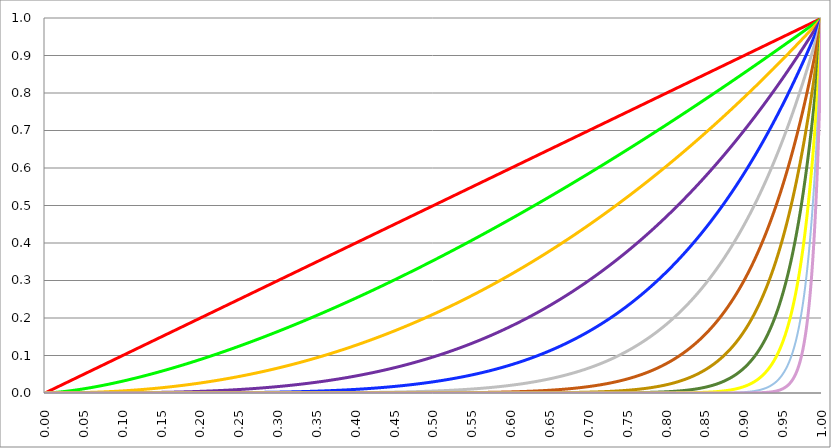
| Category | Series 0 | Series 3 | Series 4 | Series 5 | Series 2 | Series 6 | Series 7 | Series 8 | Series 9 | Series 10 | Series 11 | Series 12 |
|---|---|---|---|---|---|---|---|---|---|---|---|---|
| 0.0 | 0 | 0 | 0 | 0 | 0 | 0 | 0 | 0 | 0 | 0 | 0 | 0 |
| 0.0005 | 0 | 0 | 0 | 0 | 0 | 0 | 0 | 0 | 0 | 0 | 0 | 0 |
| 0.001 | 0.001 | 0 | 0 | 0 | 0 | 0 | 0 | 0 | 0 | 0 | 0 | 0 |
| 0.0015 | 0.002 | 0 | 0 | 0 | 0 | 0 | 0 | 0 | 0 | 0 | 0 | 0 |
| 0.002 | 0.002 | 0 | 0 | 0 | 0 | 0 | 0 | 0 | 0 | 0 | 0 | 0 |
| 0.0025 | 0.002 | 0 | 0 | 0 | 0 | 0 | 0 | 0 | 0 | 0 | 0 | 0 |
| 0.003 | 0.003 | 0 | 0 | 0 | 0 | 0 | 0 | 0 | 0 | 0 | 0 | 0 |
| 0.0035 | 0.004 | 0 | 0 | 0 | 0 | 0 | 0 | 0 | 0 | 0 | 0 | 0 |
| 0.004 | 0.004 | 0 | 0 | 0 | 0 | 0 | 0 | 0 | 0 | 0 | 0 | 0 |
| 0.0045 | 0.004 | 0 | 0 | 0 | 0 | 0 | 0 | 0 | 0 | 0 | 0 | 0 |
| 0.005 | 0.005 | 0 | 0 | 0 | 0 | 0 | 0 | 0 | 0 | 0 | 0 | 0 |
| 0.0055 | 0.006 | 0 | 0 | 0 | 0 | 0 | 0 | 0 | 0 | 0 | 0 | 0 |
| 0.006 | 0.006 | 0 | 0 | 0 | 0 | 0 | 0 | 0 | 0 | 0 | 0 | 0 |
| 0.0065 | 0.006 | 0.001 | 0 | 0 | 0 | 0 | 0 | 0 | 0 | 0 | 0 | 0 |
| 0.007 | 0.007 | 0.001 | 0 | 0 | 0 | 0 | 0 | 0 | 0 | 0 | 0 | 0 |
| 0.0075 | 0.008 | 0.001 | 0 | 0 | 0 | 0 | 0 | 0 | 0 | 0 | 0 | 0 |
| 0.008 | 0.008 | 0.001 | 0 | 0 | 0 | 0 | 0 | 0 | 0 | 0 | 0 | 0 |
| 0.0085 | 0.008 | 0.001 | 0 | 0 | 0 | 0 | 0 | 0 | 0 | 0 | 0 | 0 |
| 0.009 | 0.009 | 0.001 | 0 | 0 | 0 | 0 | 0 | 0 | 0 | 0 | 0 | 0 |
| 0.0095 | 0.01 | 0.001 | 0 | 0 | 0 | 0 | 0 | 0 | 0 | 0 | 0 | 0 |
| 0.01 | 0.01 | 0.001 | 0 | 0 | 0 | 0 | 0 | 0 | 0 | 0 | 0 | 0 |
| 0.0105 | 0.01 | 0.001 | 0 | 0 | 0 | 0 | 0 | 0 | 0 | 0 | 0 | 0 |
| 0.011 | 0.011 | 0.001 | 0 | 0 | 0 | 0 | 0 | 0 | 0 | 0 | 0 | 0 |
| 0.0115 | 0.012 | 0.001 | 0 | 0 | 0 | 0 | 0 | 0 | 0 | 0 | 0 | 0 |
| 0.012 | 0.012 | 0.001 | 0 | 0 | 0 | 0 | 0 | 0 | 0 | 0 | 0 | 0 |
| 0.0125 | 0.012 | 0.001 | 0 | 0 | 0 | 0 | 0 | 0 | 0 | 0 | 0 | 0 |
| 0.013 | 0.013 | 0.001 | 0 | 0 | 0 | 0 | 0 | 0 | 0 | 0 | 0 | 0 |
| 0.0135 | 0.014 | 0.002 | 0 | 0 | 0 | 0 | 0 | 0 | 0 | 0 | 0 | 0 |
| 0.014 | 0.014 | 0.002 | 0 | 0 | 0 | 0 | 0 | 0 | 0 | 0 | 0 | 0 |
| 0.0145 | 0.014 | 0.002 | 0 | 0 | 0 | 0 | 0 | 0 | 0 | 0 | 0 | 0 |
| 0.015 | 0.015 | 0.002 | 0 | 0 | 0 | 0 | 0 | 0 | 0 | 0 | 0 | 0 |
| 0.0155 | 0.016 | 0.002 | 0 | 0 | 0 | 0 | 0 | 0 | 0 | 0 | 0 | 0 |
| 0.016 | 0.016 | 0.002 | 0 | 0 | 0 | 0 | 0 | 0 | 0 | 0 | 0 | 0 |
| 0.0165 | 0.016 | 0.002 | 0 | 0 | 0 | 0 | 0 | 0 | 0 | 0 | 0 | 0 |
| 0.017 | 0.017 | 0.002 | 0 | 0 | 0 | 0 | 0 | 0 | 0 | 0 | 0 | 0 |
| 0.0175 | 0.018 | 0.002 | 0 | 0 | 0 | 0 | 0 | 0 | 0 | 0 | 0 | 0 |
| 0.018 | 0.018 | 0.002 | 0 | 0 | 0 | 0 | 0 | 0 | 0 | 0 | 0 | 0 |
| 0.0185 | 0.018 | 0.003 | 0 | 0 | 0 | 0 | 0 | 0 | 0 | 0 | 0 | 0 |
| 0.019 | 0.019 | 0.003 | 0 | 0 | 0 | 0 | 0 | 0 | 0 | 0 | 0 | 0 |
| 0.0195 | 0.02 | 0.003 | 0 | 0 | 0 | 0 | 0 | 0 | 0 | 0 | 0 | 0 |
| 0.02 | 0.02 | 0.003 | 0 | 0 | 0 | 0 | 0 | 0 | 0 | 0 | 0 | 0 |
| 0.0205 | 0.02 | 0.003 | 0 | 0 | 0 | 0 | 0 | 0 | 0 | 0 | 0 | 0 |
| 0.021 | 0.021 | 0.003 | 0 | 0 | 0 | 0 | 0 | 0 | 0 | 0 | 0 | 0 |
| 0.0215 | 0.022 | 0.003 | 0 | 0 | 0 | 0 | 0 | 0 | 0 | 0 | 0 | 0 |
| 0.022 | 0.022 | 0.003 | 0 | 0 | 0 | 0 | 0 | 0 | 0 | 0 | 0 | 0 |
| 0.0225 | 0.022 | 0.003 | 0 | 0 | 0 | 0 | 0 | 0 | 0 | 0 | 0 | 0 |
| 0.023 | 0.023 | 0.003 | 0 | 0 | 0 | 0 | 0 | 0 | 0 | 0 | 0 | 0 |
| 0.0235 | 0.024 | 0.004 | 0 | 0 | 0 | 0 | 0 | 0 | 0 | 0 | 0 | 0 |
| 0.024 | 0.024 | 0.004 | 0 | 0 | 0 | 0 | 0 | 0 | 0 | 0 | 0 | 0 |
| 0.0245 | 0.024 | 0.004 | 0 | 0 | 0 | 0 | 0 | 0 | 0 | 0 | 0 | 0 |
| 0.025 | 0.025 | 0.004 | 0 | 0 | 0 | 0 | 0 | 0 | 0 | 0 | 0 | 0 |
| 0.0255 | 0.026 | 0.004 | 0 | 0 | 0 | 0 | 0 | 0 | 0 | 0 | 0 | 0 |
| 0.026 | 0.026 | 0.004 | 0 | 0 | 0 | 0 | 0 | 0 | 0 | 0 | 0 | 0 |
| 0.0265 | 0.026 | 0.004 | 0 | 0 | 0 | 0 | 0 | 0 | 0 | 0 | 0 | 0 |
| 0.027 | 0.027 | 0.004 | 0 | 0 | 0 | 0 | 0 | 0 | 0 | 0 | 0 | 0 |
| 0.0275 | 0.028 | 0.005 | 0 | 0 | 0 | 0 | 0 | 0 | 0 | 0 | 0 | 0 |
| 0.028 | 0.028 | 0.005 | 0 | 0 | 0 | 0 | 0 | 0 | 0 | 0 | 0 | 0 |
| 0.0285 | 0.028 | 0.005 | 0 | 0 | 0 | 0 | 0 | 0 | 0 | 0 | 0 | 0 |
| 0.029 | 0.029 | 0.005 | 0 | 0 | 0 | 0 | 0 | 0 | 0 | 0 | 0 | 0 |
| 0.0295 | 0.03 | 0.005 | 0 | 0 | 0 | 0 | 0 | 0 | 0 | 0 | 0 | 0 |
| 0.03 | 0.03 | 0.005 | 0 | 0 | 0 | 0 | 0 | 0 | 0 | 0 | 0 | 0 |
| 0.0305 | 0.03 | 0.005 | 0 | 0 | 0 | 0 | 0 | 0 | 0 | 0 | 0 | 0 |
| 0.031 | 0.031 | 0.005 | 0 | 0 | 0 | 0 | 0 | 0 | 0 | 0 | 0 | 0 |
| 0.0315 | 0.032 | 0.006 | 0 | 0 | 0 | 0 | 0 | 0 | 0 | 0 | 0 | 0 |
| 0.032 | 0.032 | 0.006 | 0 | 0 | 0 | 0 | 0 | 0 | 0 | 0 | 0 | 0 |
| 0.0325 | 0.032 | 0.006 | 0 | 0 | 0 | 0 | 0 | 0 | 0 | 0 | 0 | 0 |
| 0.033 | 0.033 | 0.006 | 0 | 0 | 0 | 0 | 0 | 0 | 0 | 0 | 0 | 0 |
| 0.0335 | 0.034 | 0.006 | 0 | 0 | 0 | 0 | 0 | 0 | 0 | 0 | 0 | 0 |
| 0.034 | 0.034 | 0.006 | 0 | 0 | 0 | 0 | 0 | 0 | 0 | 0 | 0 | 0 |
| 0.0345 | 0.034 | 0.006 | 0.001 | 0 | 0 | 0 | 0 | 0 | 0 | 0 | 0 | 0 |
| 0.035 | 0.035 | 0.007 | 0.001 | 0 | 0 | 0 | 0 | 0 | 0 | 0 | 0 | 0 |
| 0.0355 | 0.036 | 0.007 | 0.001 | 0 | 0 | 0 | 0 | 0 | 0 | 0 | 0 | 0 |
| 0.036 | 0.036 | 0.007 | 0.001 | 0 | 0 | 0 | 0 | 0 | 0 | 0 | 0 | 0 |
| 0.0365 | 0.036 | 0.007 | 0.001 | 0 | 0 | 0 | 0 | 0 | 0 | 0 | 0 | 0 |
| 0.037 | 0.037 | 0.007 | 0.001 | 0 | 0 | 0 | 0 | 0 | 0 | 0 | 0 | 0 |
| 0.0375 | 0.038 | 0.007 | 0.001 | 0 | 0 | 0 | 0 | 0 | 0 | 0 | 0 | 0 |
| 0.038 | 0.038 | 0.007 | 0.001 | 0 | 0 | 0 | 0 | 0 | 0 | 0 | 0 | 0 |
| 0.0385 | 0.038 | 0.008 | 0.001 | 0 | 0 | 0 | 0 | 0 | 0 | 0 | 0 | 0 |
| 0.039 | 0.039 | 0.008 | 0.001 | 0 | 0 | 0 | 0 | 0 | 0 | 0 | 0 | 0 |
| 0.0395 | 0.04 | 0.008 | 0.001 | 0 | 0 | 0 | 0 | 0 | 0 | 0 | 0 | 0 |
| 0.04 | 0.04 | 0.008 | 0.001 | 0 | 0 | 0 | 0 | 0 | 0 | 0 | 0 | 0 |
| 0.0405 | 0.04 | 0.008 | 0.001 | 0 | 0 | 0 | 0 | 0 | 0 | 0 | 0 | 0 |
| 0.041 | 0.041 | 0.008 | 0.001 | 0 | 0 | 0 | 0 | 0 | 0 | 0 | 0 | 0 |
| 0.0415 | 0.042 | 0.008 | 0.001 | 0 | 0 | 0 | 0 | 0 | 0 | 0 | 0 | 0 |
| 0.042 | 0.042 | 0.009 | 0.001 | 0 | 0 | 0 | 0 | 0 | 0 | 0 | 0 | 0 |
| 0.0425 | 0.042 | 0.009 | 0.001 | 0 | 0 | 0 | 0 | 0 | 0 | 0 | 0 | 0 |
| 0.043 | 0.043 | 0.009 | 0.001 | 0 | 0 | 0 | 0 | 0 | 0 | 0 | 0 | 0 |
| 0.0435 | 0.044 | 0.009 | 0.001 | 0 | 0 | 0 | 0 | 0 | 0 | 0 | 0 | 0 |
| 0.044 | 0.044 | 0.009 | 0.001 | 0 | 0 | 0 | 0 | 0 | 0 | 0 | 0 | 0 |
| 0.0445 | 0.044 | 0.009 | 0.001 | 0 | 0 | 0 | 0 | 0 | 0 | 0 | 0 | 0 |
| 0.045 | 0.045 | 0.01 | 0.001 | 0 | 0 | 0 | 0 | 0 | 0 | 0 | 0 | 0 |
| 0.0455 | 0.046 | 0.01 | 0.001 | 0 | 0 | 0 | 0 | 0 | 0 | 0 | 0 | 0 |
| 0.046 | 0.046 | 0.01 | 0.001 | 0 | 0 | 0 | 0 | 0 | 0 | 0 | 0 | 0 |
| 0.0465 | 0.046 | 0.01 | 0.001 | 0 | 0 | 0 | 0 | 0 | 0 | 0 | 0 | 0 |
| 0.047 | 0.047 | 0.01 | 0.001 | 0 | 0 | 0 | 0 | 0 | 0 | 0 | 0 | 0 |
| 0.0475 | 0.048 | 0.01 | 0.001 | 0 | 0 | 0 | 0 | 0 | 0 | 0 | 0 | 0 |
| 0.048 | 0.048 | 0.011 | 0.001 | 0 | 0 | 0 | 0 | 0 | 0 | 0 | 0 | 0 |
| 0.0485 | 0.048 | 0.011 | 0.001 | 0 | 0 | 0 | 0 | 0 | 0 | 0 | 0 | 0 |
| 0.049 | 0.049 | 0.011 | 0.001 | 0 | 0 | 0 | 0 | 0 | 0 | 0 | 0 | 0 |
| 0.0495 | 0.05 | 0.011 | 0.001 | 0 | 0 | 0 | 0 | 0 | 0 | 0 | 0 | 0 |
| 0.05 | 0.05 | 0.011 | 0.001 | 0 | 0 | 0 | 0 | 0 | 0 | 0 | 0 | 0 |
| 0.0505 | 0.05 | 0.011 | 0.001 | 0 | 0 | 0 | 0 | 0 | 0 | 0 | 0 | 0 |
| 0.051 | 0.051 | 0.012 | 0.001 | 0 | 0 | 0 | 0 | 0 | 0 | 0 | 0 | 0 |
| 0.0515 | 0.052 | 0.012 | 0.001 | 0 | 0 | 0 | 0 | 0 | 0 | 0 | 0 | 0 |
| 0.052 | 0.052 | 0.012 | 0.001 | 0 | 0 | 0 | 0 | 0 | 0 | 0 | 0 | 0 |
| 0.0525 | 0.052 | 0.012 | 0.001 | 0 | 0 | 0 | 0 | 0 | 0 | 0 | 0 | 0 |
| 0.053 | 0.053 | 0.012 | 0.001 | 0 | 0 | 0 | 0 | 0 | 0 | 0 | 0 | 0 |
| 0.0535 | 0.054 | 0.012 | 0.001 | 0 | 0 | 0 | 0 | 0 | 0 | 0 | 0 | 0 |
| 0.054 | 0.054 | 0.013 | 0.001 | 0 | 0 | 0 | 0 | 0 | 0 | 0 | 0 | 0 |
| 0.0545 | 0.054 | 0.013 | 0.001 | 0 | 0 | 0 | 0 | 0 | 0 | 0 | 0 | 0 |
| 0.055 | 0.055 | 0.013 | 0.001 | 0 | 0 | 0 | 0 | 0 | 0 | 0 | 0 | 0 |
| 0.0555 | 0.056 | 0.013 | 0.001 | 0 | 0 | 0 | 0 | 0 | 0 | 0 | 0 | 0 |
| 0.056 | 0.056 | 0.013 | 0.002 | 0 | 0 | 0 | 0 | 0 | 0 | 0 | 0 | 0 |
| 0.0565 | 0.056 | 0.013 | 0.002 | 0 | 0 | 0 | 0 | 0 | 0 | 0 | 0 | 0 |
| 0.057 | 0.057 | 0.014 | 0.002 | 0 | 0 | 0 | 0 | 0 | 0 | 0 | 0 | 0 |
| 0.0575 | 0.058 | 0.014 | 0.002 | 0 | 0 | 0 | 0 | 0 | 0 | 0 | 0 | 0 |
| 0.058 | 0.058 | 0.014 | 0.002 | 0 | 0 | 0 | 0 | 0 | 0 | 0 | 0 | 0 |
| 0.0585 | 0.058 | 0.014 | 0.002 | 0 | 0 | 0 | 0 | 0 | 0 | 0 | 0 | 0 |
| 0.059 | 0.059 | 0.014 | 0.002 | 0 | 0 | 0 | 0 | 0 | 0 | 0 | 0 | 0 |
| 0.0595 | 0.06 | 0.015 | 0.002 | 0 | 0 | 0 | 0 | 0 | 0 | 0 | 0 | 0 |
| 0.06 | 0.06 | 0.015 | 0.002 | 0 | 0 | 0 | 0 | 0 | 0 | 0 | 0 | 0 |
| 0.0605 | 0.06 | 0.015 | 0.002 | 0 | 0 | 0 | 0 | 0 | 0 | 0 | 0 | 0 |
| 0.061 | 0.061 | 0.015 | 0.002 | 0 | 0 | 0 | 0 | 0 | 0 | 0 | 0 | 0 |
| 0.0615 | 0.062 | 0.015 | 0.002 | 0 | 0 | 0 | 0 | 0 | 0 | 0 | 0 | 0 |
| 0.062 | 0.062 | 0.015 | 0.002 | 0 | 0 | 0 | 0 | 0 | 0 | 0 | 0 | 0 |
| 0.0625 | 0.062 | 0.016 | 0.002 | 0 | 0 | 0 | 0 | 0 | 0 | 0 | 0 | 0 |
| 0.063 | 0.063 | 0.016 | 0.002 | 0 | 0 | 0 | 0 | 0 | 0 | 0 | 0 | 0 |
| 0.0635 | 0.064 | 0.016 | 0.002 | 0 | 0 | 0 | 0 | 0 | 0 | 0 | 0 | 0 |
| 0.064 | 0.064 | 0.016 | 0.002 | 0 | 0 | 0 | 0 | 0 | 0 | 0 | 0 | 0 |
| 0.0645 | 0.064 | 0.016 | 0.002 | 0 | 0 | 0 | 0 | 0 | 0 | 0 | 0 | 0 |
| 0.065 | 0.065 | 0.017 | 0.002 | 0 | 0 | 0 | 0 | 0 | 0 | 0 | 0 | 0 |
| 0.0655 | 0.066 | 0.017 | 0.002 | 0 | 0 | 0 | 0 | 0 | 0 | 0 | 0 | 0 |
| 0.066 | 0.066 | 0.017 | 0.002 | 0 | 0 | 0 | 0 | 0 | 0 | 0 | 0 | 0 |
| 0.0665 | 0.066 | 0.017 | 0.002 | 0 | 0 | 0 | 0 | 0 | 0 | 0 | 0 | 0 |
| 0.067 | 0.067 | 0.017 | 0.002 | 0 | 0 | 0 | 0 | 0 | 0 | 0 | 0 | 0 |
| 0.0675 | 0.068 | 0.018 | 0.002 | 0 | 0 | 0 | 0 | 0 | 0 | 0 | 0 | 0 |
| 0.068 | 0.068 | 0.018 | 0.002 | 0 | 0 | 0 | 0 | 0 | 0 | 0 | 0 | 0 |
| 0.0685 | 0.068 | 0.018 | 0.002 | 0 | 0 | 0 | 0 | 0 | 0 | 0 | 0 | 0 |
| 0.069 | 0.069 | 0.018 | 0.002 | 0 | 0 | 0 | 0 | 0 | 0 | 0 | 0 | 0 |
| 0.0695 | 0.07 | 0.018 | 0.002 | 0 | 0 | 0 | 0 | 0 | 0 | 0 | 0 | 0 |
| 0.07 | 0.07 | 0.019 | 0.003 | 0 | 0 | 0 | 0 | 0 | 0 | 0 | 0 | 0 |
| 0.0705 | 0.07 | 0.019 | 0.003 | 0 | 0 | 0 | 0 | 0 | 0 | 0 | 0 | 0 |
| 0.071 | 0.071 | 0.019 | 0.003 | 0 | 0 | 0 | 0 | 0 | 0 | 0 | 0 | 0 |
| 0.0715 | 0.072 | 0.019 | 0.003 | 0 | 0 | 0 | 0 | 0 | 0 | 0 | 0 | 0 |
| 0.072 | 0.072 | 0.019 | 0.003 | 0 | 0 | 0 | 0 | 0 | 0 | 0 | 0 | 0 |
| 0.0725 | 0.072 | 0.02 | 0.003 | 0 | 0 | 0 | 0 | 0 | 0 | 0 | 0 | 0 |
| 0.073 | 0.073 | 0.02 | 0.003 | 0 | 0 | 0 | 0 | 0 | 0 | 0 | 0 | 0 |
| 0.0735 | 0.074 | 0.02 | 0.003 | 0 | 0 | 0 | 0 | 0 | 0 | 0 | 0 | 0 |
| 0.074 | 0.074 | 0.02 | 0.003 | 0 | 0 | 0 | 0 | 0 | 0 | 0 | 0 | 0 |
| 0.0745 | 0.074 | 0.02 | 0.003 | 0 | 0 | 0 | 0 | 0 | 0 | 0 | 0 | 0 |
| 0.075 | 0.075 | 0.021 | 0.003 | 0 | 0 | 0 | 0 | 0 | 0 | 0 | 0 | 0 |
| 0.0755 | 0.076 | 0.021 | 0.003 | 0 | 0 | 0 | 0 | 0 | 0 | 0 | 0 | 0 |
| 0.076 | 0.076 | 0.021 | 0.003 | 0 | 0 | 0 | 0 | 0 | 0 | 0 | 0 | 0 |
| 0.0765 | 0.076 | 0.021 | 0.003 | 0 | 0 | 0 | 0 | 0 | 0 | 0 | 0 | 0 |
| 0.077 | 0.077 | 0.021 | 0.003 | 0 | 0 | 0 | 0 | 0 | 0 | 0 | 0 | 0 |
| 0.0775 | 0.078 | 0.022 | 0.003 | 0 | 0 | 0 | 0 | 0 | 0 | 0 | 0 | 0 |
| 0.078 | 0.078 | 0.022 | 0.003 | 0 | 0 | 0 | 0 | 0 | 0 | 0 | 0 | 0 |
| 0.0785 | 0.078 | 0.022 | 0.003 | 0 | 0 | 0 | 0 | 0 | 0 | 0 | 0 | 0 |
| 0.079 | 0.079 | 0.022 | 0.003 | 0 | 0 | 0 | 0 | 0 | 0 | 0 | 0 | 0 |
| 0.0795 | 0.08 | 0.022 | 0.003 | 0 | 0 | 0 | 0 | 0 | 0 | 0 | 0 | 0 |
| 0.08 | 0.08 | 0.023 | 0.003 | 0 | 0 | 0 | 0 | 0 | 0 | 0 | 0 | 0 |
| 0.0805 | 0.08 | 0.023 | 0.003 | 0 | 0 | 0 | 0 | 0 | 0 | 0 | 0 | 0 |
| 0.081 | 0.081 | 0.023 | 0.004 | 0 | 0 | 0 | 0 | 0 | 0 | 0 | 0 | 0 |
| 0.0815 | 0.082 | 0.023 | 0.004 | 0 | 0 | 0 | 0 | 0 | 0 | 0 | 0 | 0 |
| 0.082 | 0.082 | 0.023 | 0.004 | 0 | 0 | 0 | 0 | 0 | 0 | 0 | 0 | 0 |
| 0.0825 | 0.082 | 0.024 | 0.004 | 0 | 0 | 0 | 0 | 0 | 0 | 0 | 0 | 0 |
| 0.083 | 0.083 | 0.024 | 0.004 | 0 | 0 | 0 | 0 | 0 | 0 | 0 | 0 | 0 |
| 0.0835 | 0.084 | 0.024 | 0.004 | 0 | 0 | 0 | 0 | 0 | 0 | 0 | 0 | 0 |
| 0.084 | 0.084 | 0.024 | 0.004 | 0 | 0 | 0 | 0 | 0 | 0 | 0 | 0 | 0 |
| 0.0845 | 0.084 | 0.025 | 0.004 | 0 | 0 | 0 | 0 | 0 | 0 | 0 | 0 | 0 |
| 0.085 | 0.085 | 0.025 | 0.004 | 0 | 0 | 0 | 0 | 0 | 0 | 0 | 0 | 0 |
| 0.0855 | 0.086 | 0.025 | 0.004 | 0 | 0 | 0 | 0 | 0 | 0 | 0 | 0 | 0 |
| 0.086 | 0.086 | 0.025 | 0.004 | 0 | 0 | 0 | 0 | 0 | 0 | 0 | 0 | 0 |
| 0.0865 | 0.086 | 0.025 | 0.004 | 0 | 0 | 0 | 0 | 0 | 0 | 0 | 0 | 0 |
| 0.087 | 0.087 | 0.026 | 0.004 | 0 | 0 | 0 | 0 | 0 | 0 | 0 | 0 | 0 |
| 0.0875 | 0.088 | 0.026 | 0.004 | 0 | 0 | 0 | 0 | 0 | 0 | 0 | 0 | 0 |
| 0.088 | 0.088 | 0.026 | 0.004 | 0 | 0 | 0 | 0 | 0 | 0 | 0 | 0 | 0 |
| 0.0885 | 0.088 | 0.026 | 0.004 | 0 | 0 | 0 | 0 | 0 | 0 | 0 | 0 | 0 |
| 0.089 | 0.089 | 0.027 | 0.004 | 0 | 0 | 0 | 0 | 0 | 0 | 0 | 0 | 0 |
| 0.0895 | 0.09 | 0.027 | 0.004 | 0 | 0 | 0 | 0 | 0 | 0 | 0 | 0 | 0 |
| 0.09 | 0.09 | 0.027 | 0.004 | 0 | 0 | 0 | 0 | 0 | 0 | 0 | 0 | 0 |
| 0.0905 | 0.09 | 0.027 | 0.004 | 0 | 0 | 0 | 0 | 0 | 0 | 0 | 0 | 0 |
| 0.091 | 0.091 | 0.027 | 0.005 | 0 | 0 | 0 | 0 | 0 | 0 | 0 | 0 | 0 |
| 0.0915 | 0.092 | 0.028 | 0.005 | 0 | 0 | 0 | 0 | 0 | 0 | 0 | 0 | 0 |
| 0.092 | 0.092 | 0.028 | 0.005 | 0 | 0 | 0 | 0 | 0 | 0 | 0 | 0 | 0 |
| 0.0925 | 0.092 | 0.028 | 0.005 | 0 | 0 | 0 | 0 | 0 | 0 | 0 | 0 | 0 |
| 0.093 | 0.093 | 0.028 | 0.005 | 0 | 0 | 0 | 0 | 0 | 0 | 0 | 0 | 0 |
| 0.0935 | 0.094 | 0.029 | 0.005 | 0 | 0 | 0 | 0 | 0 | 0 | 0 | 0 | 0 |
| 0.094 | 0.094 | 0.029 | 0.005 | 0 | 0 | 0 | 0 | 0 | 0 | 0 | 0 | 0 |
| 0.0945 | 0.094 | 0.029 | 0.005 | 0 | 0 | 0 | 0 | 0 | 0 | 0 | 0 | 0 |
| 0.095 | 0.095 | 0.029 | 0.005 | 0 | 0 | 0 | 0 | 0 | 0 | 0 | 0 | 0 |
| 0.0955 | 0.096 | 0.03 | 0.005 | 0 | 0 | 0 | 0 | 0 | 0 | 0 | 0 | 0 |
| 0.096 | 0.096 | 0.03 | 0.005 | 0 | 0 | 0 | 0 | 0 | 0 | 0 | 0 | 0 |
| 0.0965 | 0.096 | 0.03 | 0.005 | 0 | 0 | 0 | 0 | 0 | 0 | 0 | 0 | 0 |
| 0.097 | 0.097 | 0.03 | 0.005 | 0 | 0 | 0 | 0 | 0 | 0 | 0 | 0 | 0 |
| 0.0975 | 0.098 | 0.03 | 0.005 | 0 | 0 | 0 | 0 | 0 | 0 | 0 | 0 | 0 |
| 0.098 | 0.098 | 0.031 | 0.005 | 0 | 0 | 0 | 0 | 0 | 0 | 0 | 0 | 0 |
| 0.0985 | 0.098 | 0.031 | 0.005 | 0 | 0 | 0 | 0 | 0 | 0 | 0 | 0 | 0 |
| 0.099 | 0.099 | 0.031 | 0.005 | 0 | 0 | 0 | 0 | 0 | 0 | 0 | 0 | 0 |
| 0.0995 | 0.1 | 0.031 | 0.006 | 0 | 0 | 0 | 0 | 0 | 0 | 0 | 0 | 0 |
| 0.1 | 0.1 | 0.032 | 0.006 | 0 | 0 | 0 | 0 | 0 | 0 | 0 | 0 | 0 |
| 0.1005 | 0.1 | 0.032 | 0.006 | 0 | 0 | 0 | 0 | 0 | 0 | 0 | 0 | 0 |
| 0.101 | 0.101 | 0.032 | 0.006 | 0 | 0 | 0 | 0 | 0 | 0 | 0 | 0 | 0 |
| 0.1015 | 0.102 | 0.032 | 0.006 | 0 | 0 | 0 | 0 | 0 | 0 | 0 | 0 | 0 |
| 0.102 | 0.102 | 0.033 | 0.006 | 0 | 0 | 0 | 0 | 0 | 0 | 0 | 0 | 0 |
| 0.1025 | 0.102 | 0.033 | 0.006 | 0 | 0 | 0 | 0 | 0 | 0 | 0 | 0 | 0 |
| 0.103 | 0.103 | 0.033 | 0.006 | 0 | 0 | 0 | 0 | 0 | 0 | 0 | 0 | 0 |
| 0.1035 | 0.104 | 0.033 | 0.006 | 0 | 0 | 0 | 0 | 0 | 0 | 0 | 0 | 0 |
| 0.104 | 0.104 | 0.034 | 0.006 | 0 | 0 | 0 | 0 | 0 | 0 | 0 | 0 | 0 |
| 0.1045 | 0.104 | 0.034 | 0.006 | 0 | 0 | 0 | 0 | 0 | 0 | 0 | 0 | 0 |
| 0.105 | 0.105 | 0.034 | 0.006 | 0 | 0 | 0 | 0 | 0 | 0 | 0 | 0 | 0 |
| 0.1055 | 0.106 | 0.034 | 0.006 | 0.001 | 0 | 0 | 0 | 0 | 0 | 0 | 0 | 0 |
| 0.106 | 0.106 | 0.035 | 0.006 | 0.001 | 0 | 0 | 0 | 0 | 0 | 0 | 0 | 0 |
| 0.1065 | 0.106 | 0.035 | 0.006 | 0.001 | 0 | 0 | 0 | 0 | 0 | 0 | 0 | 0 |
| 0.107 | 0.107 | 0.035 | 0.007 | 0.001 | 0 | 0 | 0 | 0 | 0 | 0 | 0 | 0 |
| 0.1075 | 0.108 | 0.035 | 0.007 | 0.001 | 0 | 0 | 0 | 0 | 0 | 0 | 0 | 0 |
| 0.108 | 0.108 | 0.035 | 0.007 | 0.001 | 0 | 0 | 0 | 0 | 0 | 0 | 0 | 0 |
| 0.1085 | 0.108 | 0.036 | 0.007 | 0.001 | 0 | 0 | 0 | 0 | 0 | 0 | 0 | 0 |
| 0.109 | 0.109 | 0.036 | 0.007 | 0.001 | 0 | 0 | 0 | 0 | 0 | 0 | 0 | 0 |
| 0.1095 | 0.11 | 0.036 | 0.007 | 0.001 | 0 | 0 | 0 | 0 | 0 | 0 | 0 | 0 |
| 0.11 | 0.11 | 0.036 | 0.007 | 0.001 | 0 | 0 | 0 | 0 | 0 | 0 | 0 | 0 |
| 0.1105 | 0.11 | 0.037 | 0.007 | 0.001 | 0 | 0 | 0 | 0 | 0 | 0 | 0 | 0 |
| 0.111 | 0.111 | 0.037 | 0.007 | 0.001 | 0 | 0 | 0 | 0 | 0 | 0 | 0 | 0 |
| 0.1115 | 0.112 | 0.037 | 0.007 | 0.001 | 0 | 0 | 0 | 0 | 0 | 0 | 0 | 0 |
| 0.112 | 0.112 | 0.037 | 0.007 | 0.001 | 0 | 0 | 0 | 0 | 0 | 0 | 0 | 0 |
| 0.1125 | 0.112 | 0.038 | 0.007 | 0.001 | 0 | 0 | 0 | 0 | 0 | 0 | 0 | 0 |
| 0.113 | 0.113 | 0.038 | 0.007 | 0.001 | 0 | 0 | 0 | 0 | 0 | 0 | 0 | 0 |
| 0.1135 | 0.114 | 0.038 | 0.007 | 0.001 | 0 | 0 | 0 | 0 | 0 | 0 | 0 | 0 |
| 0.114 | 0.114 | 0.038 | 0.008 | 0.001 | 0 | 0 | 0 | 0 | 0 | 0 | 0 | 0 |
| 0.1145 | 0.114 | 0.039 | 0.008 | 0.001 | 0 | 0 | 0 | 0 | 0 | 0 | 0 | 0 |
| 0.115 | 0.115 | 0.039 | 0.008 | 0.001 | 0 | 0 | 0 | 0 | 0 | 0 | 0 | 0 |
| 0.1155 | 0.116 | 0.039 | 0.008 | 0.001 | 0 | 0 | 0 | 0 | 0 | 0 | 0 | 0 |
| 0.116 | 0.116 | 0.04 | 0.008 | 0.001 | 0 | 0 | 0 | 0 | 0 | 0 | 0 | 0 |
| 0.1165 | 0.116 | 0.04 | 0.008 | 0.001 | 0 | 0 | 0 | 0 | 0 | 0 | 0 | 0 |
| 0.117 | 0.117 | 0.04 | 0.008 | 0.001 | 0 | 0 | 0 | 0 | 0 | 0 | 0 | 0 |
| 0.1175 | 0.118 | 0.04 | 0.008 | 0.001 | 0 | 0 | 0 | 0 | 0 | 0 | 0 | 0 |
| 0.118 | 0.118 | 0.041 | 0.008 | 0.001 | 0 | 0 | 0 | 0 | 0 | 0 | 0 | 0 |
| 0.1185 | 0.118 | 0.041 | 0.008 | 0.001 | 0 | 0 | 0 | 0 | 0 | 0 | 0 | 0 |
| 0.119 | 0.119 | 0.041 | 0.008 | 0.001 | 0 | 0 | 0 | 0 | 0 | 0 | 0 | 0 |
| 0.1195 | 0.12 | 0.041 | 0.008 | 0.001 | 0 | 0 | 0 | 0 | 0 | 0 | 0 | 0 |
| 0.12 | 0.12 | 0.042 | 0.008 | 0.001 | 0 | 0 | 0 | 0 | 0 | 0 | 0 | 0 |
| 0.1205 | 0.12 | 0.042 | 0.009 | 0.001 | 0 | 0 | 0 | 0 | 0 | 0 | 0 | 0 |
| 0.121 | 0.121 | 0.042 | 0.009 | 0.001 | 0 | 0 | 0 | 0 | 0 | 0 | 0 | 0 |
| 0.1215 | 0.122 | 0.042 | 0.009 | 0.001 | 0 | 0 | 0 | 0 | 0 | 0 | 0 | 0 |
| 0.122 | 0.122 | 0.043 | 0.009 | 0.001 | 0 | 0 | 0 | 0 | 0 | 0 | 0 | 0 |
| 0.1225 | 0.122 | 0.043 | 0.009 | 0.001 | 0 | 0 | 0 | 0 | 0 | 0 | 0 | 0 |
| 0.123 | 0.123 | 0.043 | 0.009 | 0.001 | 0 | 0 | 0 | 0 | 0 | 0 | 0 | 0 |
| 0.1235 | 0.124 | 0.043 | 0.009 | 0.001 | 0 | 0 | 0 | 0 | 0 | 0 | 0 | 0 |
| 0.124 | 0.124 | 0.044 | 0.009 | 0.001 | 0 | 0 | 0 | 0 | 0 | 0 | 0 | 0 |
| 0.1245 | 0.124 | 0.044 | 0.009 | 0.001 | 0 | 0 | 0 | 0 | 0 | 0 | 0 | 0 |
| 0.125 | 0.125 | 0.044 | 0.009 | 0.001 | 0 | 0 | 0 | 0 | 0 | 0 | 0 | 0 |
| 0.1255 | 0.126 | 0.044 | 0.009 | 0.001 | 0 | 0 | 0 | 0 | 0 | 0 | 0 | 0 |
| 0.126 | 0.126 | 0.045 | 0.009 | 0.001 | 0 | 0 | 0 | 0 | 0 | 0 | 0 | 0 |
| 0.1265 | 0.126 | 0.045 | 0.01 | 0.001 | 0 | 0 | 0 | 0 | 0 | 0 | 0 | 0 |
| 0.127 | 0.127 | 0.045 | 0.01 | 0.001 | 0 | 0 | 0 | 0 | 0 | 0 | 0 | 0 |
| 0.1275 | 0.128 | 0.046 | 0.01 | 0.001 | 0 | 0 | 0 | 0 | 0 | 0 | 0 | 0 |
| 0.128 | 0.128 | 0.046 | 0.01 | 0.001 | 0 | 0 | 0 | 0 | 0 | 0 | 0 | 0 |
| 0.1285 | 0.128 | 0.046 | 0.01 | 0.001 | 0 | 0 | 0 | 0 | 0 | 0 | 0 | 0 |
| 0.129 | 0.129 | 0.046 | 0.01 | 0.001 | 0 | 0 | 0 | 0 | 0 | 0 | 0 | 0 |
| 0.1295 | 0.13 | 0.047 | 0.01 | 0.001 | 0 | 0 | 0 | 0 | 0 | 0 | 0 | 0 |
| 0.13 | 0.13 | 0.047 | 0.01 | 0.001 | 0 | 0 | 0 | 0 | 0 | 0 | 0 | 0 |
| 0.1305 | 0.13 | 0.047 | 0.01 | 0.001 | 0 | 0 | 0 | 0 | 0 | 0 | 0 | 0 |
| 0.131 | 0.131 | 0.047 | 0.01 | 0.001 | 0 | 0 | 0 | 0 | 0 | 0 | 0 | 0 |
| 0.1315 | 0.132 | 0.048 | 0.01 | 0.001 | 0 | 0 | 0 | 0 | 0 | 0 | 0 | 0 |
| 0.132 | 0.132 | 0.048 | 0.011 | 0.001 | 0 | 0 | 0 | 0 | 0 | 0 | 0 | 0 |
| 0.1325 | 0.132 | 0.048 | 0.011 | 0.001 | 0 | 0 | 0 | 0 | 0 | 0 | 0 | 0 |
| 0.133 | 0.133 | 0.049 | 0.011 | 0.001 | 0 | 0 | 0 | 0 | 0 | 0 | 0 | 0 |
| 0.1335 | 0.134 | 0.049 | 0.011 | 0.001 | 0 | 0 | 0 | 0 | 0 | 0 | 0 | 0 |
| 0.134 | 0.134 | 0.049 | 0.011 | 0.001 | 0 | 0 | 0 | 0 | 0 | 0 | 0 | 0 |
| 0.1345 | 0.134 | 0.049 | 0.011 | 0.001 | 0 | 0 | 0 | 0 | 0 | 0 | 0 | 0 |
| 0.135 | 0.135 | 0.05 | 0.011 | 0.001 | 0 | 0 | 0 | 0 | 0 | 0 | 0 | 0 |
| 0.1355 | 0.136 | 0.05 | 0.011 | 0.001 | 0 | 0 | 0 | 0 | 0 | 0 | 0 | 0 |
| 0.136 | 0.136 | 0.05 | 0.011 | 0.001 | 0 | 0 | 0 | 0 | 0 | 0 | 0 | 0 |
| 0.1365 | 0.136 | 0.05 | 0.011 | 0.001 | 0 | 0 | 0 | 0 | 0 | 0 | 0 | 0 |
| 0.137 | 0.137 | 0.051 | 0.011 | 0.001 | 0 | 0 | 0 | 0 | 0 | 0 | 0 | 0 |
| 0.1375 | 0.138 | 0.051 | 0.012 | 0.001 | 0 | 0 | 0 | 0 | 0 | 0 | 0 | 0 |
| 0.138 | 0.138 | 0.051 | 0.012 | 0.001 | 0 | 0 | 0 | 0 | 0 | 0 | 0 | 0 |
| 0.1385 | 0.138 | 0.052 | 0.012 | 0.001 | 0 | 0 | 0 | 0 | 0 | 0 | 0 | 0 |
| 0.139 | 0.139 | 0.052 | 0.012 | 0.001 | 0 | 0 | 0 | 0 | 0 | 0 | 0 | 0 |
| 0.1395 | 0.14 | 0.052 | 0.012 | 0.001 | 0 | 0 | 0 | 0 | 0 | 0 | 0 | 0 |
| 0.14 | 0.14 | 0.052 | 0.012 | 0.001 | 0 | 0 | 0 | 0 | 0 | 0 | 0 | 0 |
| 0.1405 | 0.14 | 0.053 | 0.012 | 0.001 | 0 | 0 | 0 | 0 | 0 | 0 | 0 | 0 |
| 0.141 | 0.141 | 0.053 | 0.012 | 0.001 | 0 | 0 | 0 | 0 | 0 | 0 | 0 | 0 |
| 0.1415 | 0.142 | 0.053 | 0.012 | 0.001 | 0 | 0 | 0 | 0 | 0 | 0 | 0 | 0 |
| 0.142 | 0.142 | 0.054 | 0.012 | 0.001 | 0 | 0 | 0 | 0 | 0 | 0 | 0 | 0 |
| 0.1425 | 0.142 | 0.054 | 0.012 | 0.001 | 0 | 0 | 0 | 0 | 0 | 0 | 0 | 0 |
| 0.143 | 0.143 | 0.054 | 0.013 | 0.001 | 0 | 0 | 0 | 0 | 0 | 0 | 0 | 0 |
| 0.1435 | 0.144 | 0.054 | 0.013 | 0.001 | 0 | 0 | 0 | 0 | 0 | 0 | 0 | 0 |
| 0.144 | 0.144 | 0.055 | 0.013 | 0.001 | 0 | 0 | 0 | 0 | 0 | 0 | 0 | 0 |
| 0.1445 | 0.144 | 0.055 | 0.013 | 0.001 | 0 | 0 | 0 | 0 | 0 | 0 | 0 | 0 |
| 0.145 | 0.145 | 0.055 | 0.013 | 0.001 | 0 | 0 | 0 | 0 | 0 | 0 | 0 | 0 |
| 0.1455 | 0.146 | 0.056 | 0.013 | 0.001 | 0 | 0 | 0 | 0 | 0 | 0 | 0 | 0 |
| 0.146 | 0.146 | 0.056 | 0.013 | 0.002 | 0 | 0 | 0 | 0 | 0 | 0 | 0 | 0 |
| 0.1465 | 0.146 | 0.056 | 0.013 | 0.002 | 0 | 0 | 0 | 0 | 0 | 0 | 0 | 0 |
| 0.147 | 0.147 | 0.056 | 0.013 | 0.002 | 0 | 0 | 0 | 0 | 0 | 0 | 0 | 0 |
| 0.1475 | 0.148 | 0.057 | 0.013 | 0.002 | 0 | 0 | 0 | 0 | 0 | 0 | 0 | 0 |
| 0.148 | 0.148 | 0.057 | 0.014 | 0.002 | 0 | 0 | 0 | 0 | 0 | 0 | 0 | 0 |
| 0.1485 | 0.148 | 0.057 | 0.014 | 0.002 | 0 | 0 | 0 | 0 | 0 | 0 | 0 | 0 |
| 0.149 | 0.149 | 0.058 | 0.014 | 0.002 | 0 | 0 | 0 | 0 | 0 | 0 | 0 | 0 |
| 0.1495 | 0.15 | 0.058 | 0.014 | 0.002 | 0 | 0 | 0 | 0 | 0 | 0 | 0 | 0 |
| 0.15 | 0.15 | 0.058 | 0.014 | 0.002 | 0 | 0 | 0 | 0 | 0 | 0 | 0 | 0 |
| 0.1505 | 0.15 | 0.058 | 0.014 | 0.002 | 0 | 0 | 0 | 0 | 0 | 0 | 0 | 0 |
| 0.151 | 0.151 | 0.059 | 0.014 | 0.002 | 0 | 0 | 0 | 0 | 0 | 0 | 0 | 0 |
| 0.1515 | 0.152 | 0.059 | 0.014 | 0.002 | 0 | 0 | 0 | 0 | 0 | 0 | 0 | 0 |
| 0.152 | 0.152 | 0.059 | 0.014 | 0.002 | 0 | 0 | 0 | 0 | 0 | 0 | 0 | 0 |
| 0.1525 | 0.152 | 0.06 | 0.015 | 0.002 | 0 | 0 | 0 | 0 | 0 | 0 | 0 | 0 |
| 0.153 | 0.153 | 0.06 | 0.015 | 0.002 | 0 | 0 | 0 | 0 | 0 | 0 | 0 | 0 |
| 0.1535 | 0.154 | 0.06 | 0.015 | 0.002 | 0 | 0 | 0 | 0 | 0 | 0 | 0 | 0 |
| 0.154 | 0.154 | 0.06 | 0.015 | 0.002 | 0 | 0 | 0 | 0 | 0 | 0 | 0 | 0 |
| 0.1545 | 0.154 | 0.061 | 0.015 | 0.002 | 0 | 0 | 0 | 0 | 0 | 0 | 0 | 0 |
| 0.155 | 0.155 | 0.061 | 0.015 | 0.002 | 0 | 0 | 0 | 0 | 0 | 0 | 0 | 0 |
| 0.1555 | 0.156 | 0.061 | 0.015 | 0.002 | 0 | 0 | 0 | 0 | 0 | 0 | 0 | 0 |
| 0.156 | 0.156 | 0.062 | 0.015 | 0.002 | 0 | 0 | 0 | 0 | 0 | 0 | 0 | 0 |
| 0.1565 | 0.156 | 0.062 | 0.015 | 0.002 | 0 | 0 | 0 | 0 | 0 | 0 | 0 | 0 |
| 0.157 | 0.157 | 0.062 | 0.016 | 0.002 | 0 | 0 | 0 | 0 | 0 | 0 | 0 | 0 |
| 0.1575 | 0.158 | 0.063 | 0.016 | 0.002 | 0 | 0 | 0 | 0 | 0 | 0 | 0 | 0 |
| 0.158 | 0.158 | 0.063 | 0.016 | 0.002 | 0 | 0 | 0 | 0 | 0 | 0 | 0 | 0 |
| 0.1585 | 0.158 | 0.063 | 0.016 | 0.002 | 0 | 0 | 0 | 0 | 0 | 0 | 0 | 0 |
| 0.159 | 0.159 | 0.063 | 0.016 | 0.002 | 0 | 0 | 0 | 0 | 0 | 0 | 0 | 0 |
| 0.1595 | 0.16 | 0.064 | 0.016 | 0.002 | 0 | 0 | 0 | 0 | 0 | 0 | 0 | 0 |
| 0.16 | 0.16 | 0.064 | 0.016 | 0.002 | 0 | 0 | 0 | 0 | 0 | 0 | 0 | 0 |
| 0.1605 | 0.16 | 0.064 | 0.016 | 0.002 | 0 | 0 | 0 | 0 | 0 | 0 | 0 | 0 |
| 0.161 | 0.161 | 0.065 | 0.016 | 0.002 | 0 | 0 | 0 | 0 | 0 | 0 | 0 | 0 |
| 0.1615 | 0.162 | 0.065 | 0.017 | 0.002 | 0 | 0 | 0 | 0 | 0 | 0 | 0 | 0 |
| 0.162 | 0.162 | 0.065 | 0.017 | 0.002 | 0 | 0 | 0 | 0 | 0 | 0 | 0 | 0 |
| 0.1625 | 0.162 | 0.066 | 0.017 | 0.002 | 0 | 0 | 0 | 0 | 0 | 0 | 0 | 0 |
| 0.163 | 0.163 | 0.066 | 0.017 | 0.002 | 0 | 0 | 0 | 0 | 0 | 0 | 0 | 0 |
| 0.1635 | 0.164 | 0.066 | 0.017 | 0.002 | 0 | 0 | 0 | 0 | 0 | 0 | 0 | 0 |
| 0.164 | 0.164 | 0.066 | 0.017 | 0.002 | 0 | 0 | 0 | 0 | 0 | 0 | 0 | 0 |
| 0.1645 | 0.164 | 0.067 | 0.017 | 0.002 | 0 | 0 | 0 | 0 | 0 | 0 | 0 | 0 |
| 0.165 | 0.165 | 0.067 | 0.017 | 0.002 | 0 | 0 | 0 | 0 | 0 | 0 | 0 | 0 |
| 0.1655 | 0.166 | 0.067 | 0.017 | 0.002 | 0 | 0 | 0 | 0 | 0 | 0 | 0 | 0 |
| 0.166 | 0.166 | 0.068 | 0.018 | 0.002 | 0 | 0 | 0 | 0 | 0 | 0 | 0 | 0 |
| 0.1665 | 0.166 | 0.068 | 0.018 | 0.002 | 0 | 0 | 0 | 0 | 0 | 0 | 0 | 0 |
| 0.167 | 0.167 | 0.068 | 0.018 | 0.002 | 0 | 0 | 0 | 0 | 0 | 0 | 0 | 0 |
| 0.1675 | 0.168 | 0.069 | 0.018 | 0.002 | 0 | 0 | 0 | 0 | 0 | 0 | 0 | 0 |
| 0.168 | 0.168 | 0.069 | 0.018 | 0.002 | 0 | 0 | 0 | 0 | 0 | 0 | 0 | 0 |
| 0.1685 | 0.168 | 0.069 | 0.018 | 0.002 | 0 | 0 | 0 | 0 | 0 | 0 | 0 | 0 |
| 0.169 | 0.169 | 0.069 | 0.018 | 0.002 | 0 | 0 | 0 | 0 | 0 | 0 | 0 | 0 |
| 0.1695 | 0.17 | 0.07 | 0.018 | 0.003 | 0 | 0 | 0 | 0 | 0 | 0 | 0 | 0 |
| 0.17 | 0.17 | 0.07 | 0.019 | 0.003 | 0 | 0 | 0 | 0 | 0 | 0 | 0 | 0 |
| 0.1705 | 0.17 | 0.07 | 0.019 | 0.003 | 0 | 0 | 0 | 0 | 0 | 0 | 0 | 0 |
| 0.171 | 0.171 | 0.071 | 0.019 | 0.003 | 0 | 0 | 0 | 0 | 0 | 0 | 0 | 0 |
| 0.1715 | 0.172 | 0.071 | 0.019 | 0.003 | 0 | 0 | 0 | 0 | 0 | 0 | 0 | 0 |
| 0.172 | 0.172 | 0.071 | 0.019 | 0.003 | 0 | 0 | 0 | 0 | 0 | 0 | 0 | 0 |
| 0.1725 | 0.172 | 0.072 | 0.019 | 0.003 | 0 | 0 | 0 | 0 | 0 | 0 | 0 | 0 |
| 0.173 | 0.173 | 0.072 | 0.019 | 0.003 | 0 | 0 | 0 | 0 | 0 | 0 | 0 | 0 |
| 0.1735 | 0.174 | 0.072 | 0.019 | 0.003 | 0 | 0 | 0 | 0 | 0 | 0 | 0 | 0 |
| 0.174 | 0.174 | 0.073 | 0.02 | 0.003 | 0 | 0 | 0 | 0 | 0 | 0 | 0 | 0 |
| 0.1745 | 0.174 | 0.073 | 0.02 | 0.003 | 0 | 0 | 0 | 0 | 0 | 0 | 0 | 0 |
| 0.175 | 0.175 | 0.073 | 0.02 | 0.003 | 0 | 0 | 0 | 0 | 0 | 0 | 0 | 0 |
| 0.1755 | 0.176 | 0.074 | 0.02 | 0.003 | 0 | 0 | 0 | 0 | 0 | 0 | 0 | 0 |
| 0.176 | 0.176 | 0.074 | 0.02 | 0.003 | 0 | 0 | 0 | 0 | 0 | 0 | 0 | 0 |
| 0.1765 | 0.176 | 0.074 | 0.02 | 0.003 | 0 | 0 | 0 | 0 | 0 | 0 | 0 | 0 |
| 0.177 | 0.177 | 0.074 | 0.02 | 0.003 | 0 | 0 | 0 | 0 | 0 | 0 | 0 | 0 |
| 0.1775 | 0.178 | 0.075 | 0.02 | 0.003 | 0 | 0 | 0 | 0 | 0 | 0 | 0 | 0 |
| 0.178 | 0.178 | 0.075 | 0.021 | 0.003 | 0 | 0 | 0 | 0 | 0 | 0 | 0 | 0 |
| 0.1785 | 0.178 | 0.075 | 0.021 | 0.003 | 0 | 0 | 0 | 0 | 0 | 0 | 0 | 0 |
| 0.179 | 0.179 | 0.076 | 0.021 | 0.003 | 0 | 0 | 0 | 0 | 0 | 0 | 0 | 0 |
| 0.1795 | 0.18 | 0.076 | 0.021 | 0.003 | 0 | 0 | 0 | 0 | 0 | 0 | 0 | 0 |
| 0.18 | 0.18 | 0.076 | 0.021 | 0.003 | 0 | 0 | 0 | 0 | 0 | 0 | 0 | 0 |
| 0.1805 | 0.18 | 0.077 | 0.021 | 0.003 | 0 | 0 | 0 | 0 | 0 | 0 | 0 | 0 |
| 0.181 | 0.181 | 0.077 | 0.021 | 0.003 | 0 | 0 | 0 | 0 | 0 | 0 | 0 | 0 |
| 0.1815 | 0.182 | 0.077 | 0.022 | 0.003 | 0 | 0 | 0 | 0 | 0 | 0 | 0 | 0 |
| 0.182 | 0.182 | 0.078 | 0.022 | 0.003 | 0 | 0 | 0 | 0 | 0 | 0 | 0 | 0 |
| 0.1825 | 0.182 | 0.078 | 0.022 | 0.003 | 0 | 0 | 0 | 0 | 0 | 0 | 0 | 0 |
| 0.183 | 0.183 | 0.078 | 0.022 | 0.003 | 0 | 0 | 0 | 0 | 0 | 0 | 0 | 0 |
| 0.1835 | 0.184 | 0.079 | 0.022 | 0.003 | 0 | 0 | 0 | 0 | 0 | 0 | 0 | 0 |
| 0.184 | 0.184 | 0.079 | 0.022 | 0.003 | 0 | 0 | 0 | 0 | 0 | 0 | 0 | 0 |
| 0.1845 | 0.184 | 0.079 | 0.022 | 0.003 | 0 | 0 | 0 | 0 | 0 | 0 | 0 | 0 |
| 0.185 | 0.185 | 0.08 | 0.022 | 0.003 | 0 | 0 | 0 | 0 | 0 | 0 | 0 | 0 |
| 0.1855 | 0.186 | 0.08 | 0.023 | 0.003 | 0 | 0 | 0 | 0 | 0 | 0 | 0 | 0 |
| 0.186 | 0.186 | 0.08 | 0.023 | 0.003 | 0 | 0 | 0 | 0 | 0 | 0 | 0 | 0 |
| 0.1865 | 0.186 | 0.081 | 0.023 | 0.003 | 0 | 0 | 0 | 0 | 0 | 0 | 0 | 0 |
| 0.187 | 0.187 | 0.081 | 0.023 | 0.003 | 0 | 0 | 0 | 0 | 0 | 0 | 0 | 0 |
| 0.1875 | 0.188 | 0.081 | 0.023 | 0.004 | 0 | 0 | 0 | 0 | 0 | 0 | 0 | 0 |
| 0.188 | 0.188 | 0.082 | 0.023 | 0.004 | 0 | 0 | 0 | 0 | 0 | 0 | 0 | 0 |
| 0.1885 | 0.188 | 0.082 | 0.023 | 0.004 | 0 | 0 | 0 | 0 | 0 | 0 | 0 | 0 |
| 0.189 | 0.189 | 0.082 | 0.024 | 0.004 | 0 | 0 | 0 | 0 | 0 | 0 | 0 | 0 |
| 0.1895 | 0.19 | 0.082 | 0.024 | 0.004 | 0 | 0 | 0 | 0 | 0 | 0 | 0 | 0 |
| 0.19 | 0.19 | 0.083 | 0.024 | 0.004 | 0 | 0 | 0 | 0 | 0 | 0 | 0 | 0 |
| 0.1905 | 0.19 | 0.083 | 0.024 | 0.004 | 0 | 0 | 0 | 0 | 0 | 0 | 0 | 0 |
| 0.191 | 0.191 | 0.083 | 0.024 | 0.004 | 0 | 0 | 0 | 0 | 0 | 0 | 0 | 0 |
| 0.1915 | 0.192 | 0.084 | 0.024 | 0.004 | 0 | 0 | 0 | 0 | 0 | 0 | 0 | 0 |
| 0.192 | 0.192 | 0.084 | 0.024 | 0.004 | 0 | 0 | 0 | 0 | 0 | 0 | 0 | 0 |
| 0.1925 | 0.192 | 0.084 | 0.025 | 0.004 | 0 | 0 | 0 | 0 | 0 | 0 | 0 | 0 |
| 0.193 | 0.193 | 0.085 | 0.025 | 0.004 | 0 | 0 | 0 | 0 | 0 | 0 | 0 | 0 |
| 0.1935 | 0.194 | 0.085 | 0.025 | 0.004 | 0 | 0 | 0 | 0 | 0 | 0 | 0 | 0 |
| 0.194 | 0.194 | 0.085 | 0.025 | 0.004 | 0 | 0 | 0 | 0 | 0 | 0 | 0 | 0 |
| 0.1945 | 0.194 | 0.086 | 0.025 | 0.004 | 0 | 0 | 0 | 0 | 0 | 0 | 0 | 0 |
| 0.195 | 0.195 | 0.086 | 0.025 | 0.004 | 0 | 0 | 0 | 0 | 0 | 0 | 0 | 0 |
| 0.1955 | 0.196 | 0.086 | 0.025 | 0.004 | 0 | 0 | 0 | 0 | 0 | 0 | 0 | 0 |
| 0.196 | 0.196 | 0.087 | 0.026 | 0.004 | 0 | 0 | 0 | 0 | 0 | 0 | 0 | 0 |
| 0.1965 | 0.196 | 0.087 | 0.026 | 0.004 | 0 | 0 | 0 | 0 | 0 | 0 | 0 | 0 |
| 0.197 | 0.197 | 0.087 | 0.026 | 0.004 | 0 | 0 | 0 | 0 | 0 | 0 | 0 | 0 |
| 0.1975 | 0.198 | 0.088 | 0.026 | 0.004 | 0 | 0 | 0 | 0 | 0 | 0 | 0 | 0 |
| 0.198 | 0.198 | 0.088 | 0.026 | 0.004 | 0 | 0 | 0 | 0 | 0 | 0 | 0 | 0 |
| 0.1985 | 0.198 | 0.088 | 0.026 | 0.004 | 0 | 0 | 0 | 0 | 0 | 0 | 0 | 0 |
| 0.199 | 0.199 | 0.089 | 0.026 | 0.004 | 0 | 0 | 0 | 0 | 0 | 0 | 0 | 0 |
| 0.1995 | 0.2 | 0.089 | 0.027 | 0.004 | 0 | 0 | 0 | 0 | 0 | 0 | 0 | 0 |
| 0.2 | 0.2 | 0.089 | 0.027 | 0.004 | 0 | 0 | 0 | 0 | 0 | 0 | 0 | 0 |
| 0.2005 | 0.2 | 0.09 | 0.027 | 0.004 | 0 | 0 | 0 | 0 | 0 | 0 | 0 | 0 |
| 0.201 | 0.201 | 0.09 | 0.027 | 0.004 | 0 | 0 | 0 | 0 | 0 | 0 | 0 | 0 |
| 0.2015 | 0.202 | 0.09 | 0.027 | 0.004 | 0 | 0 | 0 | 0 | 0 | 0 | 0 | 0 |
| 0.202 | 0.202 | 0.091 | 0.027 | 0.005 | 0 | 0 | 0 | 0 | 0 | 0 | 0 | 0 |
| 0.2025 | 0.202 | 0.091 | 0.028 | 0.005 | 0 | 0 | 0 | 0 | 0 | 0 | 0 | 0 |
| 0.203 | 0.203 | 0.091 | 0.028 | 0.005 | 0 | 0 | 0 | 0 | 0 | 0 | 0 | 0 |
| 0.2035 | 0.204 | 0.092 | 0.028 | 0.005 | 0 | 0 | 0 | 0 | 0 | 0 | 0 | 0 |
| 0.204 | 0.204 | 0.092 | 0.028 | 0.005 | 0 | 0 | 0 | 0 | 0 | 0 | 0 | 0 |
| 0.2045 | 0.204 | 0.092 | 0.028 | 0.005 | 0 | 0 | 0 | 0 | 0 | 0 | 0 | 0 |
| 0.205 | 0.205 | 0.093 | 0.028 | 0.005 | 0 | 0 | 0 | 0 | 0 | 0 | 0 | 0 |
| 0.2055 | 0.206 | 0.093 | 0.028 | 0.005 | 0 | 0 | 0 | 0 | 0 | 0 | 0 | 0 |
| 0.206 | 0.206 | 0.093 | 0.029 | 0.005 | 0 | 0 | 0 | 0 | 0 | 0 | 0 | 0 |
| 0.2065 | 0.206 | 0.094 | 0.029 | 0.005 | 0 | 0 | 0 | 0 | 0 | 0 | 0 | 0 |
| 0.207 | 0.207 | 0.094 | 0.029 | 0.005 | 0 | 0 | 0 | 0 | 0 | 0 | 0 | 0 |
| 0.2075 | 0.208 | 0.095 | 0.029 | 0.005 | 0 | 0 | 0 | 0 | 0 | 0 | 0 | 0 |
| 0.208 | 0.208 | 0.095 | 0.029 | 0.005 | 0 | 0 | 0 | 0 | 0 | 0 | 0 | 0 |
| 0.2085 | 0.208 | 0.095 | 0.029 | 0.005 | 0 | 0 | 0 | 0 | 0 | 0 | 0 | 0 |
| 0.209 | 0.209 | 0.096 | 0.03 | 0.005 | 0 | 0 | 0 | 0 | 0 | 0 | 0 | 0 |
| 0.2095 | 0.21 | 0.096 | 0.03 | 0.005 | 0 | 0 | 0 | 0 | 0 | 0 | 0 | 0 |
| 0.21 | 0.21 | 0.096 | 0.03 | 0.005 | 0 | 0 | 0 | 0 | 0 | 0 | 0 | 0 |
| 0.2105 | 0.21 | 0.097 | 0.03 | 0.005 | 0 | 0 | 0 | 0 | 0 | 0 | 0 | 0 |
| 0.211 | 0.211 | 0.097 | 0.03 | 0.005 | 0 | 0 | 0 | 0 | 0 | 0 | 0 | 0 |
| 0.2115 | 0.212 | 0.097 | 0.03 | 0.005 | 0 | 0 | 0 | 0 | 0 | 0 | 0 | 0 |
| 0.212 | 0.212 | 0.098 | 0.03 | 0.005 | 0 | 0 | 0 | 0 | 0 | 0 | 0 | 0 |
| 0.2125 | 0.212 | 0.098 | 0.031 | 0.005 | 0 | 0 | 0 | 0 | 0 | 0 | 0 | 0 |
| 0.213 | 0.213 | 0.098 | 0.031 | 0.005 | 0 | 0 | 0 | 0 | 0 | 0 | 0 | 0 |
| 0.2135 | 0.214 | 0.099 | 0.031 | 0.005 | 0 | 0 | 0 | 0 | 0 | 0 | 0 | 0 |
| 0.214 | 0.214 | 0.099 | 0.031 | 0.005 | 0 | 0 | 0 | 0 | 0 | 0 | 0 | 0 |
| 0.2145 | 0.214 | 0.099 | 0.031 | 0.006 | 0 | 0 | 0 | 0 | 0 | 0 | 0 | 0 |
| 0.215 | 0.215 | 0.1 | 0.031 | 0.006 | 0 | 0 | 0 | 0 | 0 | 0 | 0 | 0 |
| 0.2155 | 0.216 | 0.1 | 0.032 | 0.006 | 0 | 0 | 0 | 0 | 0 | 0 | 0 | 0 |
| 0.216 | 0.216 | 0.1 | 0.032 | 0.006 | 0 | 0 | 0 | 0 | 0 | 0 | 0 | 0 |
| 0.2165 | 0.216 | 0.101 | 0.032 | 0.006 | 0 | 0 | 0 | 0 | 0 | 0 | 0 | 0 |
| 0.217 | 0.217 | 0.101 | 0.032 | 0.006 | 0 | 0 | 0 | 0 | 0 | 0 | 0 | 0 |
| 0.2175 | 0.218 | 0.101 | 0.032 | 0.006 | 0 | 0 | 0 | 0 | 0 | 0 | 0 | 0 |
| 0.218 | 0.218 | 0.102 | 0.032 | 0.006 | 0 | 0 | 0 | 0 | 0 | 0 | 0 | 0 |
| 0.2185 | 0.218 | 0.102 | 0.033 | 0.006 | 0 | 0 | 0 | 0 | 0 | 0 | 0 | 0 |
| 0.219 | 0.219 | 0.102 | 0.033 | 0.006 | 0 | 0 | 0 | 0 | 0 | 0 | 0 | 0 |
| 0.2195 | 0.22 | 0.103 | 0.033 | 0.006 | 0 | 0 | 0 | 0 | 0 | 0 | 0 | 0 |
| 0.22 | 0.22 | 0.103 | 0.033 | 0.006 | 0 | 0 | 0 | 0 | 0 | 0 | 0 | 0 |
| 0.2205 | 0.22 | 0.104 | 0.033 | 0.006 | 0 | 0 | 0 | 0 | 0 | 0 | 0 | 0 |
| 0.221 | 0.221 | 0.104 | 0.033 | 0.006 | 0 | 0 | 0 | 0 | 0 | 0 | 0 | 0 |
| 0.2215 | 0.222 | 0.104 | 0.034 | 0.006 | 0 | 0 | 0 | 0 | 0 | 0 | 0 | 0 |
| 0.222 | 0.222 | 0.105 | 0.034 | 0.006 | 0 | 0 | 0 | 0 | 0 | 0 | 0 | 0 |
| 0.2225 | 0.222 | 0.105 | 0.034 | 0.006 | 0 | 0 | 0 | 0 | 0 | 0 | 0 | 0 |
| 0.223 | 0.223 | 0.105 | 0.034 | 0.006 | 0.001 | 0 | 0 | 0 | 0 | 0 | 0 | 0 |
| 0.2235 | 0.224 | 0.106 | 0.034 | 0.006 | 0.001 | 0 | 0 | 0 | 0 | 0 | 0 | 0 |
| 0.224 | 0.224 | 0.106 | 0.035 | 0.006 | 0.001 | 0 | 0 | 0 | 0 | 0 | 0 | 0 |
| 0.2245 | 0.224 | 0.106 | 0.035 | 0.006 | 0.001 | 0 | 0 | 0 | 0 | 0 | 0 | 0 |
| 0.225 | 0.225 | 0.107 | 0.035 | 0.007 | 0.001 | 0 | 0 | 0 | 0 | 0 | 0 | 0 |
| 0.2255 | 0.226 | 0.107 | 0.035 | 0.007 | 0.001 | 0 | 0 | 0 | 0 | 0 | 0 | 0 |
| 0.226 | 0.226 | 0.107 | 0.035 | 0.007 | 0.001 | 0 | 0 | 0 | 0 | 0 | 0 | 0 |
| 0.2265 | 0.226 | 0.108 | 0.035 | 0.007 | 0.001 | 0 | 0 | 0 | 0 | 0 | 0 | 0 |
| 0.227 | 0.227 | 0.108 | 0.036 | 0.007 | 0.001 | 0 | 0 | 0 | 0 | 0 | 0 | 0 |
| 0.2275 | 0.228 | 0.109 | 0.036 | 0.007 | 0.001 | 0 | 0 | 0 | 0 | 0 | 0 | 0 |
| 0.228 | 0.228 | 0.109 | 0.036 | 0.007 | 0.001 | 0 | 0 | 0 | 0 | 0 | 0 | 0 |
| 0.2285 | 0.228 | 0.109 | 0.036 | 0.007 | 0.001 | 0 | 0 | 0 | 0 | 0 | 0 | 0 |
| 0.229 | 0.229 | 0.11 | 0.036 | 0.007 | 0.001 | 0 | 0 | 0 | 0 | 0 | 0 | 0 |
| 0.2295 | 0.23 | 0.11 | 0.036 | 0.007 | 0.001 | 0 | 0 | 0 | 0 | 0 | 0 | 0 |
| 0.23 | 0.23 | 0.11 | 0.037 | 0.007 | 0.001 | 0 | 0 | 0 | 0 | 0 | 0 | 0 |
| 0.2305 | 0.23 | 0.111 | 0.037 | 0.007 | 0.001 | 0 | 0 | 0 | 0 | 0 | 0 | 0 |
| 0.231 | 0.231 | 0.111 | 0.037 | 0.007 | 0.001 | 0 | 0 | 0 | 0 | 0 | 0 | 0 |
| 0.2315 | 0.232 | 0.111 | 0.037 | 0.007 | 0.001 | 0 | 0 | 0 | 0 | 0 | 0 | 0 |
| 0.232 | 0.232 | 0.112 | 0.037 | 0.007 | 0.001 | 0 | 0 | 0 | 0 | 0 | 0 | 0 |
| 0.2325 | 0.232 | 0.112 | 0.038 | 0.007 | 0.001 | 0 | 0 | 0 | 0 | 0 | 0 | 0 |
| 0.233 | 0.233 | 0.112 | 0.038 | 0.007 | 0.001 | 0 | 0 | 0 | 0 | 0 | 0 | 0 |
| 0.2335 | 0.234 | 0.113 | 0.038 | 0.007 | 0.001 | 0 | 0 | 0 | 0 | 0 | 0 | 0 |
| 0.234 | 0.234 | 0.113 | 0.038 | 0.007 | 0.001 | 0 | 0 | 0 | 0 | 0 | 0 | 0 |
| 0.2345 | 0.234 | 0.114 | 0.038 | 0.007 | 0.001 | 0 | 0 | 0 | 0 | 0 | 0 | 0 |
| 0.235 | 0.235 | 0.114 | 0.038 | 0.008 | 0.001 | 0 | 0 | 0 | 0 | 0 | 0 | 0 |
| 0.2355 | 0.236 | 0.114 | 0.039 | 0.008 | 0.001 | 0 | 0 | 0 | 0 | 0 | 0 | 0 |
| 0.236 | 0.236 | 0.115 | 0.039 | 0.008 | 0.001 | 0 | 0 | 0 | 0 | 0 | 0 | 0 |
| 0.2365 | 0.236 | 0.115 | 0.039 | 0.008 | 0.001 | 0 | 0 | 0 | 0 | 0 | 0 | 0 |
| 0.237 | 0.237 | 0.115 | 0.039 | 0.008 | 0.001 | 0 | 0 | 0 | 0 | 0 | 0 | 0 |
| 0.2375 | 0.238 | 0.116 | 0.039 | 0.008 | 0.001 | 0 | 0 | 0 | 0 | 0 | 0 | 0 |
| 0.238 | 0.238 | 0.116 | 0.04 | 0.008 | 0.001 | 0 | 0 | 0 | 0 | 0 | 0 | 0 |
| 0.2385 | 0.238 | 0.116 | 0.04 | 0.008 | 0.001 | 0 | 0 | 0 | 0 | 0 | 0 | 0 |
| 0.239 | 0.239 | 0.117 | 0.04 | 0.008 | 0.001 | 0 | 0 | 0 | 0 | 0 | 0 | 0 |
| 0.2395 | 0.24 | 0.117 | 0.04 | 0.008 | 0.001 | 0 | 0 | 0 | 0 | 0 | 0 | 0 |
| 0.24 | 0.24 | 0.118 | 0.04 | 0.008 | 0.001 | 0 | 0 | 0 | 0 | 0 | 0 | 0 |
| 0.2405 | 0.24 | 0.118 | 0.041 | 0.008 | 0.001 | 0 | 0 | 0 | 0 | 0 | 0 | 0 |
| 0.241 | 0.241 | 0.118 | 0.041 | 0.008 | 0.001 | 0 | 0 | 0 | 0 | 0 | 0 | 0 |
| 0.2415 | 0.242 | 0.119 | 0.041 | 0.008 | 0.001 | 0 | 0 | 0 | 0 | 0 | 0 | 0 |
| 0.242 | 0.242 | 0.119 | 0.041 | 0.008 | 0.001 | 0 | 0 | 0 | 0 | 0 | 0 | 0 |
| 0.2425 | 0.242 | 0.119 | 0.041 | 0.008 | 0.001 | 0 | 0 | 0 | 0 | 0 | 0 | 0 |
| 0.243 | 0.243 | 0.12 | 0.041 | 0.008 | 0.001 | 0 | 0 | 0 | 0 | 0 | 0 | 0 |
| 0.2435 | 0.244 | 0.12 | 0.042 | 0.009 | 0.001 | 0 | 0 | 0 | 0 | 0 | 0 | 0 |
| 0.244 | 0.244 | 0.121 | 0.042 | 0.009 | 0.001 | 0 | 0 | 0 | 0 | 0 | 0 | 0 |
| 0.2445 | 0.244 | 0.121 | 0.042 | 0.009 | 0.001 | 0 | 0 | 0 | 0 | 0 | 0 | 0 |
| 0.245 | 0.245 | 0.121 | 0.042 | 0.009 | 0.001 | 0 | 0 | 0 | 0 | 0 | 0 | 0 |
| 0.2455 | 0.246 | 0.122 | 0.042 | 0.009 | 0.001 | 0 | 0 | 0 | 0 | 0 | 0 | 0 |
| 0.246 | 0.246 | 0.122 | 0.043 | 0.009 | 0.001 | 0 | 0 | 0 | 0 | 0 | 0 | 0 |
| 0.2465 | 0.246 | 0.122 | 0.043 | 0.009 | 0.001 | 0 | 0 | 0 | 0 | 0 | 0 | 0 |
| 0.247 | 0.247 | 0.123 | 0.043 | 0.009 | 0.001 | 0 | 0 | 0 | 0 | 0 | 0 | 0 |
| 0.2475 | 0.248 | 0.123 | 0.043 | 0.009 | 0.001 | 0 | 0 | 0 | 0 | 0 | 0 | 0 |
| 0.248 | 0.248 | 0.124 | 0.043 | 0.009 | 0.001 | 0 | 0 | 0 | 0 | 0 | 0 | 0 |
| 0.2485 | 0.248 | 0.124 | 0.044 | 0.009 | 0.001 | 0 | 0 | 0 | 0 | 0 | 0 | 0 |
| 0.249 | 0.249 | 0.124 | 0.044 | 0.009 | 0.001 | 0 | 0 | 0 | 0 | 0 | 0 | 0 |
| 0.2495 | 0.25 | 0.125 | 0.044 | 0.009 | 0.001 | 0 | 0 | 0 | 0 | 0 | 0 | 0 |
| 0.25 | 0.25 | 0.125 | 0.044 | 0.009 | 0.001 | 0 | 0 | 0 | 0 | 0 | 0 | 0 |
| 0.2505 | 0.25 | 0.125 | 0.044 | 0.009 | 0.001 | 0 | 0 | 0 | 0 | 0 | 0 | 0 |
| 0.251 | 0.251 | 0.126 | 0.045 | 0.009 | 0.001 | 0 | 0 | 0 | 0 | 0 | 0 | 0 |
| 0.2515 | 0.252 | 0.126 | 0.045 | 0.009 | 0.001 | 0 | 0 | 0 | 0 | 0 | 0 | 0 |
| 0.252 | 0.252 | 0.127 | 0.045 | 0.01 | 0.001 | 0 | 0 | 0 | 0 | 0 | 0 | 0 |
| 0.2525 | 0.252 | 0.127 | 0.045 | 0.01 | 0.001 | 0 | 0 | 0 | 0 | 0 | 0 | 0 |
| 0.253 | 0.253 | 0.127 | 0.045 | 0.01 | 0.001 | 0 | 0 | 0 | 0 | 0 | 0 | 0 |
| 0.2535 | 0.254 | 0.128 | 0.046 | 0.01 | 0.001 | 0 | 0 | 0 | 0 | 0 | 0 | 0 |
| 0.254 | 0.254 | 0.128 | 0.046 | 0.01 | 0.001 | 0 | 0 | 0 | 0 | 0 | 0 | 0 |
| 0.2545 | 0.254 | 0.128 | 0.046 | 0.01 | 0.001 | 0 | 0 | 0 | 0 | 0 | 0 | 0 |
| 0.255 | 0.255 | 0.129 | 0.046 | 0.01 | 0.001 | 0 | 0 | 0 | 0 | 0 | 0 | 0 |
| 0.2555 | 0.256 | 0.129 | 0.046 | 0.01 | 0.001 | 0 | 0 | 0 | 0 | 0 | 0 | 0 |
| 0.256 | 0.256 | 0.13 | 0.047 | 0.01 | 0.001 | 0 | 0 | 0 | 0 | 0 | 0 | 0 |
| 0.2565 | 0.256 | 0.13 | 0.047 | 0.01 | 0.001 | 0 | 0 | 0 | 0 | 0 | 0 | 0 |
| 0.257 | 0.257 | 0.13 | 0.047 | 0.01 | 0.001 | 0 | 0 | 0 | 0 | 0 | 0 | 0 |
| 0.2575 | 0.258 | 0.131 | 0.047 | 0.01 | 0.001 | 0 | 0 | 0 | 0 | 0 | 0 | 0 |
| 0.258 | 0.258 | 0.131 | 0.047 | 0.01 | 0.001 | 0 | 0 | 0 | 0 | 0 | 0 | 0 |
| 0.2585 | 0.258 | 0.131 | 0.048 | 0.01 | 0.001 | 0 | 0 | 0 | 0 | 0 | 0 | 0 |
| 0.259 | 0.259 | 0.132 | 0.048 | 0.01 | 0.001 | 0 | 0 | 0 | 0 | 0 | 0 | 0 |
| 0.2595 | 0.26 | 0.132 | 0.048 | 0.011 | 0.001 | 0 | 0 | 0 | 0 | 0 | 0 | 0 |
| 0.26 | 0.26 | 0.133 | 0.048 | 0.011 | 0.001 | 0 | 0 | 0 | 0 | 0 | 0 | 0 |
| 0.2605 | 0.26 | 0.133 | 0.048 | 0.011 | 0.001 | 0 | 0 | 0 | 0 | 0 | 0 | 0 |
| 0.261 | 0.261 | 0.133 | 0.049 | 0.011 | 0.001 | 0 | 0 | 0 | 0 | 0 | 0 | 0 |
| 0.2615 | 0.262 | 0.134 | 0.049 | 0.011 | 0.001 | 0 | 0 | 0 | 0 | 0 | 0 | 0 |
| 0.262 | 0.262 | 0.134 | 0.049 | 0.011 | 0.001 | 0 | 0 | 0 | 0 | 0 | 0 | 0 |
| 0.2625 | 0.262 | 0.134 | 0.049 | 0.011 | 0.001 | 0 | 0 | 0 | 0 | 0 | 0 | 0 |
| 0.263 | 0.263 | 0.135 | 0.05 | 0.011 | 0.001 | 0 | 0 | 0 | 0 | 0 | 0 | 0 |
| 0.2635 | 0.264 | 0.135 | 0.05 | 0.011 | 0.001 | 0 | 0 | 0 | 0 | 0 | 0 | 0 |
| 0.264 | 0.264 | 0.136 | 0.05 | 0.011 | 0.001 | 0 | 0 | 0 | 0 | 0 | 0 | 0 |
| 0.2645 | 0.264 | 0.136 | 0.05 | 0.011 | 0.001 | 0 | 0 | 0 | 0 | 0 | 0 | 0 |
| 0.265 | 0.265 | 0.136 | 0.05 | 0.011 | 0.001 | 0 | 0 | 0 | 0 | 0 | 0 | 0 |
| 0.2655 | 0.266 | 0.137 | 0.051 | 0.011 | 0.001 | 0 | 0 | 0 | 0 | 0 | 0 | 0 |
| 0.266 | 0.266 | 0.137 | 0.051 | 0.011 | 0.001 | 0 | 0 | 0 | 0 | 0 | 0 | 0 |
| 0.2665 | 0.266 | 0.138 | 0.051 | 0.012 | 0.001 | 0 | 0 | 0 | 0 | 0 | 0 | 0 |
| 0.267 | 0.267 | 0.138 | 0.051 | 0.012 | 0.001 | 0 | 0 | 0 | 0 | 0 | 0 | 0 |
| 0.2675 | 0.268 | 0.138 | 0.051 | 0.012 | 0.001 | 0 | 0 | 0 | 0 | 0 | 0 | 0 |
| 0.268 | 0.268 | 0.139 | 0.052 | 0.012 | 0.001 | 0 | 0 | 0 | 0 | 0 | 0 | 0 |
| 0.2685 | 0.268 | 0.139 | 0.052 | 0.012 | 0.001 | 0 | 0 | 0 | 0 | 0 | 0 | 0 |
| 0.269 | 0.269 | 0.14 | 0.052 | 0.012 | 0.001 | 0 | 0 | 0 | 0 | 0 | 0 | 0 |
| 0.2695 | 0.27 | 0.14 | 0.052 | 0.012 | 0.001 | 0 | 0 | 0 | 0 | 0 | 0 | 0 |
| 0.27 | 0.27 | 0.14 | 0.053 | 0.012 | 0.001 | 0 | 0 | 0 | 0 | 0 | 0 | 0 |
| 0.2705 | 0.27 | 0.141 | 0.053 | 0.012 | 0.001 | 0 | 0 | 0 | 0 | 0 | 0 | 0 |
| 0.271 | 0.271 | 0.141 | 0.053 | 0.012 | 0.001 | 0 | 0 | 0 | 0 | 0 | 0 | 0 |
| 0.2715 | 0.272 | 0.141 | 0.053 | 0.012 | 0.001 | 0 | 0 | 0 | 0 | 0 | 0 | 0 |
| 0.272 | 0.272 | 0.142 | 0.053 | 0.012 | 0.001 | 0 | 0 | 0 | 0 | 0 | 0 | 0 |
| 0.2725 | 0.272 | 0.142 | 0.054 | 0.012 | 0.001 | 0 | 0 | 0 | 0 | 0 | 0 | 0 |
| 0.273 | 0.273 | 0.143 | 0.054 | 0.013 | 0.001 | 0 | 0 | 0 | 0 | 0 | 0 | 0 |
| 0.2735 | 0.274 | 0.143 | 0.054 | 0.013 | 0.001 | 0 | 0 | 0 | 0 | 0 | 0 | 0 |
| 0.274 | 0.274 | 0.143 | 0.054 | 0.013 | 0.001 | 0 | 0 | 0 | 0 | 0 | 0 | 0 |
| 0.2745 | 0.274 | 0.144 | 0.055 | 0.013 | 0.001 | 0 | 0 | 0 | 0 | 0 | 0 | 0 |
| 0.275 | 0.275 | 0.144 | 0.055 | 0.013 | 0.001 | 0 | 0 | 0 | 0 | 0 | 0 | 0 |
| 0.2755 | 0.276 | 0.145 | 0.055 | 0.013 | 0.001 | 0 | 0 | 0 | 0 | 0 | 0 | 0 |
| 0.276 | 0.276 | 0.145 | 0.055 | 0.013 | 0.001 | 0 | 0 | 0 | 0 | 0 | 0 | 0 |
| 0.2765 | 0.276 | 0.145 | 0.055 | 0.013 | 0.001 | 0 | 0 | 0 | 0 | 0 | 0 | 0 |
| 0.277 | 0.277 | 0.146 | 0.056 | 0.013 | 0.002 | 0 | 0 | 0 | 0 | 0 | 0 | 0 |
| 0.2775 | 0.278 | 0.146 | 0.056 | 0.013 | 0.002 | 0 | 0 | 0 | 0 | 0 | 0 | 0 |
| 0.278 | 0.278 | 0.147 | 0.056 | 0.013 | 0.002 | 0 | 0 | 0 | 0 | 0 | 0 | 0 |
| 0.2785 | 0.278 | 0.147 | 0.056 | 0.013 | 0.002 | 0 | 0 | 0 | 0 | 0 | 0 | 0 |
| 0.279 | 0.279 | 0.147 | 0.057 | 0.013 | 0.002 | 0 | 0 | 0 | 0 | 0 | 0 | 0 |
| 0.2795 | 0.28 | 0.148 | 0.057 | 0.014 | 0.002 | 0 | 0 | 0 | 0 | 0 | 0 | 0 |
| 0.28 | 0.28 | 0.148 | 0.057 | 0.014 | 0.002 | 0 | 0 | 0 | 0 | 0 | 0 | 0 |
| 0.2805 | 0.28 | 0.149 | 0.057 | 0.014 | 0.002 | 0 | 0 | 0 | 0 | 0 | 0 | 0 |
| 0.281 | 0.281 | 0.149 | 0.057 | 0.014 | 0.002 | 0 | 0 | 0 | 0 | 0 | 0 | 0 |
| 0.2815 | 0.282 | 0.149 | 0.058 | 0.014 | 0.002 | 0 | 0 | 0 | 0 | 0 | 0 | 0 |
| 0.282 | 0.282 | 0.15 | 0.058 | 0.014 | 0.002 | 0 | 0 | 0 | 0 | 0 | 0 | 0 |
| 0.2825 | 0.282 | 0.15 | 0.058 | 0.014 | 0.002 | 0 | 0 | 0 | 0 | 0 | 0 | 0 |
| 0.283 | 0.283 | 0.151 | 0.058 | 0.014 | 0.002 | 0 | 0 | 0 | 0 | 0 | 0 | 0 |
| 0.2835 | 0.284 | 0.151 | 0.059 | 0.014 | 0.002 | 0 | 0 | 0 | 0 | 0 | 0 | 0 |
| 0.284 | 0.284 | 0.151 | 0.059 | 0.014 | 0.002 | 0 | 0 | 0 | 0 | 0 | 0 | 0 |
| 0.2845 | 0.284 | 0.152 | 0.059 | 0.014 | 0.002 | 0 | 0 | 0 | 0 | 0 | 0 | 0 |
| 0.285 | 0.285 | 0.152 | 0.059 | 0.014 | 0.002 | 0 | 0 | 0 | 0 | 0 | 0 | 0 |
| 0.2855 | 0.286 | 0.153 | 0.06 | 0.015 | 0.002 | 0 | 0 | 0 | 0 | 0 | 0 | 0 |
| 0.286 | 0.286 | 0.153 | 0.06 | 0.015 | 0.002 | 0 | 0 | 0 | 0 | 0 | 0 | 0 |
| 0.2865 | 0.286 | 0.153 | 0.06 | 0.015 | 0.002 | 0 | 0 | 0 | 0 | 0 | 0 | 0 |
| 0.287 | 0.287 | 0.154 | 0.06 | 0.015 | 0.002 | 0 | 0 | 0 | 0 | 0 | 0 | 0 |
| 0.2875 | 0.288 | 0.154 | 0.061 | 0.015 | 0.002 | 0 | 0 | 0 | 0 | 0 | 0 | 0 |
| 0.288 | 0.288 | 0.155 | 0.061 | 0.015 | 0.002 | 0 | 0 | 0 | 0 | 0 | 0 | 0 |
| 0.2885 | 0.288 | 0.155 | 0.061 | 0.015 | 0.002 | 0 | 0 | 0 | 0 | 0 | 0 | 0 |
| 0.289 | 0.289 | 0.155 | 0.061 | 0.015 | 0.002 | 0 | 0 | 0 | 0 | 0 | 0 | 0 |
| 0.2895 | 0.29 | 0.156 | 0.061 | 0.015 | 0.002 | 0 | 0 | 0 | 0 | 0 | 0 | 0 |
| 0.29 | 0.29 | 0.156 | 0.062 | 0.015 | 0.002 | 0 | 0 | 0 | 0 | 0 | 0 | 0 |
| 0.2905 | 0.29 | 0.157 | 0.062 | 0.015 | 0.002 | 0 | 0 | 0 | 0 | 0 | 0 | 0 |
| 0.291 | 0.291 | 0.157 | 0.062 | 0.016 | 0.002 | 0 | 0 | 0 | 0 | 0 | 0 | 0 |
| 0.2915 | 0.292 | 0.157 | 0.062 | 0.016 | 0.002 | 0 | 0 | 0 | 0 | 0 | 0 | 0 |
| 0.292 | 0.292 | 0.158 | 0.063 | 0.016 | 0.002 | 0 | 0 | 0 | 0 | 0 | 0 | 0 |
| 0.2925 | 0.292 | 0.158 | 0.063 | 0.016 | 0.002 | 0 | 0 | 0 | 0 | 0 | 0 | 0 |
| 0.293 | 0.293 | 0.159 | 0.063 | 0.016 | 0.002 | 0 | 0 | 0 | 0 | 0 | 0 | 0 |
| 0.2935 | 0.294 | 0.159 | 0.063 | 0.016 | 0.002 | 0 | 0 | 0 | 0 | 0 | 0 | 0 |
| 0.294 | 0.294 | 0.159 | 0.064 | 0.016 | 0.002 | 0 | 0 | 0 | 0 | 0 | 0 | 0 |
| 0.2945 | 0.294 | 0.16 | 0.064 | 0.016 | 0.002 | 0 | 0 | 0 | 0 | 0 | 0 | 0 |
| 0.295 | 0.295 | 0.16 | 0.064 | 0.016 | 0.002 | 0 | 0 | 0 | 0 | 0 | 0 | 0 |
| 0.2955 | 0.296 | 0.161 | 0.064 | 0.016 | 0.002 | 0 | 0 | 0 | 0 | 0 | 0 | 0 |
| 0.296 | 0.296 | 0.161 | 0.065 | 0.016 | 0.002 | 0 | 0 | 0 | 0 | 0 | 0 | 0 |
| 0.2965 | 0.296 | 0.161 | 0.065 | 0.017 | 0.002 | 0 | 0 | 0 | 0 | 0 | 0 | 0 |
| 0.297 | 0.297 | 0.162 | 0.065 | 0.017 | 0.002 | 0 | 0 | 0 | 0 | 0 | 0 | 0 |
| 0.2975 | 0.298 | 0.162 | 0.065 | 0.017 | 0.002 | 0 | 0 | 0 | 0 | 0 | 0 | 0 |
| 0.298 | 0.298 | 0.163 | 0.066 | 0.017 | 0.002 | 0 | 0 | 0 | 0 | 0 | 0 | 0 |
| 0.2985 | 0.298 | 0.163 | 0.066 | 0.017 | 0.002 | 0 | 0 | 0 | 0 | 0 | 0 | 0 |
| 0.299 | 0.299 | 0.163 | 0.066 | 0.017 | 0.002 | 0 | 0 | 0 | 0 | 0 | 0 | 0 |
| 0.2995 | 0.3 | 0.164 | 0.066 | 0.017 | 0.002 | 0 | 0 | 0 | 0 | 0 | 0 | 0 |
| 0.3 | 0.3 | 0.164 | 0.067 | 0.017 | 0.002 | 0 | 0 | 0 | 0 | 0 | 0 | 0 |
| 0.3005 | 0.3 | 0.165 | 0.067 | 0.017 | 0.002 | 0 | 0 | 0 | 0 | 0 | 0 | 0 |
| 0.301 | 0.301 | 0.165 | 0.067 | 0.017 | 0.002 | 0 | 0 | 0 | 0 | 0 | 0 | 0 |
| 0.3015 | 0.302 | 0.166 | 0.067 | 0.017 | 0.002 | 0 | 0 | 0 | 0 | 0 | 0 | 0 |
| 0.302 | 0.302 | 0.166 | 0.068 | 0.018 | 0.002 | 0 | 0 | 0 | 0 | 0 | 0 | 0 |
| 0.3025 | 0.302 | 0.166 | 0.068 | 0.018 | 0.002 | 0 | 0 | 0 | 0 | 0 | 0 | 0 |
| 0.303 | 0.303 | 0.167 | 0.068 | 0.018 | 0.002 | 0 | 0 | 0 | 0 | 0 | 0 | 0 |
| 0.3035 | 0.304 | 0.167 | 0.068 | 0.018 | 0.002 | 0 | 0 | 0 | 0 | 0 | 0 | 0 |
| 0.304 | 0.304 | 0.168 | 0.069 | 0.018 | 0.002 | 0 | 0 | 0 | 0 | 0 | 0 | 0 |
| 0.3045 | 0.304 | 0.168 | 0.069 | 0.018 | 0.002 | 0 | 0 | 0 | 0 | 0 | 0 | 0 |
| 0.305 | 0.305 | 0.168 | 0.069 | 0.018 | 0.002 | 0 | 0 | 0 | 0 | 0 | 0 | 0 |
| 0.3055 | 0.306 | 0.169 | 0.069 | 0.018 | 0.002 | 0 | 0 | 0 | 0 | 0 | 0 | 0 |
| 0.306 | 0.306 | 0.169 | 0.07 | 0.018 | 0.002 | 0 | 0 | 0 | 0 | 0 | 0 | 0 |
| 0.3065 | 0.306 | 0.17 | 0.07 | 0.018 | 0.003 | 0 | 0 | 0 | 0 | 0 | 0 | 0 |
| 0.307 | 0.307 | 0.17 | 0.07 | 0.019 | 0.003 | 0 | 0 | 0 | 0 | 0 | 0 | 0 |
| 0.3075 | 0.308 | 0.171 | 0.07 | 0.019 | 0.003 | 0 | 0 | 0 | 0 | 0 | 0 | 0 |
| 0.308 | 0.308 | 0.171 | 0.071 | 0.019 | 0.003 | 0 | 0 | 0 | 0 | 0 | 0 | 0 |
| 0.3085 | 0.308 | 0.171 | 0.071 | 0.019 | 0.003 | 0 | 0 | 0 | 0 | 0 | 0 | 0 |
| 0.309 | 0.309 | 0.172 | 0.071 | 0.019 | 0.003 | 0 | 0 | 0 | 0 | 0 | 0 | 0 |
| 0.3095 | 0.31 | 0.172 | 0.071 | 0.019 | 0.003 | 0 | 0 | 0 | 0 | 0 | 0 | 0 |
| 0.31 | 0.31 | 0.173 | 0.072 | 0.019 | 0.003 | 0 | 0 | 0 | 0 | 0 | 0 | 0 |
| 0.3105 | 0.31 | 0.173 | 0.072 | 0.019 | 0.003 | 0 | 0 | 0 | 0 | 0 | 0 | 0 |
| 0.311 | 0.311 | 0.173 | 0.072 | 0.019 | 0.003 | 0 | 0 | 0 | 0 | 0 | 0 | 0 |
| 0.3115 | 0.312 | 0.174 | 0.072 | 0.02 | 0.003 | 0 | 0 | 0 | 0 | 0 | 0 | 0 |
| 0.312 | 0.312 | 0.174 | 0.073 | 0.02 | 0.003 | 0 | 0 | 0 | 0 | 0 | 0 | 0 |
| 0.3125 | 0.312 | 0.175 | 0.073 | 0.02 | 0.003 | 0 | 0 | 0 | 0 | 0 | 0 | 0 |
| 0.313 | 0.313 | 0.175 | 0.073 | 0.02 | 0.003 | 0 | 0 | 0 | 0 | 0 | 0 | 0 |
| 0.3135 | 0.314 | 0.176 | 0.074 | 0.02 | 0.003 | 0 | 0 | 0 | 0 | 0 | 0 | 0 |
| 0.314 | 0.314 | 0.176 | 0.074 | 0.02 | 0.003 | 0 | 0 | 0 | 0 | 0 | 0 | 0 |
| 0.3145 | 0.314 | 0.176 | 0.074 | 0.02 | 0.003 | 0 | 0 | 0 | 0 | 0 | 0 | 0 |
| 0.315 | 0.315 | 0.177 | 0.074 | 0.02 | 0.003 | 0 | 0 | 0 | 0 | 0 | 0 | 0 |
| 0.3155 | 0.316 | 0.177 | 0.075 | 0.02 | 0.003 | 0 | 0 | 0 | 0 | 0 | 0 | 0 |
| 0.316 | 0.316 | 0.178 | 0.075 | 0.02 | 0.003 | 0 | 0 | 0 | 0 | 0 | 0 | 0 |
| 0.3165 | 0.316 | 0.178 | 0.075 | 0.021 | 0.003 | 0 | 0 | 0 | 0 | 0 | 0 | 0 |
| 0.317 | 0.317 | 0.178 | 0.075 | 0.021 | 0.003 | 0 | 0 | 0 | 0 | 0 | 0 | 0 |
| 0.3175 | 0.318 | 0.179 | 0.076 | 0.021 | 0.003 | 0 | 0 | 0 | 0 | 0 | 0 | 0 |
| 0.318 | 0.318 | 0.179 | 0.076 | 0.021 | 0.003 | 0 | 0 | 0 | 0 | 0 | 0 | 0 |
| 0.3185 | 0.318 | 0.18 | 0.076 | 0.021 | 0.003 | 0 | 0 | 0 | 0 | 0 | 0 | 0 |
| 0.319 | 0.319 | 0.18 | 0.076 | 0.021 | 0.003 | 0 | 0 | 0 | 0 | 0 | 0 | 0 |
| 0.3195 | 0.32 | 0.181 | 0.077 | 0.021 | 0.003 | 0 | 0 | 0 | 0 | 0 | 0 | 0 |
| 0.32 | 0.32 | 0.181 | 0.077 | 0.021 | 0.003 | 0 | 0 | 0 | 0 | 0 | 0 | 0 |
| 0.3205 | 0.32 | 0.181 | 0.077 | 0.021 | 0.003 | 0 | 0 | 0 | 0 | 0 | 0 | 0 |
| 0.321 | 0.321 | 0.182 | 0.078 | 0.022 | 0.003 | 0 | 0 | 0 | 0 | 0 | 0 | 0 |
| 0.3215 | 0.322 | 0.182 | 0.078 | 0.022 | 0.003 | 0 | 0 | 0 | 0 | 0 | 0 | 0 |
| 0.322 | 0.322 | 0.183 | 0.078 | 0.022 | 0.003 | 0 | 0 | 0 | 0 | 0 | 0 | 0 |
| 0.3225 | 0.322 | 0.183 | 0.078 | 0.022 | 0.003 | 0 | 0 | 0 | 0 | 0 | 0 | 0 |
| 0.323 | 0.323 | 0.184 | 0.079 | 0.022 | 0.003 | 0 | 0 | 0 | 0 | 0 | 0 | 0 |
| 0.3235 | 0.324 | 0.184 | 0.079 | 0.022 | 0.003 | 0 | 0 | 0 | 0 | 0 | 0 | 0 |
| 0.324 | 0.324 | 0.184 | 0.079 | 0.022 | 0.003 | 0 | 0 | 0 | 0 | 0 | 0 | 0 |
| 0.3245 | 0.324 | 0.185 | 0.079 | 0.022 | 0.003 | 0 | 0 | 0 | 0 | 0 | 0 | 0 |
| 0.325 | 0.325 | 0.185 | 0.08 | 0.023 | 0.003 | 0 | 0 | 0 | 0 | 0 | 0 | 0 |
| 0.3255 | 0.326 | 0.186 | 0.08 | 0.023 | 0.003 | 0 | 0 | 0 | 0 | 0 | 0 | 0 |
| 0.326 | 0.326 | 0.186 | 0.08 | 0.023 | 0.003 | 0 | 0 | 0 | 0 | 0 | 0 | 0 |
| 0.3265 | 0.326 | 0.187 | 0.081 | 0.023 | 0.003 | 0 | 0 | 0 | 0 | 0 | 0 | 0 |
| 0.327 | 0.327 | 0.187 | 0.081 | 0.023 | 0.003 | 0 | 0 | 0 | 0 | 0 | 0 | 0 |
| 0.3275 | 0.328 | 0.187 | 0.081 | 0.023 | 0.004 | 0 | 0 | 0 | 0 | 0 | 0 | 0 |
| 0.328 | 0.328 | 0.188 | 0.081 | 0.023 | 0.004 | 0 | 0 | 0 | 0 | 0 | 0 | 0 |
| 0.3285 | 0.328 | 0.188 | 0.082 | 0.023 | 0.004 | 0 | 0 | 0 | 0 | 0 | 0 | 0 |
| 0.329 | 0.329 | 0.189 | 0.082 | 0.023 | 0.004 | 0 | 0 | 0 | 0 | 0 | 0 | 0 |
| 0.3295 | 0.33 | 0.189 | 0.082 | 0.024 | 0.004 | 0 | 0 | 0 | 0 | 0 | 0 | 0 |
| 0.33 | 0.33 | 0.19 | 0.083 | 0.024 | 0.004 | 0 | 0 | 0 | 0 | 0 | 0 | 0 |
| 0.3305 | 0.33 | 0.19 | 0.083 | 0.024 | 0.004 | 0 | 0 | 0 | 0 | 0 | 0 | 0 |
| 0.331 | 0.331 | 0.19 | 0.083 | 0.024 | 0.004 | 0 | 0 | 0 | 0 | 0 | 0 | 0 |
| 0.3315 | 0.332 | 0.191 | 0.083 | 0.024 | 0.004 | 0 | 0 | 0 | 0 | 0 | 0 | 0 |
| 0.332 | 0.332 | 0.191 | 0.084 | 0.024 | 0.004 | 0 | 0 | 0 | 0 | 0 | 0 | 0 |
| 0.3325 | 0.332 | 0.192 | 0.084 | 0.024 | 0.004 | 0 | 0 | 0 | 0 | 0 | 0 | 0 |
| 0.333 | 0.333 | 0.192 | 0.084 | 0.024 | 0.004 | 0 | 0 | 0 | 0 | 0 | 0 | 0 |
| 0.3335 | 0.334 | 0.193 | 0.085 | 0.025 | 0.004 | 0 | 0 | 0 | 0 | 0 | 0 | 0 |
| 0.334 | 0.334 | 0.193 | 0.085 | 0.025 | 0.004 | 0 | 0 | 0 | 0 | 0 | 0 | 0 |
| 0.3345 | 0.334 | 0.193 | 0.085 | 0.025 | 0.004 | 0 | 0 | 0 | 0 | 0 | 0 | 0 |
| 0.335 | 0.335 | 0.194 | 0.085 | 0.025 | 0.004 | 0 | 0 | 0 | 0 | 0 | 0 | 0 |
| 0.3355 | 0.336 | 0.194 | 0.086 | 0.025 | 0.004 | 0 | 0 | 0 | 0 | 0 | 0 | 0 |
| 0.336 | 0.336 | 0.195 | 0.086 | 0.025 | 0.004 | 0 | 0 | 0 | 0 | 0 | 0 | 0 |
| 0.3365 | 0.336 | 0.195 | 0.086 | 0.025 | 0.004 | 0 | 0 | 0 | 0 | 0 | 0 | 0 |
| 0.337 | 0.337 | 0.196 | 0.087 | 0.025 | 0.004 | 0 | 0 | 0 | 0 | 0 | 0 | 0 |
| 0.3375 | 0.338 | 0.196 | 0.087 | 0.026 | 0.004 | 0 | 0 | 0 | 0 | 0 | 0 | 0 |
| 0.338 | 0.338 | 0.197 | 0.087 | 0.026 | 0.004 | 0 | 0 | 0 | 0 | 0 | 0 | 0 |
| 0.3385 | 0.338 | 0.197 | 0.087 | 0.026 | 0.004 | 0 | 0 | 0 | 0 | 0 | 0 | 0 |
| 0.339 | 0.339 | 0.197 | 0.088 | 0.026 | 0.004 | 0 | 0 | 0 | 0 | 0 | 0 | 0 |
| 0.3395 | 0.34 | 0.198 | 0.088 | 0.026 | 0.004 | 0 | 0 | 0 | 0 | 0 | 0 | 0 |
| 0.34 | 0.34 | 0.198 | 0.088 | 0.026 | 0.004 | 0 | 0 | 0 | 0 | 0 | 0 | 0 |
| 0.3405 | 0.34 | 0.199 | 0.089 | 0.026 | 0.004 | 0 | 0 | 0 | 0 | 0 | 0 | 0 |
| 0.341 | 0.341 | 0.199 | 0.089 | 0.026 | 0.004 | 0 | 0 | 0 | 0 | 0 | 0 | 0 |
| 0.3415 | 0.342 | 0.2 | 0.089 | 0.027 | 0.004 | 0 | 0 | 0 | 0 | 0 | 0 | 0 |
| 0.342 | 0.342 | 0.2 | 0.089 | 0.027 | 0.004 | 0 | 0 | 0 | 0 | 0 | 0 | 0 |
| 0.3425 | 0.342 | 0.2 | 0.09 | 0.027 | 0.004 | 0 | 0 | 0 | 0 | 0 | 0 | 0 |
| 0.343 | 0.343 | 0.201 | 0.09 | 0.027 | 0.004 | 0 | 0 | 0 | 0 | 0 | 0 | 0 |
| 0.3435 | 0.344 | 0.201 | 0.09 | 0.027 | 0.004 | 0 | 0 | 0 | 0 | 0 | 0 | 0 |
| 0.344 | 0.344 | 0.202 | 0.091 | 0.027 | 0.005 | 0 | 0 | 0 | 0 | 0 | 0 | 0 |
| 0.3445 | 0.344 | 0.202 | 0.091 | 0.027 | 0.005 | 0 | 0 | 0 | 0 | 0 | 0 | 0 |
| 0.345 | 0.345 | 0.203 | 0.091 | 0.028 | 0.005 | 0 | 0 | 0 | 0 | 0 | 0 | 0 |
| 0.3455 | 0.346 | 0.203 | 0.092 | 0.028 | 0.005 | 0 | 0 | 0 | 0 | 0 | 0 | 0 |
| 0.346 | 0.346 | 0.204 | 0.092 | 0.028 | 0.005 | 0 | 0 | 0 | 0 | 0 | 0 | 0 |
| 0.3465 | 0.346 | 0.204 | 0.092 | 0.028 | 0.005 | 0 | 0 | 0 | 0 | 0 | 0 | 0 |
| 0.347 | 0.347 | 0.204 | 0.092 | 0.028 | 0.005 | 0 | 0 | 0 | 0 | 0 | 0 | 0 |
| 0.3475 | 0.348 | 0.205 | 0.093 | 0.028 | 0.005 | 0 | 0 | 0 | 0 | 0 | 0 | 0 |
| 0.348 | 0.348 | 0.205 | 0.093 | 0.028 | 0.005 | 0 | 0 | 0 | 0 | 0 | 0 | 0 |
| 0.3485 | 0.348 | 0.206 | 0.093 | 0.029 | 0.005 | 0 | 0 | 0 | 0 | 0 | 0 | 0 |
| 0.349 | 0.349 | 0.206 | 0.094 | 0.029 | 0.005 | 0 | 0 | 0 | 0 | 0 | 0 | 0 |
| 0.3495 | 0.35 | 0.207 | 0.094 | 0.029 | 0.005 | 0 | 0 | 0 | 0 | 0 | 0 | 0 |
| 0.35 | 0.35 | 0.207 | 0.094 | 0.029 | 0.005 | 0 | 0 | 0 | 0 | 0 | 0 | 0 |
| 0.3505 | 0.35 | 0.208 | 0.095 | 0.029 | 0.005 | 0 | 0 | 0 | 0 | 0 | 0 | 0 |
| 0.351 | 0.351 | 0.208 | 0.095 | 0.029 | 0.005 | 0 | 0 | 0 | 0 | 0 | 0 | 0 |
| 0.3515 | 0.352 | 0.208 | 0.095 | 0.029 | 0.005 | 0 | 0 | 0 | 0 | 0 | 0 | 0 |
| 0.352 | 0.352 | 0.209 | 0.095 | 0.029 | 0.005 | 0 | 0 | 0 | 0 | 0 | 0 | 0 |
| 0.3525 | 0.352 | 0.209 | 0.096 | 0.03 | 0.005 | 0 | 0 | 0 | 0 | 0 | 0 | 0 |
| 0.353 | 0.353 | 0.21 | 0.096 | 0.03 | 0.005 | 0 | 0 | 0 | 0 | 0 | 0 | 0 |
| 0.3535 | 0.354 | 0.21 | 0.096 | 0.03 | 0.005 | 0 | 0 | 0 | 0 | 0 | 0 | 0 |
| 0.354 | 0.354 | 0.211 | 0.097 | 0.03 | 0.005 | 0 | 0 | 0 | 0 | 0 | 0 | 0 |
| 0.3545 | 0.354 | 0.211 | 0.097 | 0.03 | 0.005 | 0 | 0 | 0 | 0 | 0 | 0 | 0 |
| 0.355 | 0.355 | 0.212 | 0.097 | 0.03 | 0.005 | 0 | 0 | 0 | 0 | 0 | 0 | 0 |
| 0.3555 | 0.356 | 0.212 | 0.098 | 0.03 | 0.005 | 0 | 0 | 0 | 0 | 0 | 0 | 0 |
| 0.356 | 0.356 | 0.212 | 0.098 | 0.031 | 0.005 | 0 | 0 | 0 | 0 | 0 | 0 | 0 |
| 0.3565 | 0.356 | 0.213 | 0.098 | 0.031 | 0.005 | 0 | 0 | 0 | 0 | 0 | 0 | 0 |
| 0.357 | 0.357 | 0.213 | 0.099 | 0.031 | 0.005 | 0 | 0 | 0 | 0 | 0 | 0 | 0 |
| 0.3575 | 0.358 | 0.214 | 0.099 | 0.031 | 0.005 | 0 | 0 | 0 | 0 | 0 | 0 | 0 |
| 0.358 | 0.358 | 0.214 | 0.099 | 0.031 | 0.006 | 0 | 0 | 0 | 0 | 0 | 0 | 0 |
| 0.3585 | 0.358 | 0.215 | 0.099 | 0.031 | 0.006 | 0 | 0 | 0 | 0 | 0 | 0 | 0 |
| 0.359 | 0.359 | 0.215 | 0.1 | 0.032 | 0.006 | 0 | 0 | 0 | 0 | 0 | 0 | 0 |
| 0.3595 | 0.36 | 0.216 | 0.1 | 0.032 | 0.006 | 0 | 0 | 0 | 0 | 0 | 0 | 0 |
| 0.36 | 0.36 | 0.216 | 0.1 | 0.032 | 0.006 | 0 | 0 | 0 | 0 | 0 | 0 | 0 |
| 0.3605 | 0.36 | 0.216 | 0.101 | 0.032 | 0.006 | 0 | 0 | 0 | 0 | 0 | 0 | 0 |
| 0.361 | 0.361 | 0.217 | 0.101 | 0.032 | 0.006 | 0 | 0 | 0 | 0 | 0 | 0 | 0 |
| 0.3615 | 0.362 | 0.217 | 0.101 | 0.032 | 0.006 | 0 | 0 | 0 | 0 | 0 | 0 | 0 |
| 0.362 | 0.362 | 0.218 | 0.102 | 0.032 | 0.006 | 0 | 0 | 0 | 0 | 0 | 0 | 0 |
| 0.3625 | 0.362 | 0.218 | 0.102 | 0.033 | 0.006 | 0 | 0 | 0 | 0 | 0 | 0 | 0 |
| 0.363 | 0.363 | 0.219 | 0.102 | 0.033 | 0.006 | 0 | 0 | 0 | 0 | 0 | 0 | 0 |
| 0.3635 | 0.364 | 0.219 | 0.103 | 0.033 | 0.006 | 0 | 0 | 0 | 0 | 0 | 0 | 0 |
| 0.364 | 0.364 | 0.22 | 0.103 | 0.033 | 0.006 | 0 | 0 | 0 | 0 | 0 | 0 | 0 |
| 0.3645 | 0.364 | 0.22 | 0.103 | 0.033 | 0.006 | 0 | 0 | 0 | 0 | 0 | 0 | 0 |
| 0.365 | 0.365 | 0.221 | 0.104 | 0.033 | 0.006 | 0 | 0 | 0 | 0 | 0 | 0 | 0 |
| 0.3655 | 0.366 | 0.221 | 0.104 | 0.033 | 0.006 | 0 | 0 | 0 | 0 | 0 | 0 | 0 |
| 0.366 | 0.366 | 0.221 | 0.104 | 0.034 | 0.006 | 0 | 0 | 0 | 0 | 0 | 0 | 0 |
| 0.3665 | 0.366 | 0.222 | 0.105 | 0.034 | 0.006 | 0 | 0 | 0 | 0 | 0 | 0 | 0 |
| 0.367 | 0.367 | 0.222 | 0.105 | 0.034 | 0.006 | 0 | 0 | 0 | 0 | 0 | 0 | 0 |
| 0.3675 | 0.368 | 0.223 | 0.105 | 0.034 | 0.006 | 0 | 0 | 0 | 0 | 0 | 0 | 0 |
| 0.368 | 0.368 | 0.223 | 0.105 | 0.034 | 0.006 | 0.001 | 0 | 0 | 0 | 0 | 0 | 0 |
| 0.3685 | 0.368 | 0.224 | 0.106 | 0.034 | 0.006 | 0.001 | 0 | 0 | 0 | 0 | 0 | 0 |
| 0.369 | 0.369 | 0.224 | 0.106 | 0.035 | 0.006 | 0.001 | 0 | 0 | 0 | 0 | 0 | 0 |
| 0.3695 | 0.37 | 0.225 | 0.106 | 0.035 | 0.006 | 0.001 | 0 | 0 | 0 | 0 | 0 | 0 |
| 0.37 | 0.37 | 0.225 | 0.107 | 0.035 | 0.007 | 0.001 | 0 | 0 | 0 | 0 | 0 | 0 |
| 0.3705 | 0.37 | 0.226 | 0.107 | 0.035 | 0.007 | 0.001 | 0 | 0 | 0 | 0 | 0 | 0 |
| 0.371 | 0.371 | 0.226 | 0.107 | 0.035 | 0.007 | 0.001 | 0 | 0 | 0 | 0 | 0 | 0 |
| 0.3715 | 0.372 | 0.226 | 0.108 | 0.035 | 0.007 | 0.001 | 0 | 0 | 0 | 0 | 0 | 0 |
| 0.372 | 0.372 | 0.227 | 0.108 | 0.036 | 0.007 | 0.001 | 0 | 0 | 0 | 0 | 0 | 0 |
| 0.3725 | 0.372 | 0.227 | 0.108 | 0.036 | 0.007 | 0.001 | 0 | 0 | 0 | 0 | 0 | 0 |
| 0.373 | 0.373 | 0.228 | 0.109 | 0.036 | 0.007 | 0.001 | 0 | 0 | 0 | 0 | 0 | 0 |
| 0.3735 | 0.374 | 0.228 | 0.109 | 0.036 | 0.007 | 0.001 | 0 | 0 | 0 | 0 | 0 | 0 |
| 0.374 | 0.374 | 0.229 | 0.109 | 0.036 | 0.007 | 0.001 | 0 | 0 | 0 | 0 | 0 | 0 |
| 0.3745 | 0.374 | 0.229 | 0.11 | 0.036 | 0.007 | 0.001 | 0 | 0 | 0 | 0 | 0 | 0 |
| 0.375 | 0.375 | 0.23 | 0.11 | 0.037 | 0.007 | 0.001 | 0 | 0 | 0 | 0 | 0 | 0 |
| 0.3755 | 0.376 | 0.23 | 0.11 | 0.037 | 0.007 | 0.001 | 0 | 0 | 0 | 0 | 0 | 0 |
| 0.376 | 0.376 | 0.231 | 0.111 | 0.037 | 0.007 | 0.001 | 0 | 0 | 0 | 0 | 0 | 0 |
| 0.3765 | 0.376 | 0.231 | 0.111 | 0.037 | 0.007 | 0.001 | 0 | 0 | 0 | 0 | 0 | 0 |
| 0.377 | 0.377 | 0.231 | 0.111 | 0.037 | 0.007 | 0.001 | 0 | 0 | 0 | 0 | 0 | 0 |
| 0.3775 | 0.378 | 0.232 | 0.112 | 0.037 | 0.007 | 0.001 | 0 | 0 | 0 | 0 | 0 | 0 |
| 0.378 | 0.378 | 0.232 | 0.112 | 0.038 | 0.007 | 0.001 | 0 | 0 | 0 | 0 | 0 | 0 |
| 0.3785 | 0.378 | 0.233 | 0.112 | 0.038 | 0.007 | 0.001 | 0 | 0 | 0 | 0 | 0 | 0 |
| 0.379 | 0.379 | 0.233 | 0.113 | 0.038 | 0.007 | 0.001 | 0 | 0 | 0 | 0 | 0 | 0 |
| 0.3795 | 0.38 | 0.234 | 0.113 | 0.038 | 0.007 | 0.001 | 0 | 0 | 0 | 0 | 0 | 0 |
| 0.38 | 0.38 | 0.234 | 0.113 | 0.038 | 0.007 | 0.001 | 0 | 0 | 0 | 0 | 0 | 0 |
| 0.3805 | 0.38 | 0.235 | 0.114 | 0.038 | 0.008 | 0.001 | 0 | 0 | 0 | 0 | 0 | 0 |
| 0.381 | 0.381 | 0.235 | 0.114 | 0.039 | 0.008 | 0.001 | 0 | 0 | 0 | 0 | 0 | 0 |
| 0.3815 | 0.382 | 0.236 | 0.114 | 0.039 | 0.008 | 0.001 | 0 | 0 | 0 | 0 | 0 | 0 |
| 0.382 | 0.382 | 0.236 | 0.115 | 0.039 | 0.008 | 0.001 | 0 | 0 | 0 | 0 | 0 | 0 |
| 0.3825 | 0.382 | 0.237 | 0.115 | 0.039 | 0.008 | 0.001 | 0 | 0 | 0 | 0 | 0 | 0 |
| 0.383 | 0.383 | 0.237 | 0.115 | 0.039 | 0.008 | 0.001 | 0 | 0 | 0 | 0 | 0 | 0 |
| 0.3835 | 0.384 | 0.237 | 0.116 | 0.039 | 0.008 | 0.001 | 0 | 0 | 0 | 0 | 0 | 0 |
| 0.384 | 0.384 | 0.238 | 0.116 | 0.04 | 0.008 | 0.001 | 0 | 0 | 0 | 0 | 0 | 0 |
| 0.3845 | 0.384 | 0.238 | 0.116 | 0.04 | 0.008 | 0.001 | 0 | 0 | 0 | 0 | 0 | 0 |
| 0.385 | 0.385 | 0.239 | 0.117 | 0.04 | 0.008 | 0.001 | 0 | 0 | 0 | 0 | 0 | 0 |
| 0.3855 | 0.386 | 0.239 | 0.117 | 0.04 | 0.008 | 0.001 | 0 | 0 | 0 | 0 | 0 | 0 |
| 0.386 | 0.386 | 0.24 | 0.117 | 0.04 | 0.008 | 0.001 | 0 | 0 | 0 | 0 | 0 | 0 |
| 0.3865 | 0.386 | 0.24 | 0.118 | 0.04 | 0.008 | 0.001 | 0 | 0 | 0 | 0 | 0 | 0 |
| 0.387 | 0.387 | 0.241 | 0.118 | 0.041 | 0.008 | 0.001 | 0 | 0 | 0 | 0 | 0 | 0 |
| 0.3875 | 0.388 | 0.241 | 0.118 | 0.041 | 0.008 | 0.001 | 0 | 0 | 0 | 0 | 0 | 0 |
| 0.388 | 0.388 | 0.242 | 0.119 | 0.041 | 0.008 | 0.001 | 0 | 0 | 0 | 0 | 0 | 0 |
| 0.3885 | 0.388 | 0.242 | 0.119 | 0.041 | 0.008 | 0.001 | 0 | 0 | 0 | 0 | 0 | 0 |
| 0.389 | 0.389 | 0.243 | 0.12 | 0.041 | 0.008 | 0.001 | 0 | 0 | 0 | 0 | 0 | 0 |
| 0.3895 | 0.39 | 0.243 | 0.12 | 0.041 | 0.008 | 0.001 | 0 | 0 | 0 | 0 | 0 | 0 |
| 0.39 | 0.39 | 0.244 | 0.12 | 0.042 | 0.009 | 0.001 | 0 | 0 | 0 | 0 | 0 | 0 |
| 0.3905 | 0.39 | 0.244 | 0.121 | 0.042 | 0.009 | 0.001 | 0 | 0 | 0 | 0 | 0 | 0 |
| 0.391 | 0.391 | 0.244 | 0.121 | 0.042 | 0.009 | 0.001 | 0 | 0 | 0 | 0 | 0 | 0 |
| 0.3915 | 0.392 | 0.245 | 0.121 | 0.042 | 0.009 | 0.001 | 0 | 0 | 0 | 0 | 0 | 0 |
| 0.392 | 0.392 | 0.245 | 0.122 | 0.042 | 0.009 | 0.001 | 0 | 0 | 0 | 0 | 0 | 0 |
| 0.3925 | 0.392 | 0.246 | 0.122 | 0.043 | 0.009 | 0.001 | 0 | 0 | 0 | 0 | 0 | 0 |
| 0.393 | 0.393 | 0.246 | 0.122 | 0.043 | 0.009 | 0.001 | 0 | 0 | 0 | 0 | 0 | 0 |
| 0.3935 | 0.394 | 0.247 | 0.123 | 0.043 | 0.009 | 0.001 | 0 | 0 | 0 | 0 | 0 | 0 |
| 0.394 | 0.394 | 0.247 | 0.123 | 0.043 | 0.009 | 0.001 | 0 | 0 | 0 | 0 | 0 | 0 |
| 0.3945 | 0.394 | 0.248 | 0.123 | 0.043 | 0.009 | 0.001 | 0 | 0 | 0 | 0 | 0 | 0 |
| 0.395 | 0.395 | 0.248 | 0.124 | 0.044 | 0.009 | 0.001 | 0 | 0 | 0 | 0 | 0 | 0 |
| 0.3955 | 0.396 | 0.249 | 0.124 | 0.044 | 0.009 | 0.001 | 0 | 0 | 0 | 0 | 0 | 0 |
| 0.396 | 0.396 | 0.249 | 0.124 | 0.044 | 0.009 | 0.001 | 0 | 0 | 0 | 0 | 0 | 0 |
| 0.3965 | 0.396 | 0.25 | 0.125 | 0.044 | 0.009 | 0.001 | 0 | 0 | 0 | 0 | 0 | 0 |
| 0.397 | 0.397 | 0.25 | 0.125 | 0.044 | 0.009 | 0.001 | 0 | 0 | 0 | 0 | 0 | 0 |
| 0.3975 | 0.398 | 0.251 | 0.125 | 0.044 | 0.009 | 0.001 | 0 | 0 | 0 | 0 | 0 | 0 |
| 0.398 | 0.398 | 0.251 | 0.126 | 0.045 | 0.009 | 0.001 | 0 | 0 | 0 | 0 | 0 | 0 |
| 0.3985 | 0.398 | 0.252 | 0.126 | 0.045 | 0.009 | 0.001 | 0 | 0 | 0 | 0 | 0 | 0 |
| 0.399 | 0.399 | 0.252 | 0.127 | 0.045 | 0.01 | 0.001 | 0 | 0 | 0 | 0 | 0 | 0 |
| 0.3995 | 0.4 | 0.253 | 0.127 | 0.045 | 0.01 | 0.001 | 0 | 0 | 0 | 0 | 0 | 0 |
| 0.4 | 0.4 | 0.253 | 0.127 | 0.045 | 0.01 | 0.001 | 0 | 0 | 0 | 0 | 0 | 0 |
| 0.4005 | 0.4 | 0.253 | 0.128 | 0.046 | 0.01 | 0.001 | 0 | 0 | 0 | 0 | 0 | 0 |
| 0.401 | 0.401 | 0.254 | 0.128 | 0.046 | 0.01 | 0.001 | 0 | 0 | 0 | 0 | 0 | 0 |
| 0.4015 | 0.402 | 0.254 | 0.128 | 0.046 | 0.01 | 0.001 | 0 | 0 | 0 | 0 | 0 | 0 |
| 0.402 | 0.402 | 0.255 | 0.129 | 0.046 | 0.01 | 0.001 | 0 | 0 | 0 | 0 | 0 | 0 |
| 0.4025 | 0.402 | 0.255 | 0.129 | 0.046 | 0.01 | 0.001 | 0 | 0 | 0 | 0 | 0 | 0 |
| 0.403 | 0.403 | 0.256 | 0.129 | 0.047 | 0.01 | 0.001 | 0 | 0 | 0 | 0 | 0 | 0 |
| 0.4035 | 0.404 | 0.256 | 0.13 | 0.047 | 0.01 | 0.001 | 0 | 0 | 0 | 0 | 0 | 0 |
| 0.404 | 0.404 | 0.257 | 0.13 | 0.047 | 0.01 | 0.001 | 0 | 0 | 0 | 0 | 0 | 0 |
| 0.4045 | 0.404 | 0.257 | 0.13 | 0.047 | 0.01 | 0.001 | 0 | 0 | 0 | 0 | 0 | 0 |
| 0.405 | 0.405 | 0.258 | 0.131 | 0.047 | 0.01 | 0.001 | 0 | 0 | 0 | 0 | 0 | 0 |
| 0.4055 | 0.406 | 0.258 | 0.131 | 0.048 | 0.01 | 0.001 | 0 | 0 | 0 | 0 | 0 | 0 |
| 0.406 | 0.406 | 0.259 | 0.132 | 0.048 | 0.01 | 0.001 | 0 | 0 | 0 | 0 | 0 | 0 |
| 0.4065 | 0.406 | 0.259 | 0.132 | 0.048 | 0.01 | 0.001 | 0 | 0 | 0 | 0 | 0 | 0 |
| 0.407 | 0.407 | 0.26 | 0.132 | 0.048 | 0.011 | 0.001 | 0 | 0 | 0 | 0 | 0 | 0 |
| 0.4075 | 0.408 | 0.26 | 0.133 | 0.048 | 0.011 | 0.001 | 0 | 0 | 0 | 0 | 0 | 0 |
| 0.408 | 0.408 | 0.261 | 0.133 | 0.049 | 0.011 | 0.001 | 0 | 0 | 0 | 0 | 0 | 0 |
| 0.4085 | 0.408 | 0.261 | 0.133 | 0.049 | 0.011 | 0.001 | 0 | 0 | 0 | 0 | 0 | 0 |
| 0.409 | 0.409 | 0.262 | 0.134 | 0.049 | 0.011 | 0.001 | 0 | 0 | 0 | 0 | 0 | 0 |
| 0.4095 | 0.41 | 0.262 | 0.134 | 0.049 | 0.011 | 0.001 | 0 | 0 | 0 | 0 | 0 | 0 |
| 0.41 | 0.41 | 0.263 | 0.135 | 0.049 | 0.011 | 0.001 | 0 | 0 | 0 | 0 | 0 | 0 |
| 0.4105 | 0.41 | 0.263 | 0.135 | 0.05 | 0.011 | 0.001 | 0 | 0 | 0 | 0 | 0 | 0 |
| 0.411 | 0.411 | 0.263 | 0.135 | 0.05 | 0.011 | 0.001 | 0 | 0 | 0 | 0 | 0 | 0 |
| 0.4115 | 0.412 | 0.264 | 0.136 | 0.05 | 0.011 | 0.001 | 0 | 0 | 0 | 0 | 0 | 0 |
| 0.412 | 0.412 | 0.264 | 0.136 | 0.05 | 0.011 | 0.001 | 0 | 0 | 0 | 0 | 0 | 0 |
| 0.4125 | 0.412 | 0.265 | 0.136 | 0.05 | 0.011 | 0.001 | 0 | 0 | 0 | 0 | 0 | 0 |
| 0.413 | 0.413 | 0.265 | 0.137 | 0.051 | 0.011 | 0.001 | 0 | 0 | 0 | 0 | 0 | 0 |
| 0.4135 | 0.414 | 0.266 | 0.137 | 0.051 | 0.011 | 0.001 | 0 | 0 | 0 | 0 | 0 | 0 |
| 0.414 | 0.414 | 0.266 | 0.137 | 0.051 | 0.012 | 0.001 | 0 | 0 | 0 | 0 | 0 | 0 |
| 0.4145 | 0.414 | 0.267 | 0.138 | 0.051 | 0.012 | 0.001 | 0 | 0 | 0 | 0 | 0 | 0 |
| 0.415 | 0.415 | 0.267 | 0.138 | 0.051 | 0.012 | 0.001 | 0 | 0 | 0 | 0 | 0 | 0 |
| 0.4155 | 0.416 | 0.268 | 0.139 | 0.052 | 0.012 | 0.001 | 0 | 0 | 0 | 0 | 0 | 0 |
| 0.416 | 0.416 | 0.268 | 0.139 | 0.052 | 0.012 | 0.001 | 0 | 0 | 0 | 0 | 0 | 0 |
| 0.4165 | 0.416 | 0.269 | 0.139 | 0.052 | 0.012 | 0.001 | 0 | 0 | 0 | 0 | 0 | 0 |
| 0.417 | 0.417 | 0.269 | 0.14 | 0.052 | 0.012 | 0.001 | 0 | 0 | 0 | 0 | 0 | 0 |
| 0.4175 | 0.418 | 0.27 | 0.14 | 0.052 | 0.012 | 0.001 | 0 | 0 | 0 | 0 | 0 | 0 |
| 0.418 | 0.418 | 0.27 | 0.14 | 0.053 | 0.012 | 0.001 | 0 | 0 | 0 | 0 | 0 | 0 |
| 0.4185 | 0.418 | 0.271 | 0.141 | 0.053 | 0.012 | 0.001 | 0 | 0 | 0 | 0 | 0 | 0 |
| 0.419 | 0.419 | 0.271 | 0.141 | 0.053 | 0.012 | 0.001 | 0 | 0 | 0 | 0 | 0 | 0 |
| 0.4195 | 0.42 | 0.272 | 0.142 | 0.053 | 0.012 | 0.001 | 0 | 0 | 0 | 0 | 0 | 0 |
| 0.42 | 0.42 | 0.272 | 0.142 | 0.054 | 0.012 | 0.001 | 0 | 0 | 0 | 0 | 0 | 0 |
| 0.4205 | 0.42 | 0.273 | 0.142 | 0.054 | 0.012 | 0.001 | 0 | 0 | 0 | 0 | 0 | 0 |
| 0.421 | 0.421 | 0.273 | 0.143 | 0.054 | 0.013 | 0.001 | 0 | 0 | 0 | 0 | 0 | 0 |
| 0.4215 | 0.422 | 0.274 | 0.143 | 0.054 | 0.013 | 0.001 | 0 | 0 | 0 | 0 | 0 | 0 |
| 0.422 | 0.422 | 0.274 | 0.144 | 0.054 | 0.013 | 0.001 | 0 | 0 | 0 | 0 | 0 | 0 |
| 0.4225 | 0.422 | 0.275 | 0.144 | 0.055 | 0.013 | 0.001 | 0 | 0 | 0 | 0 | 0 | 0 |
| 0.423 | 0.423 | 0.275 | 0.144 | 0.055 | 0.013 | 0.001 | 0 | 0 | 0 | 0 | 0 | 0 |
| 0.4235 | 0.424 | 0.276 | 0.145 | 0.055 | 0.013 | 0.001 | 0 | 0 | 0 | 0 | 0 | 0 |
| 0.424 | 0.424 | 0.276 | 0.145 | 0.055 | 0.013 | 0.001 | 0 | 0 | 0 | 0 | 0 | 0 |
| 0.4245 | 0.424 | 0.277 | 0.145 | 0.055 | 0.013 | 0.001 | 0 | 0 | 0 | 0 | 0 | 0 |
| 0.425 | 0.425 | 0.277 | 0.146 | 0.056 | 0.013 | 0.002 | 0 | 0 | 0 | 0 | 0 | 0 |
| 0.4255 | 0.426 | 0.278 | 0.146 | 0.056 | 0.013 | 0.002 | 0 | 0 | 0 | 0 | 0 | 0 |
| 0.426 | 0.426 | 0.278 | 0.147 | 0.056 | 0.013 | 0.002 | 0 | 0 | 0 | 0 | 0 | 0 |
| 0.4265 | 0.426 | 0.279 | 0.147 | 0.056 | 0.013 | 0.002 | 0 | 0 | 0 | 0 | 0 | 0 |
| 0.427 | 0.427 | 0.279 | 0.147 | 0.057 | 0.013 | 0.002 | 0 | 0 | 0 | 0 | 0 | 0 |
| 0.4275 | 0.428 | 0.28 | 0.148 | 0.057 | 0.014 | 0.002 | 0 | 0 | 0 | 0 | 0 | 0 |
| 0.428 | 0.428 | 0.28 | 0.148 | 0.057 | 0.014 | 0.002 | 0 | 0 | 0 | 0 | 0 | 0 |
| 0.4285 | 0.428 | 0.28 | 0.149 | 0.057 | 0.014 | 0.002 | 0 | 0 | 0 | 0 | 0 | 0 |
| 0.429 | 0.429 | 0.281 | 0.149 | 0.057 | 0.014 | 0.002 | 0 | 0 | 0 | 0 | 0 | 0 |
| 0.4295 | 0.43 | 0.281 | 0.149 | 0.058 | 0.014 | 0.002 | 0 | 0 | 0 | 0 | 0 | 0 |
| 0.43 | 0.43 | 0.282 | 0.15 | 0.058 | 0.014 | 0.002 | 0 | 0 | 0 | 0 | 0 | 0 |
| 0.4305 | 0.43 | 0.282 | 0.15 | 0.058 | 0.014 | 0.002 | 0 | 0 | 0 | 0 | 0 | 0 |
| 0.431 | 0.431 | 0.283 | 0.151 | 0.058 | 0.014 | 0.002 | 0 | 0 | 0 | 0 | 0 | 0 |
| 0.4315 | 0.432 | 0.283 | 0.151 | 0.059 | 0.014 | 0.002 | 0 | 0 | 0 | 0 | 0 | 0 |
| 0.432 | 0.432 | 0.284 | 0.151 | 0.059 | 0.014 | 0.002 | 0 | 0 | 0 | 0 | 0 | 0 |
| 0.4325 | 0.432 | 0.284 | 0.152 | 0.059 | 0.014 | 0.002 | 0 | 0 | 0 | 0 | 0 | 0 |
| 0.433 | 0.433 | 0.285 | 0.152 | 0.059 | 0.014 | 0.002 | 0 | 0 | 0 | 0 | 0 | 0 |
| 0.4335 | 0.434 | 0.285 | 0.152 | 0.06 | 0.015 | 0.002 | 0 | 0 | 0 | 0 | 0 | 0 |
| 0.434 | 0.434 | 0.286 | 0.153 | 0.06 | 0.015 | 0.002 | 0 | 0 | 0 | 0 | 0 | 0 |
| 0.4345 | 0.434 | 0.286 | 0.153 | 0.06 | 0.015 | 0.002 | 0 | 0 | 0 | 0 | 0 | 0 |
| 0.435 | 0.435 | 0.287 | 0.154 | 0.06 | 0.015 | 0.002 | 0 | 0 | 0 | 0 | 0 | 0 |
| 0.4355 | 0.436 | 0.287 | 0.154 | 0.06 | 0.015 | 0.002 | 0 | 0 | 0 | 0 | 0 | 0 |
| 0.436 | 0.436 | 0.288 | 0.154 | 0.061 | 0.015 | 0.002 | 0 | 0 | 0 | 0 | 0 | 0 |
| 0.4365 | 0.436 | 0.288 | 0.155 | 0.061 | 0.015 | 0.002 | 0 | 0 | 0 | 0 | 0 | 0 |
| 0.437 | 0.437 | 0.289 | 0.155 | 0.061 | 0.015 | 0.002 | 0 | 0 | 0 | 0 | 0 | 0 |
| 0.4375 | 0.438 | 0.289 | 0.156 | 0.061 | 0.015 | 0.002 | 0 | 0 | 0 | 0 | 0 | 0 |
| 0.438 | 0.438 | 0.29 | 0.156 | 0.062 | 0.015 | 0.002 | 0 | 0 | 0 | 0 | 0 | 0 |
| 0.4385 | 0.438 | 0.29 | 0.156 | 0.062 | 0.015 | 0.002 | 0 | 0 | 0 | 0 | 0 | 0 |
| 0.439 | 0.439 | 0.291 | 0.157 | 0.062 | 0.015 | 0.002 | 0 | 0 | 0 | 0 | 0 | 0 |
| 0.4395 | 0.44 | 0.291 | 0.157 | 0.062 | 0.016 | 0.002 | 0 | 0 | 0 | 0 | 0 | 0 |
| 0.44 | 0.44 | 0.292 | 0.158 | 0.063 | 0.016 | 0.002 | 0 | 0 | 0 | 0 | 0 | 0 |
| 0.4405 | 0.44 | 0.292 | 0.158 | 0.063 | 0.016 | 0.002 | 0 | 0 | 0 | 0 | 0 | 0 |
| 0.441 | 0.441 | 0.293 | 0.158 | 0.063 | 0.016 | 0.002 | 0 | 0 | 0 | 0 | 0 | 0 |
| 0.4415 | 0.442 | 0.293 | 0.159 | 0.063 | 0.016 | 0.002 | 0 | 0 | 0 | 0 | 0 | 0 |
| 0.442 | 0.442 | 0.294 | 0.159 | 0.064 | 0.016 | 0.002 | 0 | 0 | 0 | 0 | 0 | 0 |
| 0.4425 | 0.442 | 0.294 | 0.16 | 0.064 | 0.016 | 0.002 | 0 | 0 | 0 | 0 | 0 | 0 |
| 0.443 | 0.443 | 0.295 | 0.16 | 0.064 | 0.016 | 0.002 | 0 | 0 | 0 | 0 | 0 | 0 |
| 0.4435 | 0.444 | 0.295 | 0.161 | 0.064 | 0.016 | 0.002 | 0 | 0 | 0 | 0 | 0 | 0 |
| 0.444 | 0.444 | 0.296 | 0.161 | 0.065 | 0.016 | 0.002 | 0 | 0 | 0 | 0 | 0 | 0 |
| 0.4445 | 0.444 | 0.296 | 0.161 | 0.065 | 0.016 | 0.002 | 0 | 0 | 0 | 0 | 0 | 0 |
| 0.445 | 0.445 | 0.297 | 0.162 | 0.065 | 0.017 | 0.002 | 0 | 0 | 0 | 0 | 0 | 0 |
| 0.4455 | 0.446 | 0.297 | 0.162 | 0.065 | 0.017 | 0.002 | 0 | 0 | 0 | 0 | 0 | 0 |
| 0.446 | 0.446 | 0.298 | 0.163 | 0.066 | 0.017 | 0.002 | 0 | 0 | 0 | 0 | 0 | 0 |
| 0.4465 | 0.446 | 0.298 | 0.163 | 0.066 | 0.017 | 0.002 | 0 | 0 | 0 | 0 | 0 | 0 |
| 0.447 | 0.447 | 0.299 | 0.163 | 0.066 | 0.017 | 0.002 | 0 | 0 | 0 | 0 | 0 | 0 |
| 0.4475 | 0.448 | 0.299 | 0.164 | 0.066 | 0.017 | 0.002 | 0 | 0 | 0 | 0 | 0 | 0 |
| 0.448 | 0.448 | 0.3 | 0.164 | 0.067 | 0.017 | 0.002 | 0 | 0 | 0 | 0 | 0 | 0 |
| 0.4485 | 0.448 | 0.3 | 0.165 | 0.067 | 0.017 | 0.002 | 0 | 0 | 0 | 0 | 0 | 0 |
| 0.449 | 0.449 | 0.301 | 0.165 | 0.067 | 0.017 | 0.002 | 0 | 0 | 0 | 0 | 0 | 0 |
| 0.4495 | 0.45 | 0.301 | 0.165 | 0.067 | 0.017 | 0.002 | 0 | 0 | 0 | 0 | 0 | 0 |
| 0.45 | 0.45 | 0.302 | 0.166 | 0.068 | 0.018 | 0.002 | 0 | 0 | 0 | 0 | 0 | 0 |
| 0.4505 | 0.45 | 0.302 | 0.166 | 0.068 | 0.018 | 0.002 | 0 | 0 | 0 | 0 | 0 | 0 |
| 0.451 | 0.451 | 0.303 | 0.167 | 0.068 | 0.018 | 0.002 | 0 | 0 | 0 | 0 | 0 | 0 |
| 0.4515 | 0.452 | 0.303 | 0.167 | 0.068 | 0.018 | 0.002 | 0 | 0 | 0 | 0 | 0 | 0 |
| 0.452 | 0.452 | 0.304 | 0.168 | 0.069 | 0.018 | 0.002 | 0 | 0 | 0 | 0 | 0 | 0 |
| 0.4525 | 0.452 | 0.304 | 0.168 | 0.069 | 0.018 | 0.002 | 0 | 0 | 0 | 0 | 0 | 0 |
| 0.453 | 0.453 | 0.305 | 0.168 | 0.069 | 0.018 | 0.002 | 0 | 0 | 0 | 0 | 0 | 0 |
| 0.4535 | 0.454 | 0.305 | 0.169 | 0.069 | 0.018 | 0.002 | 0 | 0 | 0 | 0 | 0 | 0 |
| 0.454 | 0.454 | 0.306 | 0.169 | 0.07 | 0.018 | 0.002 | 0 | 0 | 0 | 0 | 0 | 0 |
| 0.4545 | 0.454 | 0.306 | 0.17 | 0.07 | 0.018 | 0.003 | 0 | 0 | 0 | 0 | 0 | 0 |
| 0.455 | 0.455 | 0.307 | 0.17 | 0.07 | 0.019 | 0.003 | 0 | 0 | 0 | 0 | 0 | 0 |
| 0.4555 | 0.456 | 0.307 | 0.17 | 0.07 | 0.019 | 0.003 | 0 | 0 | 0 | 0 | 0 | 0 |
| 0.456 | 0.456 | 0.308 | 0.171 | 0.071 | 0.019 | 0.003 | 0 | 0 | 0 | 0 | 0 | 0 |
| 0.4565 | 0.456 | 0.308 | 0.171 | 0.071 | 0.019 | 0.003 | 0 | 0 | 0 | 0 | 0 | 0 |
| 0.457 | 0.457 | 0.309 | 0.172 | 0.071 | 0.019 | 0.003 | 0 | 0 | 0 | 0 | 0 | 0 |
| 0.4575 | 0.458 | 0.309 | 0.172 | 0.071 | 0.019 | 0.003 | 0 | 0 | 0 | 0 | 0 | 0 |
| 0.458 | 0.458 | 0.31 | 0.173 | 0.072 | 0.019 | 0.003 | 0 | 0 | 0 | 0 | 0 | 0 |
| 0.4585 | 0.458 | 0.31 | 0.173 | 0.072 | 0.019 | 0.003 | 0 | 0 | 0 | 0 | 0 | 0 |
| 0.459 | 0.459 | 0.311 | 0.173 | 0.072 | 0.019 | 0.003 | 0 | 0 | 0 | 0 | 0 | 0 |
| 0.4595 | 0.46 | 0.311 | 0.174 | 0.072 | 0.02 | 0.003 | 0 | 0 | 0 | 0 | 0 | 0 |
| 0.46 | 0.46 | 0.312 | 0.174 | 0.073 | 0.02 | 0.003 | 0 | 0 | 0 | 0 | 0 | 0 |
| 0.4605 | 0.46 | 0.312 | 0.175 | 0.073 | 0.02 | 0.003 | 0 | 0 | 0 | 0 | 0 | 0 |
| 0.461 | 0.461 | 0.313 | 0.175 | 0.073 | 0.02 | 0.003 | 0 | 0 | 0 | 0 | 0 | 0 |
| 0.4615 | 0.462 | 0.314 | 0.176 | 0.074 | 0.02 | 0.003 | 0 | 0 | 0 | 0 | 0 | 0 |
| 0.462 | 0.462 | 0.314 | 0.176 | 0.074 | 0.02 | 0.003 | 0 | 0 | 0 | 0 | 0 | 0 |
| 0.4625 | 0.462 | 0.315 | 0.176 | 0.074 | 0.02 | 0.003 | 0 | 0 | 0 | 0 | 0 | 0 |
| 0.463 | 0.463 | 0.315 | 0.177 | 0.074 | 0.02 | 0.003 | 0 | 0 | 0 | 0 | 0 | 0 |
| 0.4635 | 0.464 | 0.316 | 0.177 | 0.075 | 0.02 | 0.003 | 0 | 0 | 0 | 0 | 0 | 0 |
| 0.464 | 0.464 | 0.316 | 0.178 | 0.075 | 0.02 | 0.003 | 0 | 0 | 0 | 0 | 0 | 0 |
| 0.4645 | 0.464 | 0.317 | 0.178 | 0.075 | 0.021 | 0.003 | 0 | 0 | 0 | 0 | 0 | 0 |
| 0.465 | 0.465 | 0.317 | 0.179 | 0.075 | 0.021 | 0.003 | 0 | 0 | 0 | 0 | 0 | 0 |
| 0.4655 | 0.466 | 0.318 | 0.179 | 0.076 | 0.021 | 0.003 | 0 | 0 | 0 | 0 | 0 | 0 |
| 0.466 | 0.466 | 0.318 | 0.179 | 0.076 | 0.021 | 0.003 | 0 | 0 | 0 | 0 | 0 | 0 |
| 0.4665 | 0.466 | 0.319 | 0.18 | 0.076 | 0.021 | 0.003 | 0 | 0 | 0 | 0 | 0 | 0 |
| 0.467 | 0.467 | 0.319 | 0.18 | 0.077 | 0.021 | 0.003 | 0 | 0 | 0 | 0 | 0 | 0 |
| 0.4675 | 0.468 | 0.32 | 0.181 | 0.077 | 0.021 | 0.003 | 0 | 0 | 0 | 0 | 0 | 0 |
| 0.468 | 0.468 | 0.32 | 0.181 | 0.077 | 0.021 | 0.003 | 0 | 0 | 0 | 0 | 0 | 0 |
| 0.4685 | 0.468 | 0.321 | 0.182 | 0.077 | 0.022 | 0.003 | 0 | 0 | 0 | 0 | 0 | 0 |
| 0.469 | 0.469 | 0.321 | 0.182 | 0.078 | 0.022 | 0.003 | 0 | 0 | 0 | 0 | 0 | 0 |
| 0.4695 | 0.47 | 0.322 | 0.182 | 0.078 | 0.022 | 0.003 | 0 | 0 | 0 | 0 | 0 | 0 |
| 0.47 | 0.47 | 0.322 | 0.183 | 0.078 | 0.022 | 0.003 | 0 | 0 | 0 | 0 | 0 | 0 |
| 0.4705 | 0.47 | 0.323 | 0.183 | 0.079 | 0.022 | 0.003 | 0 | 0 | 0 | 0 | 0 | 0 |
| 0.471 | 0.471 | 0.323 | 0.184 | 0.079 | 0.022 | 0.003 | 0 | 0 | 0 | 0 | 0 | 0 |
| 0.4715 | 0.472 | 0.324 | 0.184 | 0.079 | 0.022 | 0.003 | 0 | 0 | 0 | 0 | 0 | 0 |
| 0.472 | 0.472 | 0.324 | 0.185 | 0.079 | 0.022 | 0.003 | 0 | 0 | 0 | 0 | 0 | 0 |
| 0.4725 | 0.472 | 0.325 | 0.185 | 0.08 | 0.022 | 0.003 | 0 | 0 | 0 | 0 | 0 | 0 |
| 0.473 | 0.473 | 0.325 | 0.186 | 0.08 | 0.023 | 0.003 | 0 | 0 | 0 | 0 | 0 | 0 |
| 0.4735 | 0.474 | 0.326 | 0.186 | 0.08 | 0.023 | 0.003 | 0 | 0 | 0 | 0 | 0 | 0 |
| 0.474 | 0.474 | 0.326 | 0.186 | 0.08 | 0.023 | 0.003 | 0 | 0 | 0 | 0 | 0 | 0 |
| 0.4745 | 0.474 | 0.327 | 0.187 | 0.081 | 0.023 | 0.003 | 0 | 0 | 0 | 0 | 0 | 0 |
| 0.475 | 0.475 | 0.327 | 0.187 | 0.081 | 0.023 | 0.004 | 0 | 0 | 0 | 0 | 0 | 0 |
| 0.4755 | 0.476 | 0.328 | 0.188 | 0.081 | 0.023 | 0.004 | 0 | 0 | 0 | 0 | 0 | 0 |
| 0.476 | 0.476 | 0.328 | 0.188 | 0.082 | 0.023 | 0.004 | 0 | 0 | 0 | 0 | 0 | 0 |
| 0.4765 | 0.476 | 0.329 | 0.189 | 0.082 | 0.023 | 0.004 | 0 | 0 | 0 | 0 | 0 | 0 |
| 0.477 | 0.477 | 0.329 | 0.189 | 0.082 | 0.024 | 0.004 | 0 | 0 | 0 | 0 | 0 | 0 |
| 0.4775 | 0.478 | 0.33 | 0.19 | 0.083 | 0.024 | 0.004 | 0 | 0 | 0 | 0 | 0 | 0 |
| 0.478 | 0.478 | 0.33 | 0.19 | 0.083 | 0.024 | 0.004 | 0 | 0 | 0 | 0 | 0 | 0 |
| 0.4785 | 0.478 | 0.331 | 0.19 | 0.083 | 0.024 | 0.004 | 0 | 0 | 0 | 0 | 0 | 0 |
| 0.479 | 0.479 | 0.332 | 0.191 | 0.083 | 0.024 | 0.004 | 0 | 0 | 0 | 0 | 0 | 0 |
| 0.4795 | 0.48 | 0.332 | 0.191 | 0.084 | 0.024 | 0.004 | 0 | 0 | 0 | 0 | 0 | 0 |
| 0.48 | 0.48 | 0.333 | 0.192 | 0.084 | 0.024 | 0.004 | 0 | 0 | 0 | 0 | 0 | 0 |
| 0.4805 | 0.48 | 0.333 | 0.192 | 0.084 | 0.024 | 0.004 | 0 | 0 | 0 | 0 | 0 | 0 |
| 0.481 | 0.481 | 0.334 | 0.193 | 0.085 | 0.025 | 0.004 | 0 | 0 | 0 | 0 | 0 | 0 |
| 0.4815 | 0.482 | 0.334 | 0.193 | 0.085 | 0.025 | 0.004 | 0 | 0 | 0 | 0 | 0 | 0 |
| 0.482 | 0.482 | 0.335 | 0.194 | 0.085 | 0.025 | 0.004 | 0 | 0 | 0 | 0 | 0 | 0 |
| 0.4825 | 0.482 | 0.335 | 0.194 | 0.085 | 0.025 | 0.004 | 0 | 0 | 0 | 0 | 0 | 0 |
| 0.483 | 0.483 | 0.336 | 0.194 | 0.086 | 0.025 | 0.004 | 0 | 0 | 0 | 0 | 0 | 0 |
| 0.4835 | 0.484 | 0.336 | 0.195 | 0.086 | 0.025 | 0.004 | 0 | 0 | 0 | 0 | 0 | 0 |
| 0.484 | 0.484 | 0.337 | 0.195 | 0.086 | 0.025 | 0.004 | 0 | 0 | 0 | 0 | 0 | 0 |
| 0.4845 | 0.484 | 0.337 | 0.196 | 0.087 | 0.026 | 0.004 | 0 | 0 | 0 | 0 | 0 | 0 |
| 0.485 | 0.485 | 0.338 | 0.196 | 0.087 | 0.026 | 0.004 | 0 | 0 | 0 | 0 | 0 | 0 |
| 0.4855 | 0.486 | 0.338 | 0.197 | 0.087 | 0.026 | 0.004 | 0 | 0 | 0 | 0 | 0 | 0 |
| 0.486 | 0.486 | 0.339 | 0.197 | 0.088 | 0.026 | 0.004 | 0 | 0 | 0 | 0 | 0 | 0 |
| 0.4865 | 0.486 | 0.339 | 0.198 | 0.088 | 0.026 | 0.004 | 0 | 0 | 0 | 0 | 0 | 0 |
| 0.487 | 0.487 | 0.34 | 0.198 | 0.088 | 0.026 | 0.004 | 0 | 0 | 0 | 0 | 0 | 0 |
| 0.4875 | 0.488 | 0.34 | 0.199 | 0.088 | 0.026 | 0.004 | 0 | 0 | 0 | 0 | 0 | 0 |
| 0.488 | 0.488 | 0.341 | 0.199 | 0.089 | 0.026 | 0.004 | 0 | 0 | 0 | 0 | 0 | 0 |
| 0.4885 | 0.488 | 0.341 | 0.2 | 0.089 | 0.027 | 0.004 | 0 | 0 | 0 | 0 | 0 | 0 |
| 0.489 | 0.489 | 0.342 | 0.2 | 0.089 | 0.027 | 0.004 | 0 | 0 | 0 | 0 | 0 | 0 |
| 0.4895 | 0.49 | 0.342 | 0.2 | 0.09 | 0.027 | 0.004 | 0 | 0 | 0 | 0 | 0 | 0 |
| 0.49 | 0.49 | 0.343 | 0.201 | 0.09 | 0.027 | 0.004 | 0 | 0 | 0 | 0 | 0 | 0 |
| 0.4905 | 0.49 | 0.344 | 0.201 | 0.09 | 0.027 | 0.004 | 0 | 0 | 0 | 0 | 0 | 0 |
| 0.491 | 0.491 | 0.344 | 0.202 | 0.091 | 0.027 | 0.005 | 0 | 0 | 0 | 0 | 0 | 0 |
| 0.4915 | 0.492 | 0.345 | 0.202 | 0.091 | 0.027 | 0.005 | 0 | 0 | 0 | 0 | 0 | 0 |
| 0.492 | 0.492 | 0.345 | 0.203 | 0.091 | 0.028 | 0.005 | 0 | 0 | 0 | 0 | 0 | 0 |
| 0.4925 | 0.492 | 0.346 | 0.203 | 0.092 | 0.028 | 0.005 | 0 | 0 | 0 | 0 | 0 | 0 |
| 0.493 | 0.493 | 0.346 | 0.204 | 0.092 | 0.028 | 0.005 | 0 | 0 | 0 | 0 | 0 | 0 |
| 0.4935 | 0.494 | 0.347 | 0.204 | 0.092 | 0.028 | 0.005 | 0 | 0 | 0 | 0 | 0 | 0 |
| 0.494 | 0.494 | 0.347 | 0.205 | 0.093 | 0.028 | 0.005 | 0 | 0 | 0 | 0 | 0 | 0 |
| 0.4945 | 0.494 | 0.348 | 0.205 | 0.093 | 0.028 | 0.005 | 0 | 0 | 0 | 0 | 0 | 0 |
| 0.495 | 0.495 | 0.348 | 0.206 | 0.093 | 0.028 | 0.005 | 0 | 0 | 0 | 0 | 0 | 0 |
| 0.4955 | 0.496 | 0.349 | 0.206 | 0.093 | 0.029 | 0.005 | 0 | 0 | 0 | 0 | 0 | 0 |
| 0.496 | 0.496 | 0.349 | 0.206 | 0.094 | 0.029 | 0.005 | 0 | 0 | 0 | 0 | 0 | 0 |
| 0.4965 | 0.496 | 0.35 | 0.207 | 0.094 | 0.029 | 0.005 | 0 | 0 | 0 | 0 | 0 | 0 |
| 0.497 | 0.497 | 0.35 | 0.207 | 0.094 | 0.029 | 0.005 | 0 | 0 | 0 | 0 | 0 | 0 |
| 0.4975 | 0.498 | 0.351 | 0.208 | 0.095 | 0.029 | 0.005 | 0 | 0 | 0 | 0 | 0 | 0 |
| 0.498 | 0.498 | 0.351 | 0.208 | 0.095 | 0.029 | 0.005 | 0 | 0 | 0 | 0 | 0 | 0 |
| 0.4985 | 0.498 | 0.352 | 0.209 | 0.095 | 0.029 | 0.005 | 0 | 0 | 0 | 0 | 0 | 0 |
| 0.499 | 0.499 | 0.352 | 0.209 | 0.096 | 0.03 | 0.005 | 0 | 0 | 0 | 0 | 0 | 0 |
| 0.4995 | 0.5 | 0.353 | 0.21 | 0.096 | 0.03 | 0.005 | 0 | 0 | 0 | 0 | 0 | 0 |
| 0.5 | 0.5 | 0.354 | 0.21 | 0.096 | 0.03 | 0.005 | 0 | 0 | 0 | 0 | 0 | 0 |
| 0.5005 | 0.5 | 0.354 | 0.211 | 0.097 | 0.03 | 0.005 | 0 | 0 | 0 | 0 | 0 | 0 |
| 0.501 | 0.501 | 0.355 | 0.211 | 0.097 | 0.03 | 0.005 | 0 | 0 | 0 | 0 | 0 | 0 |
| 0.5015 | 0.501 | 0.355 | 0.212 | 0.097 | 0.03 | 0.005 | 0 | 0 | 0 | 0 | 0 | 0 |
| 0.502 | 0.502 | 0.356 | 0.212 | 0.098 | 0.031 | 0.005 | 0 | 0 | 0 | 0 | 0 | 0 |
| 0.5025 | 0.502 | 0.356 | 0.213 | 0.098 | 0.031 | 0.005 | 0 | 0 | 0 | 0 | 0 | 0 |
| 0.503 | 0.503 | 0.357 | 0.213 | 0.098 | 0.031 | 0.005 | 0 | 0 | 0 | 0 | 0 | 0 |
| 0.5035 | 0.503 | 0.357 | 0.214 | 0.099 | 0.031 | 0.005 | 0 | 0 | 0 | 0 | 0 | 0 |
| 0.504 | 0.504 | 0.358 | 0.214 | 0.099 | 0.031 | 0.005 | 0 | 0 | 0 | 0 | 0 | 0 |
| 0.5045 | 0.504 | 0.358 | 0.215 | 0.099 | 0.031 | 0.006 | 0 | 0 | 0 | 0 | 0 | 0 |
| 0.505 | 0.505 | 0.359 | 0.215 | 0.1 | 0.031 | 0.006 | 0 | 0 | 0 | 0 | 0 | 0 |
| 0.5055 | 0.505 | 0.359 | 0.215 | 0.1 | 0.032 | 0.006 | 0 | 0 | 0 | 0 | 0 | 0 |
| 0.506 | 0.506 | 0.36 | 0.216 | 0.1 | 0.032 | 0.006 | 0 | 0 | 0 | 0 | 0 | 0 |
| 0.5065 | 0.506 | 0.36 | 0.216 | 0.101 | 0.032 | 0.006 | 0 | 0 | 0 | 0 | 0 | 0 |
| 0.507 | 0.507 | 0.361 | 0.217 | 0.101 | 0.032 | 0.006 | 0 | 0 | 0 | 0 | 0 | 0 |
| 0.5075 | 0.507 | 0.362 | 0.217 | 0.101 | 0.032 | 0.006 | 0 | 0 | 0 | 0 | 0 | 0 |
| 0.507999999999999 | 0.508 | 0.362 | 0.218 | 0.102 | 0.032 | 0.006 | 0 | 0 | 0 | 0 | 0 | 0 |
| 0.508499999999999 | 0.508 | 0.363 | 0.218 | 0.102 | 0.033 | 0.006 | 0 | 0 | 0 | 0 | 0 | 0 |
| 0.508999999999999 | 0.509 | 0.363 | 0.219 | 0.102 | 0.033 | 0.006 | 0 | 0 | 0 | 0 | 0 | 0 |
| 0.509499999999999 | 0.509 | 0.364 | 0.219 | 0.103 | 0.033 | 0.006 | 0 | 0 | 0 | 0 | 0 | 0 |
| 0.509999999999999 | 0.51 | 0.364 | 0.22 | 0.103 | 0.033 | 0.006 | 0 | 0 | 0 | 0 | 0 | 0 |
| 0.510499999999999 | 0.51 | 0.365 | 0.22 | 0.103 | 0.033 | 0.006 | 0 | 0 | 0 | 0 | 0 | 0 |
| 0.510999999999999 | 0.511 | 0.365 | 0.221 | 0.104 | 0.033 | 0.006 | 0 | 0 | 0 | 0 | 0 | 0 |
| 0.511499999999999 | 0.511 | 0.366 | 0.221 | 0.104 | 0.034 | 0.006 | 0 | 0 | 0 | 0 | 0 | 0 |
| 0.511999999999999 | 0.512 | 0.366 | 0.222 | 0.104 | 0.034 | 0.006 | 0 | 0 | 0 | 0 | 0 | 0 |
| 0.512499999999999 | 0.512 | 0.367 | 0.222 | 0.105 | 0.034 | 0.006 | 0 | 0 | 0 | 0 | 0 | 0 |
| 0.512999999999999 | 0.513 | 0.367 | 0.223 | 0.105 | 0.034 | 0.006 | 0 | 0 | 0 | 0 | 0 | 0 |
| 0.513499999999999 | 0.513 | 0.368 | 0.223 | 0.105 | 0.034 | 0.006 | 0.001 | 0 | 0 | 0 | 0 | 0 |
| 0.513999999999999 | 0.514 | 0.369 | 0.224 | 0.106 | 0.034 | 0.006 | 0.001 | 0 | 0 | 0 | 0 | 0 |
| 0.514499999999999 | 0.514 | 0.369 | 0.224 | 0.106 | 0.035 | 0.006 | 0.001 | 0 | 0 | 0 | 0 | 0 |
| 0.514999999999999 | 0.515 | 0.37 | 0.225 | 0.106 | 0.035 | 0.006 | 0.001 | 0 | 0 | 0 | 0 | 0 |
| 0.515499999999999 | 0.515 | 0.37 | 0.225 | 0.107 | 0.035 | 0.007 | 0.001 | 0 | 0 | 0 | 0 | 0 |
| 0.515999999999999 | 0.516 | 0.371 | 0.226 | 0.107 | 0.035 | 0.007 | 0.001 | 0 | 0 | 0 | 0 | 0 |
| 0.516499999999999 | 0.516 | 0.371 | 0.226 | 0.108 | 0.035 | 0.007 | 0.001 | 0 | 0 | 0 | 0 | 0 |
| 0.516999999999998 | 0.517 | 0.372 | 0.227 | 0.108 | 0.035 | 0.007 | 0.001 | 0 | 0 | 0 | 0 | 0 |
| 0.517499999999998 | 0.517 | 0.372 | 0.227 | 0.108 | 0.036 | 0.007 | 0.001 | 0 | 0 | 0 | 0 | 0 |
| 0.517999999999998 | 0.518 | 0.373 | 0.228 | 0.109 | 0.036 | 0.007 | 0.001 | 0 | 0 | 0 | 0 | 0 |
| 0.518499999999998 | 0.518 | 0.373 | 0.228 | 0.109 | 0.036 | 0.007 | 0.001 | 0 | 0 | 0 | 0 | 0 |
| 0.518999999999998 | 0.519 | 0.374 | 0.229 | 0.109 | 0.036 | 0.007 | 0.001 | 0 | 0 | 0 | 0 | 0 |
| 0.519499999999998 | 0.519 | 0.374 | 0.229 | 0.11 | 0.036 | 0.007 | 0.001 | 0 | 0 | 0 | 0 | 0 |
| 0.519999999999998 | 0.52 | 0.375 | 0.23 | 0.11 | 0.036 | 0.007 | 0.001 | 0 | 0 | 0 | 0 | 0 |
| 0.520499999999998 | 0.52 | 0.376 | 0.23 | 0.11 | 0.037 | 0.007 | 0.001 | 0 | 0 | 0 | 0 | 0 |
| 0.520999999999998 | 0.521 | 0.376 | 0.231 | 0.111 | 0.037 | 0.007 | 0.001 | 0 | 0 | 0 | 0 | 0 |
| 0.521499999999998 | 0.521 | 0.377 | 0.231 | 0.111 | 0.037 | 0.007 | 0.001 | 0 | 0 | 0 | 0 | 0 |
| 0.521999999999998 | 0.522 | 0.377 | 0.232 | 0.111 | 0.037 | 0.007 | 0.001 | 0 | 0 | 0 | 0 | 0 |
| 0.522499999999998 | 0.522 | 0.378 | 0.232 | 0.112 | 0.037 | 0.007 | 0.001 | 0 | 0 | 0 | 0 | 0 |
| 0.522999999999998 | 0.523 | 0.378 | 0.233 | 0.112 | 0.038 | 0.007 | 0.001 | 0 | 0 | 0 | 0 | 0 |
| 0.523499999999998 | 0.523 | 0.379 | 0.233 | 0.113 | 0.038 | 0.007 | 0.001 | 0 | 0 | 0 | 0 | 0 |
| 0.523999999999998 | 0.524 | 0.379 | 0.234 | 0.113 | 0.038 | 0.007 | 0.001 | 0 | 0 | 0 | 0 | 0 |
| 0.524499999999998 | 0.524 | 0.38 | 0.234 | 0.113 | 0.038 | 0.007 | 0.001 | 0 | 0 | 0 | 0 | 0 |
| 0.524999999999998 | 0.525 | 0.38 | 0.235 | 0.114 | 0.038 | 0.007 | 0.001 | 0 | 0 | 0 | 0 | 0 |
| 0.525499999999998 | 0.525 | 0.381 | 0.235 | 0.114 | 0.038 | 0.008 | 0.001 | 0 | 0 | 0 | 0 | 0 |
| 0.525999999999997 | 0.526 | 0.381 | 0.236 | 0.114 | 0.039 | 0.008 | 0.001 | 0 | 0 | 0 | 0 | 0 |
| 0.526499999999997 | 0.526 | 0.382 | 0.236 | 0.115 | 0.039 | 0.008 | 0.001 | 0 | 0 | 0 | 0 | 0 |
| 0.526999999999997 | 0.527 | 0.383 | 0.237 | 0.115 | 0.039 | 0.008 | 0.001 | 0 | 0 | 0 | 0 | 0 |
| 0.527499999999997 | 0.527 | 0.383 | 0.237 | 0.115 | 0.039 | 0.008 | 0.001 | 0 | 0 | 0 | 0 | 0 |
| 0.527999999999997 | 0.528 | 0.384 | 0.238 | 0.116 | 0.039 | 0.008 | 0.001 | 0 | 0 | 0 | 0 | 0 |
| 0.528499999999997 | 0.528 | 0.384 | 0.238 | 0.116 | 0.04 | 0.008 | 0.001 | 0 | 0 | 0 | 0 | 0 |
| 0.528999999999997 | 0.529 | 0.385 | 0.239 | 0.117 | 0.04 | 0.008 | 0.001 | 0 | 0 | 0 | 0 | 0 |
| 0.529499999999997 | 0.529 | 0.385 | 0.239 | 0.117 | 0.04 | 0.008 | 0.001 | 0 | 0 | 0 | 0 | 0 |
| 0.529999999999997 | 0.53 | 0.386 | 0.24 | 0.117 | 0.04 | 0.008 | 0.001 | 0 | 0 | 0 | 0 | 0 |
| 0.530499999999997 | 0.53 | 0.386 | 0.24 | 0.118 | 0.04 | 0.008 | 0.001 | 0 | 0 | 0 | 0 | 0 |
| 0.530999999999997 | 0.531 | 0.387 | 0.241 | 0.118 | 0.041 | 0.008 | 0.001 | 0 | 0 | 0 | 0 | 0 |
| 0.531499999999997 | 0.531 | 0.387 | 0.241 | 0.118 | 0.041 | 0.008 | 0.001 | 0 | 0 | 0 | 0 | 0 |
| 0.531999999999997 | 0.532 | 0.388 | 0.242 | 0.119 | 0.041 | 0.008 | 0.001 | 0 | 0 | 0 | 0 | 0 |
| 0.532499999999997 | 0.532 | 0.389 | 0.242 | 0.119 | 0.041 | 0.008 | 0.001 | 0 | 0 | 0 | 0 | 0 |
| 0.532999999999997 | 0.533 | 0.389 | 0.243 | 0.12 | 0.041 | 0.008 | 0.001 | 0 | 0 | 0 | 0 | 0 |
| 0.533499999999997 | 0.533 | 0.39 | 0.243 | 0.12 | 0.042 | 0.008 | 0.001 | 0 | 0 | 0 | 0 | 0 |
| 0.533999999999997 | 0.534 | 0.39 | 0.244 | 0.12 | 0.042 | 0.009 | 0.001 | 0 | 0 | 0 | 0 | 0 |
| 0.534499999999997 | 0.534 | 0.391 | 0.244 | 0.121 | 0.042 | 0.009 | 0.001 | 0 | 0 | 0 | 0 | 0 |
| 0.534999999999996 | 0.535 | 0.391 | 0.245 | 0.121 | 0.042 | 0.009 | 0.001 | 0 | 0 | 0 | 0 | 0 |
| 0.535499999999996 | 0.535 | 0.392 | 0.245 | 0.121 | 0.042 | 0.009 | 0.001 | 0 | 0 | 0 | 0 | 0 |
| 0.535999999999996 | 0.536 | 0.392 | 0.246 | 0.122 | 0.043 | 0.009 | 0.001 | 0 | 0 | 0 | 0 | 0 |
| 0.536499999999996 | 0.536 | 0.393 | 0.246 | 0.122 | 0.043 | 0.009 | 0.001 | 0 | 0 | 0 | 0 | 0 |
| 0.536999999999996 | 0.537 | 0.394 | 0.247 | 0.123 | 0.043 | 0.009 | 0.001 | 0 | 0 | 0 | 0 | 0 |
| 0.537499999999996 | 0.537 | 0.394 | 0.247 | 0.123 | 0.043 | 0.009 | 0.001 | 0 | 0 | 0 | 0 | 0 |
| 0.537999999999996 | 0.538 | 0.395 | 0.248 | 0.123 | 0.043 | 0.009 | 0.001 | 0 | 0 | 0 | 0 | 0 |
| 0.538499999999996 | 0.538 | 0.395 | 0.248 | 0.124 | 0.044 | 0.009 | 0.001 | 0 | 0 | 0 | 0 | 0 |
| 0.538999999999996 | 0.539 | 0.396 | 0.249 | 0.124 | 0.044 | 0.009 | 0.001 | 0 | 0 | 0 | 0 | 0 |
| 0.539499999999996 | 0.539 | 0.396 | 0.249 | 0.125 | 0.044 | 0.009 | 0.001 | 0 | 0 | 0 | 0 | 0 |
| 0.539999999999996 | 0.54 | 0.397 | 0.25 | 0.125 | 0.044 | 0.009 | 0.001 | 0 | 0 | 0 | 0 | 0 |
| 0.540499999999996 | 0.54 | 0.397 | 0.25 | 0.125 | 0.044 | 0.009 | 0.001 | 0 | 0 | 0 | 0 | 0 |
| 0.540999999999996 | 0.541 | 0.398 | 0.251 | 0.126 | 0.045 | 0.009 | 0.001 | 0 | 0 | 0 | 0 | 0 |
| 0.541499999999996 | 0.541 | 0.398 | 0.252 | 0.126 | 0.045 | 0.009 | 0.001 | 0 | 0 | 0 | 0 | 0 |
| 0.541999999999996 | 0.542 | 0.399 | 0.252 | 0.127 | 0.045 | 0.01 | 0.001 | 0 | 0 | 0 | 0 | 0 |
| 0.542499999999996 | 0.542 | 0.4 | 0.253 | 0.127 | 0.045 | 0.01 | 0.001 | 0 | 0 | 0 | 0 | 0 |
| 0.542999999999996 | 0.543 | 0.4 | 0.253 | 0.127 | 0.045 | 0.01 | 0.001 | 0 | 0 | 0 | 0 | 0 |
| 0.543499999999996 | 0.543 | 0.401 | 0.254 | 0.128 | 0.046 | 0.01 | 0.001 | 0 | 0 | 0 | 0 | 0 |
| 0.543999999999995 | 0.544 | 0.401 | 0.254 | 0.128 | 0.046 | 0.01 | 0.001 | 0 | 0 | 0 | 0 | 0 |
| 0.544499999999995 | 0.544 | 0.402 | 0.255 | 0.129 | 0.046 | 0.01 | 0.001 | 0 | 0 | 0 | 0 | 0 |
| 0.544999999999995 | 0.545 | 0.402 | 0.255 | 0.129 | 0.046 | 0.01 | 0.001 | 0 | 0 | 0 | 0 | 0 |
| 0.545499999999995 | 0.545 | 0.403 | 0.256 | 0.129 | 0.047 | 0.01 | 0.001 | 0 | 0 | 0 | 0 | 0 |
| 0.545999999999995 | 0.546 | 0.403 | 0.256 | 0.13 | 0.047 | 0.01 | 0.001 | 0 | 0 | 0 | 0 | 0 |
| 0.546499999999995 | 0.546 | 0.404 | 0.257 | 0.13 | 0.047 | 0.01 | 0.001 | 0 | 0 | 0 | 0 | 0 |
| 0.546999999999995 | 0.547 | 0.405 | 0.257 | 0.131 | 0.047 | 0.01 | 0.001 | 0 | 0 | 0 | 0 | 0 |
| 0.547499999999995 | 0.547 | 0.405 | 0.258 | 0.131 | 0.047 | 0.01 | 0.001 | 0 | 0 | 0 | 0 | 0 |
| 0.547999999999995 | 0.548 | 0.406 | 0.258 | 0.131 | 0.048 | 0.01 | 0.001 | 0 | 0 | 0 | 0 | 0 |
| 0.548499999999995 | 0.548 | 0.406 | 0.259 | 0.132 | 0.048 | 0.01 | 0.001 | 0 | 0 | 0 | 0 | 0 |
| 0.548999999999995 | 0.549 | 0.407 | 0.259 | 0.132 | 0.048 | 0.011 | 0.001 | 0 | 0 | 0 | 0 | 0 |
| 0.549499999999995 | 0.549 | 0.407 | 0.26 | 0.133 | 0.048 | 0.011 | 0.001 | 0 | 0 | 0 | 0 | 0 |
| 0.549999999999995 | 0.55 | 0.408 | 0.261 | 0.133 | 0.048 | 0.011 | 0.001 | 0 | 0 | 0 | 0 | 0 |
| 0.550499999999995 | 0.55 | 0.408 | 0.261 | 0.133 | 0.049 | 0.011 | 0.001 | 0 | 0 | 0 | 0 | 0 |
| 0.550999999999995 | 0.551 | 0.409 | 0.262 | 0.134 | 0.049 | 0.011 | 0.001 | 0 | 0 | 0 | 0 | 0 |
| 0.551499999999995 | 0.551 | 0.41 | 0.262 | 0.134 | 0.049 | 0.011 | 0.001 | 0 | 0 | 0 | 0 | 0 |
| 0.551999999999995 | 0.552 | 0.41 | 0.263 | 0.135 | 0.049 | 0.011 | 0.001 | 0 | 0 | 0 | 0 | 0 |
| 0.552499999999995 | 0.552 | 0.411 | 0.263 | 0.135 | 0.05 | 0.011 | 0.001 | 0 | 0 | 0 | 0 | 0 |
| 0.552999999999994 | 0.553 | 0.411 | 0.264 | 0.135 | 0.05 | 0.011 | 0.001 | 0 | 0 | 0 | 0 | 0 |
| 0.553499999999994 | 0.553 | 0.412 | 0.264 | 0.136 | 0.05 | 0.011 | 0.001 | 0 | 0 | 0 | 0 | 0 |
| 0.553999999999994 | 0.554 | 0.412 | 0.265 | 0.136 | 0.05 | 0.011 | 0.001 | 0 | 0 | 0 | 0 | 0 |
| 0.554499999999994 | 0.554 | 0.413 | 0.265 | 0.137 | 0.051 | 0.011 | 0.001 | 0 | 0 | 0 | 0 | 0 |
| 0.554999999999994 | 0.555 | 0.413 | 0.266 | 0.137 | 0.051 | 0.011 | 0.001 | 0 | 0 | 0 | 0 | 0 |
| 0.555499999999994 | 0.555 | 0.414 | 0.266 | 0.138 | 0.051 | 0.012 | 0.001 | 0 | 0 | 0 | 0 | 0 |
| 0.555999999999994 | 0.556 | 0.415 | 0.267 | 0.138 | 0.051 | 0.012 | 0.001 | 0 | 0 | 0 | 0 | 0 |
| 0.556499999999994 | 0.556 | 0.415 | 0.267 | 0.138 | 0.051 | 0.012 | 0.001 | 0 | 0 | 0 | 0 | 0 |
| 0.556999999999994 | 0.557 | 0.416 | 0.268 | 0.139 | 0.052 | 0.012 | 0.001 | 0 | 0 | 0 | 0 | 0 |
| 0.557499999999994 | 0.557 | 0.416 | 0.269 | 0.139 | 0.052 | 0.012 | 0.001 | 0 | 0 | 0 | 0 | 0 |
| 0.557999999999994 | 0.558 | 0.417 | 0.269 | 0.14 | 0.052 | 0.012 | 0.001 | 0 | 0 | 0 | 0 | 0 |
| 0.558499999999994 | 0.558 | 0.417 | 0.27 | 0.14 | 0.052 | 0.012 | 0.001 | 0 | 0 | 0 | 0 | 0 |
| 0.558999999999994 | 0.559 | 0.418 | 0.27 | 0.14 | 0.053 | 0.012 | 0.001 | 0 | 0 | 0 | 0 | 0 |
| 0.559499999999994 | 0.559 | 0.419 | 0.271 | 0.141 | 0.053 | 0.012 | 0.001 | 0 | 0 | 0 | 0 | 0 |
| 0.559999999999994 | 0.56 | 0.419 | 0.271 | 0.141 | 0.053 | 0.012 | 0.001 | 0 | 0 | 0 | 0 | 0 |
| 0.560499999999994 | 0.56 | 0.42 | 0.272 | 0.142 | 0.053 | 0.012 | 0.001 | 0 | 0 | 0 | 0 | 0 |
| 0.560999999999994 | 0.561 | 0.42 | 0.272 | 0.142 | 0.054 | 0.012 | 0.001 | 0 | 0 | 0 | 0 | 0 |
| 0.561499999999994 | 0.561 | 0.421 | 0.273 | 0.143 | 0.054 | 0.012 | 0.001 | 0 | 0 | 0 | 0 | 0 |
| 0.561999999999993 | 0.562 | 0.421 | 0.273 | 0.143 | 0.054 | 0.013 | 0.001 | 0 | 0 | 0 | 0 | 0 |
| 0.562499999999993 | 0.562 | 0.422 | 0.274 | 0.143 | 0.054 | 0.013 | 0.001 | 0 | 0 | 0 | 0 | 0 |
| 0.562999999999993 | 0.563 | 0.422 | 0.275 | 0.144 | 0.055 | 0.013 | 0.001 | 0 | 0 | 0 | 0 | 0 |
| 0.563499999999993 | 0.563 | 0.423 | 0.275 | 0.144 | 0.055 | 0.013 | 0.001 | 0 | 0 | 0 | 0 | 0 |
| 0.563999999999993 | 0.564 | 0.424 | 0.276 | 0.145 | 0.055 | 0.013 | 0.001 | 0 | 0 | 0 | 0 | 0 |
| 0.564499999999993 | 0.564 | 0.424 | 0.276 | 0.145 | 0.055 | 0.013 | 0.001 | 0 | 0 | 0 | 0 | 0 |
| 0.564999999999993 | 0.565 | 0.425 | 0.277 | 0.146 | 0.056 | 0.013 | 0.001 | 0 | 0 | 0 | 0 | 0 |
| 0.565499999999993 | 0.565 | 0.425 | 0.277 | 0.146 | 0.056 | 0.013 | 0.002 | 0 | 0 | 0 | 0 | 0 |
| 0.565999999999993 | 0.566 | 0.426 | 0.278 | 0.146 | 0.056 | 0.013 | 0.002 | 0 | 0 | 0 | 0 | 0 |
| 0.566499999999993 | 0.566 | 0.426 | 0.278 | 0.147 | 0.056 | 0.013 | 0.002 | 0 | 0 | 0 | 0 | 0 |
| 0.566999999999993 | 0.567 | 0.427 | 0.279 | 0.147 | 0.057 | 0.013 | 0.002 | 0 | 0 | 0 | 0 | 0 |
| 0.567499999999993 | 0.567 | 0.428 | 0.28 | 0.148 | 0.057 | 0.014 | 0.002 | 0 | 0 | 0 | 0 | 0 |
| 0.567999999999993 | 0.568 | 0.428 | 0.28 | 0.148 | 0.057 | 0.014 | 0.002 | 0 | 0 | 0 | 0 | 0 |
| 0.568499999999993 | 0.568 | 0.429 | 0.281 | 0.149 | 0.057 | 0.014 | 0.002 | 0 | 0 | 0 | 0 | 0 |
| 0.568999999999993 | 0.569 | 0.429 | 0.281 | 0.149 | 0.058 | 0.014 | 0.002 | 0 | 0 | 0 | 0 | 0 |
| 0.569499999999993 | 0.569 | 0.43 | 0.282 | 0.15 | 0.058 | 0.014 | 0.002 | 0 | 0 | 0 | 0 | 0 |
| 0.569999999999993 | 0.57 | 0.43 | 0.282 | 0.15 | 0.058 | 0.014 | 0.002 | 0 | 0 | 0 | 0 | 0 |
| 0.570499999999993 | 0.57 | 0.431 | 0.283 | 0.15 | 0.058 | 0.014 | 0.002 | 0 | 0 | 0 | 0 | 0 |
| 0.570999999999993 | 0.571 | 0.431 | 0.283 | 0.151 | 0.059 | 0.014 | 0.002 | 0 | 0 | 0 | 0 | 0 |
| 0.571499999999992 | 0.571 | 0.432 | 0.284 | 0.151 | 0.059 | 0.014 | 0.002 | 0 | 0 | 0 | 0 | 0 |
| 0.571999999999992 | 0.572 | 0.433 | 0.285 | 0.152 | 0.059 | 0.014 | 0.002 | 0 | 0 | 0 | 0 | 0 |
| 0.572499999999992 | 0.572 | 0.433 | 0.285 | 0.152 | 0.059 | 0.014 | 0.002 | 0 | 0 | 0 | 0 | 0 |
| 0.572999999999992 | 0.573 | 0.434 | 0.286 | 0.153 | 0.06 | 0.015 | 0.002 | 0 | 0 | 0 | 0 | 0 |
| 0.573499999999992 | 0.573 | 0.434 | 0.286 | 0.153 | 0.06 | 0.015 | 0.002 | 0 | 0 | 0 | 0 | 0 |
| 0.573999999999992 | 0.574 | 0.435 | 0.287 | 0.154 | 0.06 | 0.015 | 0.002 | 0 | 0 | 0 | 0 | 0 |
| 0.574499999999992 | 0.574 | 0.435 | 0.287 | 0.154 | 0.06 | 0.015 | 0.002 | 0 | 0 | 0 | 0 | 0 |
| 0.574999999999992 | 0.575 | 0.436 | 0.288 | 0.154 | 0.061 | 0.015 | 0.002 | 0 | 0 | 0 | 0 | 0 |
| 0.575499999999992 | 0.575 | 0.437 | 0.288 | 0.155 | 0.061 | 0.015 | 0.002 | 0 | 0 | 0 | 0 | 0 |
| 0.575999999999992 | 0.576 | 0.437 | 0.289 | 0.155 | 0.061 | 0.015 | 0.002 | 0 | 0 | 0 | 0 | 0 |
| 0.576499999999992 | 0.576 | 0.438 | 0.29 | 0.156 | 0.062 | 0.015 | 0.002 | 0 | 0 | 0 | 0 | 0 |
| 0.576999999999992 | 0.577 | 0.438 | 0.29 | 0.156 | 0.062 | 0.015 | 0.002 | 0 | 0 | 0 | 0 | 0 |
| 0.577499999999992 | 0.577 | 0.439 | 0.291 | 0.157 | 0.062 | 0.015 | 0.002 | 0 | 0 | 0 | 0 | 0 |
| 0.577999999999992 | 0.578 | 0.439 | 0.291 | 0.157 | 0.062 | 0.016 | 0.002 | 0 | 0 | 0 | 0 | 0 |
| 0.578499999999992 | 0.578 | 0.44 | 0.292 | 0.158 | 0.063 | 0.016 | 0.002 | 0 | 0 | 0 | 0 | 0 |
| 0.578999999999992 | 0.579 | 0.441 | 0.292 | 0.158 | 0.063 | 0.016 | 0.002 | 0 | 0 | 0 | 0 | 0 |
| 0.579499999999992 | 0.579 | 0.441 | 0.293 | 0.159 | 0.063 | 0.016 | 0.002 | 0 | 0 | 0 | 0 | 0 |
| 0.579999999999992 | 0.58 | 0.442 | 0.294 | 0.159 | 0.063 | 0.016 | 0.002 | 0 | 0 | 0 | 0 | 0 |
| 0.580499999999991 | 0.58 | 0.442 | 0.294 | 0.16 | 0.064 | 0.016 | 0.002 | 0 | 0 | 0 | 0 | 0 |
| 0.580999999999991 | 0.581 | 0.443 | 0.295 | 0.16 | 0.064 | 0.016 | 0.002 | 0 | 0 | 0 | 0 | 0 |
| 0.581499999999991 | 0.581 | 0.443 | 0.295 | 0.16 | 0.064 | 0.016 | 0.002 | 0 | 0 | 0 | 0 | 0 |
| 0.581999999999991 | 0.582 | 0.444 | 0.296 | 0.161 | 0.065 | 0.016 | 0.002 | 0 | 0 | 0 | 0 | 0 |
| 0.582499999999991 | 0.582 | 0.445 | 0.296 | 0.161 | 0.065 | 0.017 | 0.002 | 0 | 0 | 0 | 0 | 0 |
| 0.582999999999991 | 0.583 | 0.445 | 0.297 | 0.162 | 0.065 | 0.017 | 0.002 | 0 | 0 | 0 | 0 | 0 |
| 0.583499999999991 | 0.583 | 0.446 | 0.298 | 0.162 | 0.065 | 0.017 | 0.002 | 0 | 0 | 0 | 0 | 0 |
| 0.583999999999991 | 0.584 | 0.446 | 0.298 | 0.163 | 0.066 | 0.017 | 0.002 | 0 | 0 | 0 | 0 | 0 |
| 0.584499999999991 | 0.584 | 0.447 | 0.299 | 0.163 | 0.066 | 0.017 | 0.002 | 0 | 0 | 0 | 0 | 0 |
| 0.584999999999991 | 0.585 | 0.447 | 0.299 | 0.164 | 0.066 | 0.017 | 0.002 | 0 | 0 | 0 | 0 | 0 |
| 0.585499999999991 | 0.585 | 0.448 | 0.3 | 0.164 | 0.067 | 0.017 | 0.002 | 0 | 0 | 0 | 0 | 0 |
| 0.585999999999991 | 0.586 | 0.449 | 0.3 | 0.165 | 0.067 | 0.017 | 0.002 | 0 | 0 | 0 | 0 | 0 |
| 0.586499999999991 | 0.586 | 0.449 | 0.301 | 0.165 | 0.067 | 0.017 | 0.002 | 0 | 0 | 0 | 0 | 0 |
| 0.586999999999991 | 0.587 | 0.45 | 0.302 | 0.166 | 0.067 | 0.018 | 0.002 | 0 | 0 | 0 | 0 | 0 |
| 0.587499999999991 | 0.587 | 0.45 | 0.302 | 0.166 | 0.068 | 0.018 | 0.002 | 0 | 0 | 0 | 0 | 0 |
| 0.587999999999991 | 0.588 | 0.451 | 0.303 | 0.167 | 0.068 | 0.018 | 0.002 | 0 | 0 | 0 | 0 | 0 |
| 0.588499999999991 | 0.588 | 0.451 | 0.303 | 0.167 | 0.068 | 0.018 | 0.002 | 0 | 0 | 0 | 0 | 0 |
| 0.588999999999991 | 0.589 | 0.452 | 0.304 | 0.168 | 0.069 | 0.018 | 0.002 | 0 | 0 | 0 | 0 | 0 |
| 0.58949999999999 | 0.589 | 0.453 | 0.305 | 0.168 | 0.069 | 0.018 | 0.002 | 0 | 0 | 0 | 0 | 0 |
| 0.58999999999999 | 0.59 | 0.453 | 0.305 | 0.169 | 0.069 | 0.018 | 0.002 | 0 | 0 | 0 | 0 | 0 |
| 0.59049999999999 | 0.59 | 0.454 | 0.306 | 0.169 | 0.069 | 0.018 | 0.002 | 0 | 0 | 0 | 0 | 0 |
| 0.59099999999999 | 0.591 | 0.454 | 0.306 | 0.169 | 0.07 | 0.018 | 0.003 | 0 | 0 | 0 | 0 | 0 |
| 0.59149999999999 | 0.591 | 0.455 | 0.307 | 0.17 | 0.07 | 0.019 | 0.003 | 0 | 0 | 0 | 0 | 0 |
| 0.59199999999999 | 0.592 | 0.455 | 0.307 | 0.17 | 0.07 | 0.019 | 0.003 | 0 | 0 | 0 | 0 | 0 |
| 0.59249999999999 | 0.592 | 0.456 | 0.308 | 0.171 | 0.071 | 0.019 | 0.003 | 0 | 0 | 0 | 0 | 0 |
| 0.59299999999999 | 0.593 | 0.457 | 0.309 | 0.171 | 0.071 | 0.019 | 0.003 | 0 | 0 | 0 | 0 | 0 |
| 0.59349999999999 | 0.593 | 0.457 | 0.309 | 0.172 | 0.071 | 0.019 | 0.003 | 0 | 0 | 0 | 0 | 0 |
| 0.59399999999999 | 0.594 | 0.458 | 0.31 | 0.172 | 0.072 | 0.019 | 0.003 | 0 | 0 | 0 | 0 | 0 |
| 0.59449999999999 | 0.594 | 0.458 | 0.31 | 0.173 | 0.072 | 0.019 | 0.003 | 0 | 0 | 0 | 0 | 0 |
| 0.59499999999999 | 0.595 | 0.459 | 0.311 | 0.173 | 0.072 | 0.019 | 0.003 | 0 | 0 | 0 | 0 | 0 |
| 0.59549999999999 | 0.595 | 0.46 | 0.312 | 0.174 | 0.073 | 0.02 | 0.003 | 0 | 0 | 0 | 0 | 0 |
| 0.59599999999999 | 0.596 | 0.46 | 0.312 | 0.174 | 0.073 | 0.02 | 0.003 | 0 | 0 | 0 | 0 | 0 |
| 0.59649999999999 | 0.596 | 0.461 | 0.313 | 0.175 | 0.073 | 0.02 | 0.003 | 0 | 0 | 0 | 0 | 0 |
| 0.59699999999999 | 0.597 | 0.461 | 0.313 | 0.175 | 0.073 | 0.02 | 0.003 | 0 | 0 | 0 | 0 | 0 |
| 0.59749999999999 | 0.597 | 0.462 | 0.314 | 0.176 | 0.074 | 0.02 | 0.003 | 0 | 0 | 0 | 0 | 0 |
| 0.59799999999999 | 0.598 | 0.462 | 0.314 | 0.176 | 0.074 | 0.02 | 0.003 | 0 | 0 | 0 | 0 | 0 |
| 0.598499999999989 | 0.598 | 0.463 | 0.315 | 0.177 | 0.074 | 0.02 | 0.003 | 0 | 0 | 0 | 0 | 0 |
| 0.598999999999989 | 0.599 | 0.464 | 0.316 | 0.177 | 0.075 | 0.02 | 0.003 | 0 | 0 | 0 | 0 | 0 |
| 0.599499999999989 | 0.599 | 0.464 | 0.316 | 0.178 | 0.075 | 0.021 | 0.003 | 0 | 0 | 0 | 0 | 0 |
| 0.599999999999989 | 0.6 | 0.465 | 0.317 | 0.178 | 0.075 | 0.021 | 0.003 | 0 | 0 | 0 | 0 | 0 |
| 0.600499999999989 | 0.6 | 0.465 | 0.317 | 0.179 | 0.076 | 0.021 | 0.003 | 0 | 0 | 0 | 0 | 0 |
| 0.600999999999989 | 0.601 | 0.466 | 0.318 | 0.179 | 0.076 | 0.021 | 0.003 | 0 | 0 | 0 | 0 | 0 |
| 0.601499999999989 | 0.601 | 0.467 | 0.319 | 0.18 | 0.076 | 0.021 | 0.003 | 0 | 0 | 0 | 0 | 0 |
| 0.601999999999989 | 0.602 | 0.467 | 0.319 | 0.18 | 0.077 | 0.021 | 0.003 | 0 | 0 | 0 | 0 | 0 |
| 0.602499999999989 | 0.602 | 0.468 | 0.32 | 0.181 | 0.077 | 0.021 | 0.003 | 0 | 0 | 0 | 0 | 0 |
| 0.602999999999989 | 0.603 | 0.468 | 0.32 | 0.181 | 0.077 | 0.021 | 0.003 | 0 | 0 | 0 | 0 | 0 |
| 0.603499999999989 | 0.603 | 0.469 | 0.321 | 0.182 | 0.078 | 0.022 | 0.003 | 0 | 0 | 0 | 0 | 0 |
| 0.603999999999989 | 0.604 | 0.469 | 0.322 | 0.182 | 0.078 | 0.022 | 0.003 | 0 | 0 | 0 | 0 | 0 |
| 0.604499999999989 | 0.604 | 0.47 | 0.322 | 0.183 | 0.078 | 0.022 | 0.003 | 0 | 0 | 0 | 0 | 0 |
| 0.604999999999989 | 0.605 | 0.471 | 0.323 | 0.183 | 0.079 | 0.022 | 0.003 | 0 | 0 | 0 | 0 | 0 |
| 0.605499999999989 | 0.605 | 0.471 | 0.323 | 0.184 | 0.079 | 0.022 | 0.003 | 0 | 0 | 0 | 0 | 0 |
| 0.605999999999989 | 0.606 | 0.472 | 0.324 | 0.184 | 0.079 | 0.022 | 0.003 | 0 | 0 | 0 | 0 | 0 |
| 0.606499999999989 | 0.606 | 0.472 | 0.325 | 0.185 | 0.08 | 0.022 | 0.003 | 0 | 0 | 0 | 0 | 0 |
| 0.606999999999988 | 0.607 | 0.473 | 0.325 | 0.185 | 0.08 | 0.023 | 0.003 | 0 | 0 | 0 | 0 | 0 |
| 0.607499999999988 | 0.607 | 0.473 | 0.326 | 0.186 | 0.08 | 0.023 | 0.003 | 0 | 0 | 0 | 0 | 0 |
| 0.607999999999988 | 0.608 | 0.474 | 0.326 | 0.186 | 0.081 | 0.023 | 0.003 | 0 | 0 | 0 | 0 | 0 |
| 0.608499999999988 | 0.608 | 0.475 | 0.327 | 0.187 | 0.081 | 0.023 | 0.003 | 0 | 0 | 0 | 0 | 0 |
| 0.608999999999988 | 0.609 | 0.475 | 0.328 | 0.188 | 0.081 | 0.023 | 0.004 | 0 | 0 | 0 | 0 | 0 |
| 0.609499999999988 | 0.609 | 0.476 | 0.328 | 0.188 | 0.082 | 0.023 | 0.004 | 0 | 0 | 0 | 0 | 0 |
| 0.609999999999988 | 0.61 | 0.476 | 0.329 | 0.189 | 0.082 | 0.023 | 0.004 | 0 | 0 | 0 | 0 | 0 |
| 0.610499999999988 | 0.61 | 0.477 | 0.329 | 0.189 | 0.082 | 0.024 | 0.004 | 0 | 0 | 0 | 0 | 0 |
| 0.610999999999988 | 0.611 | 0.478 | 0.33 | 0.19 | 0.083 | 0.024 | 0.004 | 0 | 0 | 0 | 0 | 0 |
| 0.611499999999988 | 0.611 | 0.478 | 0.331 | 0.19 | 0.083 | 0.024 | 0.004 | 0 | 0 | 0 | 0 | 0 |
| 0.611999999999988 | 0.612 | 0.479 | 0.331 | 0.191 | 0.083 | 0.024 | 0.004 | 0 | 0 | 0 | 0 | 0 |
| 0.612499999999988 | 0.612 | 0.479 | 0.332 | 0.191 | 0.084 | 0.024 | 0.004 | 0 | 0 | 0 | 0 | 0 |
| 0.612999999999988 | 0.613 | 0.48 | 0.332 | 0.192 | 0.084 | 0.024 | 0.004 | 0 | 0 | 0 | 0 | 0 |
| 0.613499999999988 | 0.613 | 0.481 | 0.333 | 0.192 | 0.084 | 0.024 | 0.004 | 0 | 0 | 0 | 0 | 0 |
| 0.613999999999988 | 0.614 | 0.481 | 0.334 | 0.193 | 0.085 | 0.025 | 0.004 | 0 | 0 | 0 | 0 | 0 |
| 0.614499999999988 | 0.614 | 0.482 | 0.334 | 0.193 | 0.085 | 0.025 | 0.004 | 0 | 0 | 0 | 0 | 0 |
| 0.614999999999988 | 0.615 | 0.482 | 0.335 | 0.194 | 0.085 | 0.025 | 0.004 | 0 | 0 | 0 | 0 | 0 |
| 0.615499999999988 | 0.615 | 0.483 | 0.336 | 0.194 | 0.086 | 0.025 | 0.004 | 0 | 0 | 0 | 0 | 0 |
| 0.615999999999987 | 0.616 | 0.483 | 0.336 | 0.195 | 0.086 | 0.025 | 0.004 | 0 | 0 | 0 | 0 | 0 |
| 0.616499999999987 | 0.616 | 0.484 | 0.337 | 0.195 | 0.086 | 0.025 | 0.004 | 0 | 0 | 0 | 0 | 0 |
| 0.616999999999987 | 0.617 | 0.485 | 0.337 | 0.196 | 0.087 | 0.026 | 0.004 | 0 | 0 | 0 | 0 | 0 |
| 0.617499999999987 | 0.617 | 0.485 | 0.338 | 0.197 | 0.087 | 0.026 | 0.004 | 0 | 0 | 0 | 0 | 0 |
| 0.617999999999987 | 0.618 | 0.486 | 0.339 | 0.197 | 0.087 | 0.026 | 0.004 | 0 | 0 | 0 | 0 | 0 |
| 0.618499999999987 | 0.618 | 0.486 | 0.339 | 0.198 | 0.088 | 0.026 | 0.004 | 0 | 0 | 0 | 0 | 0 |
| 0.618999999999987 | 0.619 | 0.487 | 0.34 | 0.198 | 0.088 | 0.026 | 0.004 | 0 | 0 | 0 | 0 | 0 |
| 0.619499999999987 | 0.619 | 0.488 | 0.34 | 0.199 | 0.089 | 0.026 | 0.004 | 0 | 0 | 0 | 0 | 0 |
| 0.619999999999987 | 0.62 | 0.488 | 0.341 | 0.199 | 0.089 | 0.027 | 0.004 | 0 | 0 | 0 | 0 | 0 |
| 0.620499999999987 | 0.62 | 0.489 | 0.342 | 0.2 | 0.089 | 0.027 | 0.004 | 0 | 0 | 0 | 0 | 0 |
| 0.620999999999987 | 0.621 | 0.489 | 0.342 | 0.2 | 0.09 | 0.027 | 0.004 | 0 | 0 | 0 | 0 | 0 |
| 0.621499999999987 | 0.621 | 0.49 | 0.343 | 0.201 | 0.09 | 0.027 | 0.004 | 0 | 0 | 0 | 0 | 0 |
| 0.621999999999987 | 0.622 | 0.491 | 0.344 | 0.201 | 0.09 | 0.027 | 0.004 | 0 | 0 | 0 | 0 | 0 |
| 0.622499999999987 | 0.622 | 0.491 | 0.344 | 0.202 | 0.091 | 0.027 | 0.005 | 0 | 0 | 0 | 0 | 0 |
| 0.622999999999987 | 0.623 | 0.492 | 0.345 | 0.202 | 0.091 | 0.028 | 0.005 | 0 | 0 | 0 | 0 | 0 |
| 0.623499999999987 | 0.623 | 0.492 | 0.345 | 0.203 | 0.091 | 0.028 | 0.005 | 0 | 0 | 0 | 0 | 0 |
| 0.623999999999987 | 0.624 | 0.493 | 0.346 | 0.204 | 0.092 | 0.028 | 0.005 | 0 | 0 | 0 | 0 | 0 |
| 0.624499999999987 | 0.624 | 0.494 | 0.347 | 0.204 | 0.092 | 0.028 | 0.005 | 0 | 0 | 0 | 0 | 0 |
| 0.624999999999986 | 0.625 | 0.494 | 0.347 | 0.205 | 0.093 | 0.028 | 0.005 | 0 | 0 | 0 | 0 | 0 |
| 0.625499999999986 | 0.625 | 0.495 | 0.348 | 0.205 | 0.093 | 0.028 | 0.005 | 0 | 0 | 0 | 0 | 0 |
| 0.625999999999986 | 0.626 | 0.495 | 0.349 | 0.206 | 0.093 | 0.029 | 0.005 | 0 | 0 | 0 | 0 | 0 |
| 0.626499999999986 | 0.626 | 0.496 | 0.349 | 0.206 | 0.094 | 0.029 | 0.005 | 0 | 0 | 0 | 0 | 0 |
| 0.626999999999986 | 0.627 | 0.496 | 0.35 | 0.207 | 0.094 | 0.029 | 0.005 | 0 | 0 | 0 | 0 | 0 |
| 0.627499999999986 | 0.627 | 0.497 | 0.35 | 0.207 | 0.094 | 0.029 | 0.005 | 0 | 0 | 0 | 0 | 0 |
| 0.627999999999986 | 0.628 | 0.498 | 0.351 | 0.208 | 0.095 | 0.029 | 0.005 | 0 | 0 | 0 | 0 | 0 |
| 0.628499999999986 | 0.628 | 0.498 | 0.352 | 0.209 | 0.095 | 0.029 | 0.005 | 0 | 0 | 0 | 0 | 0 |
| 0.628999999999986 | 0.629 | 0.499 | 0.352 | 0.209 | 0.096 | 0.03 | 0.005 | 0 | 0 | 0 | 0 | 0 |
| 0.629499999999986 | 0.629 | 0.499 | 0.353 | 0.21 | 0.096 | 0.03 | 0.005 | 0 | 0 | 0 | 0 | 0 |
| 0.629999999999986 | 0.63 | 0.5 | 0.354 | 0.21 | 0.096 | 0.03 | 0.005 | 0 | 0 | 0 | 0 | 0 |
| 0.630499999999986 | 0.63 | 0.501 | 0.354 | 0.211 | 0.097 | 0.03 | 0.005 | 0 | 0 | 0 | 0 | 0 |
| 0.630999999999986 | 0.631 | 0.501 | 0.355 | 0.211 | 0.097 | 0.03 | 0.005 | 0 | 0 | 0 | 0 | 0 |
| 0.631499999999986 | 0.631 | 0.502 | 0.356 | 0.212 | 0.098 | 0.03 | 0.005 | 0 | 0 | 0 | 0 | 0 |
| 0.631999999999986 | 0.632 | 0.502 | 0.356 | 0.213 | 0.098 | 0.031 | 0.005 | 0 | 0 | 0 | 0 | 0 |
| 0.632499999999986 | 0.632 | 0.503 | 0.357 | 0.213 | 0.098 | 0.031 | 0.005 | 0 | 0 | 0 | 0 | 0 |
| 0.632999999999986 | 0.633 | 0.504 | 0.357 | 0.214 | 0.099 | 0.031 | 0.005 | 0 | 0 | 0 | 0 | 0 |
| 0.633499999999986 | 0.633 | 0.504 | 0.358 | 0.214 | 0.099 | 0.031 | 0.006 | 0 | 0 | 0 | 0 | 0 |
| 0.633999999999985 | 0.634 | 0.505 | 0.359 | 0.215 | 0.1 | 0.031 | 0.006 | 0 | 0 | 0 | 0 | 0 |
| 0.634499999999985 | 0.634 | 0.505 | 0.359 | 0.215 | 0.1 | 0.032 | 0.006 | 0 | 0 | 0 | 0 | 0 |
| 0.634999999999985 | 0.635 | 0.506 | 0.36 | 0.216 | 0.1 | 0.032 | 0.006 | 0 | 0 | 0 | 0 | 0 |
| 0.635499999999985 | 0.635 | 0.507 | 0.361 | 0.217 | 0.101 | 0.032 | 0.006 | 0 | 0 | 0 | 0 | 0 |
| 0.635999999999985 | 0.636 | 0.507 | 0.361 | 0.217 | 0.101 | 0.032 | 0.006 | 0 | 0 | 0 | 0 | 0 |
| 0.636499999999985 | 0.636 | 0.508 | 0.362 | 0.218 | 0.102 | 0.032 | 0.006 | 0 | 0 | 0 | 0 | 0 |
| 0.636999999999985 | 0.637 | 0.508 | 0.363 | 0.218 | 0.102 | 0.033 | 0.006 | 0 | 0 | 0 | 0 | 0 |
| 0.637499999999985 | 0.637 | 0.509 | 0.363 | 0.219 | 0.102 | 0.033 | 0.006 | 0 | 0 | 0 | 0 | 0 |
| 0.637999999999985 | 0.638 | 0.51 | 0.364 | 0.219 | 0.103 | 0.033 | 0.006 | 0 | 0 | 0 | 0 | 0 |
| 0.638499999999985 | 0.638 | 0.51 | 0.364 | 0.22 | 0.103 | 0.033 | 0.006 | 0 | 0 | 0 | 0 | 0 |
| 0.638999999999985 | 0.639 | 0.511 | 0.365 | 0.221 | 0.104 | 0.033 | 0.006 | 0 | 0 | 0 | 0 | 0 |
| 0.639499999999985 | 0.639 | 0.511 | 0.366 | 0.221 | 0.104 | 0.034 | 0.006 | 0 | 0 | 0 | 0 | 0 |
| 0.639999999999985 | 0.64 | 0.512 | 0.366 | 0.222 | 0.104 | 0.034 | 0.006 | 0 | 0 | 0 | 0 | 0 |
| 0.640499999999985 | 0.64 | 0.513 | 0.367 | 0.222 | 0.105 | 0.034 | 0.006 | 0 | 0 | 0 | 0 | 0 |
| 0.640999999999985 | 0.641 | 0.513 | 0.368 | 0.223 | 0.105 | 0.034 | 0.006 | 0.001 | 0 | 0 | 0 | 0 |
| 0.641499999999985 | 0.641 | 0.514 | 0.368 | 0.224 | 0.106 | 0.034 | 0.006 | 0.001 | 0 | 0 | 0 | 0 |
| 0.641999999999985 | 0.642 | 0.514 | 0.369 | 0.224 | 0.106 | 0.035 | 0.006 | 0.001 | 0 | 0 | 0 | 0 |
| 0.642499999999985 | 0.642 | 0.515 | 0.37 | 0.225 | 0.107 | 0.035 | 0.006 | 0.001 | 0 | 0 | 0 | 0 |
| 0.642999999999984 | 0.643 | 0.516 | 0.37 | 0.225 | 0.107 | 0.035 | 0.007 | 0.001 | 0 | 0 | 0 | 0 |
| 0.643499999999984 | 0.643 | 0.516 | 0.371 | 0.226 | 0.107 | 0.035 | 0.007 | 0.001 | 0 | 0 | 0 | 0 |
| 0.643999999999984 | 0.644 | 0.517 | 0.372 | 0.226 | 0.108 | 0.035 | 0.007 | 0.001 | 0 | 0 | 0 | 0 |
| 0.644499999999984 | 0.644 | 0.517 | 0.372 | 0.227 | 0.108 | 0.036 | 0.007 | 0.001 | 0 | 0 | 0 | 0 |
| 0.644999999999984 | 0.645 | 0.518 | 0.373 | 0.228 | 0.109 | 0.036 | 0.007 | 0.001 | 0 | 0 | 0 | 0 |
| 0.645499999999984 | 0.645 | 0.519 | 0.373 | 0.228 | 0.109 | 0.036 | 0.007 | 0.001 | 0 | 0 | 0 | 0 |
| 0.645999999999984 | 0.646 | 0.519 | 0.374 | 0.229 | 0.109 | 0.036 | 0.007 | 0.001 | 0 | 0 | 0 | 0 |
| 0.646499999999984 | 0.646 | 0.52 | 0.375 | 0.229 | 0.11 | 0.036 | 0.007 | 0.001 | 0 | 0 | 0 | 0 |
| 0.646999999999984 | 0.647 | 0.52 | 0.375 | 0.23 | 0.11 | 0.037 | 0.007 | 0.001 | 0 | 0 | 0 | 0 |
| 0.647499999999984 | 0.647 | 0.521 | 0.376 | 0.231 | 0.111 | 0.037 | 0.007 | 0.001 | 0 | 0 | 0 | 0 |
| 0.647999999999984 | 0.648 | 0.522 | 0.377 | 0.231 | 0.111 | 0.037 | 0.007 | 0.001 | 0 | 0 | 0 | 0 |
| 0.648499999999984 | 0.648 | 0.522 | 0.377 | 0.232 | 0.112 | 0.037 | 0.007 | 0.001 | 0 | 0 | 0 | 0 |
| 0.648999999999984 | 0.649 | 0.523 | 0.378 | 0.232 | 0.112 | 0.038 | 0.007 | 0.001 | 0 | 0 | 0 | 0 |
| 0.649499999999984 | 0.649 | 0.523 | 0.379 | 0.233 | 0.113 | 0.038 | 0.007 | 0.001 | 0 | 0 | 0 | 0 |
| 0.649999999999984 | 0.65 | 0.524 | 0.379 | 0.234 | 0.113 | 0.038 | 0.007 | 0.001 | 0 | 0 | 0 | 0 |
| 0.650499999999984 | 0.65 | 0.525 | 0.38 | 0.234 | 0.113 | 0.038 | 0.007 | 0.001 | 0 | 0 | 0 | 0 |
| 0.650999999999984 | 0.651 | 0.525 | 0.381 | 0.235 | 0.114 | 0.038 | 0.008 | 0.001 | 0 | 0 | 0 | 0 |
| 0.651499999999984 | 0.651 | 0.526 | 0.381 | 0.235 | 0.114 | 0.039 | 0.008 | 0.001 | 0 | 0 | 0 | 0 |
| 0.651999999999983 | 0.652 | 0.526 | 0.382 | 0.236 | 0.115 | 0.039 | 0.008 | 0.001 | 0 | 0 | 0 | 0 |
| 0.652499999999983 | 0.652 | 0.527 | 0.383 | 0.237 | 0.115 | 0.039 | 0.008 | 0.001 | 0 | 0 | 0 | 0 |
| 0.652999999999983 | 0.653 | 0.528 | 0.383 | 0.237 | 0.116 | 0.039 | 0.008 | 0.001 | 0 | 0 | 0 | 0 |
| 0.653499999999983 | 0.653 | 0.528 | 0.384 | 0.238 | 0.116 | 0.04 | 0.008 | 0.001 | 0 | 0 | 0 | 0 |
| 0.653999999999983 | 0.654 | 0.529 | 0.385 | 0.239 | 0.117 | 0.04 | 0.008 | 0.001 | 0 | 0 | 0 | 0 |
| 0.654499999999983 | 0.654 | 0.529 | 0.385 | 0.239 | 0.117 | 0.04 | 0.008 | 0.001 | 0 | 0 | 0 | 0 |
| 0.654999999999983 | 0.655 | 0.53 | 0.386 | 0.24 | 0.117 | 0.04 | 0.008 | 0.001 | 0 | 0 | 0 | 0 |
| 0.655499999999983 | 0.655 | 0.531 | 0.387 | 0.24 | 0.118 | 0.04 | 0.008 | 0.001 | 0 | 0 | 0 | 0 |
| 0.655999999999983 | 0.656 | 0.531 | 0.387 | 0.241 | 0.118 | 0.041 | 0.008 | 0.001 | 0 | 0 | 0 | 0 |
| 0.656499999999983 | 0.656 | 0.532 | 0.388 | 0.242 | 0.119 | 0.041 | 0.008 | 0.001 | 0 | 0 | 0 | 0 |
| 0.656999999999983 | 0.657 | 0.533 | 0.389 | 0.242 | 0.119 | 0.041 | 0.008 | 0.001 | 0 | 0 | 0 | 0 |
| 0.657499999999983 | 0.657 | 0.533 | 0.389 | 0.243 | 0.12 | 0.041 | 0.008 | 0.001 | 0 | 0 | 0 | 0 |
| 0.657999999999983 | 0.658 | 0.534 | 0.39 | 0.244 | 0.12 | 0.042 | 0.009 | 0.001 | 0 | 0 | 0 | 0 |
| 0.658499999999983 | 0.658 | 0.534 | 0.391 | 0.244 | 0.121 | 0.042 | 0.009 | 0.001 | 0 | 0 | 0 | 0 |
| 0.658999999999983 | 0.659 | 0.535 | 0.391 | 0.245 | 0.121 | 0.042 | 0.009 | 0.001 | 0 | 0 | 0 | 0 |
| 0.659499999999983 | 0.659 | 0.536 | 0.392 | 0.245 | 0.122 | 0.042 | 0.009 | 0.001 | 0 | 0 | 0 | 0 |
| 0.659999999999983 | 0.66 | 0.536 | 0.393 | 0.246 | 0.122 | 0.043 | 0.009 | 0.001 | 0 | 0 | 0 | 0 |
| 0.660499999999983 | 0.66 | 0.537 | 0.393 | 0.247 | 0.122 | 0.043 | 0.009 | 0.001 | 0 | 0 | 0 | 0 |
| 0.660999999999983 | 0.661 | 0.537 | 0.394 | 0.247 | 0.123 | 0.043 | 0.009 | 0.001 | 0 | 0 | 0 | 0 |
| 0.661499999999982 | 0.661 | 0.538 | 0.395 | 0.248 | 0.123 | 0.043 | 0.009 | 0.001 | 0 | 0 | 0 | 0 |
| 0.661999999999982 | 0.662 | 0.539 | 0.395 | 0.249 | 0.124 | 0.044 | 0.009 | 0.001 | 0 | 0 | 0 | 0 |
| 0.662499999999982 | 0.662 | 0.539 | 0.396 | 0.249 | 0.124 | 0.044 | 0.009 | 0.001 | 0 | 0 | 0 | 0 |
| 0.662999999999982 | 0.663 | 0.54 | 0.397 | 0.25 | 0.125 | 0.044 | 0.009 | 0.001 | 0 | 0 | 0 | 0 |
| 0.663499999999982 | 0.663 | 0.54 | 0.397 | 0.25 | 0.125 | 0.044 | 0.009 | 0.001 | 0 | 0 | 0 | 0 |
| 0.663999999999982 | 0.664 | 0.541 | 0.398 | 0.251 | 0.126 | 0.045 | 0.009 | 0.001 | 0 | 0 | 0 | 0 |
| 0.664499999999982 | 0.664 | 0.542 | 0.399 | 0.252 | 0.126 | 0.045 | 0.01 | 0.001 | 0 | 0 | 0 | 0 |
| 0.664999999999982 | 0.665 | 0.542 | 0.399 | 0.252 | 0.127 | 0.045 | 0.01 | 0.001 | 0 | 0 | 0 | 0 |
| 0.665499999999982 | 0.665 | 0.543 | 0.4 | 0.253 | 0.127 | 0.045 | 0.01 | 0.001 | 0 | 0 | 0 | 0 |
| 0.665999999999982 | 0.666 | 0.544 | 0.401 | 0.254 | 0.128 | 0.046 | 0.01 | 0.001 | 0 | 0 | 0 | 0 |
| 0.666499999999982 | 0.666 | 0.544 | 0.401 | 0.254 | 0.128 | 0.046 | 0.01 | 0.001 | 0 | 0 | 0 | 0 |
| 0.666999999999982 | 0.667 | 0.545 | 0.402 | 0.255 | 0.129 | 0.046 | 0.01 | 0.001 | 0 | 0 | 0 | 0 |
| 0.667499999999982 | 0.667 | 0.545 | 0.403 | 0.256 | 0.129 | 0.046 | 0.01 | 0.001 | 0 | 0 | 0 | 0 |
| 0.667999999999982 | 0.668 | 0.546 | 0.403 | 0.256 | 0.13 | 0.047 | 0.01 | 0.001 | 0 | 0 | 0 | 0 |
| 0.668499999999982 | 0.668 | 0.547 | 0.404 | 0.257 | 0.13 | 0.047 | 0.01 | 0.001 | 0 | 0 | 0 | 0 |
| 0.668999999999982 | 0.669 | 0.547 | 0.405 | 0.258 | 0.131 | 0.047 | 0.01 | 0.001 | 0 | 0 | 0 | 0 |
| 0.669499999999982 | 0.669 | 0.548 | 0.405 | 0.258 | 0.131 | 0.048 | 0.01 | 0.001 | 0 | 0 | 0 | 0 |
| 0.669999999999982 | 0.67 | 0.548 | 0.406 | 0.259 | 0.132 | 0.048 | 0.01 | 0.001 | 0 | 0 | 0 | 0 |
| 0.670499999999981 | 0.67 | 0.549 | 0.407 | 0.259 | 0.132 | 0.048 | 0.011 | 0.001 | 0 | 0 | 0 | 0 |
| 0.670999999999981 | 0.671 | 0.55 | 0.407 | 0.26 | 0.133 | 0.048 | 0.011 | 0.001 | 0 | 0 | 0 | 0 |
| 0.671499999999981 | 0.671 | 0.55 | 0.408 | 0.261 | 0.133 | 0.049 | 0.011 | 0.001 | 0 | 0 | 0 | 0 |
| 0.671999999999981 | 0.672 | 0.551 | 0.409 | 0.261 | 0.134 | 0.049 | 0.011 | 0.001 | 0 | 0 | 0 | 0 |
| 0.672499999999981 | 0.672 | 0.551 | 0.41 | 0.262 | 0.134 | 0.049 | 0.011 | 0.001 | 0 | 0 | 0 | 0 |
| 0.672999999999981 | 0.673 | 0.552 | 0.41 | 0.263 | 0.135 | 0.049 | 0.011 | 0.001 | 0 | 0 | 0 | 0 |
| 0.673499999999981 | 0.673 | 0.553 | 0.411 | 0.263 | 0.135 | 0.05 | 0.011 | 0.001 | 0 | 0 | 0 | 0 |
| 0.673999999999981 | 0.674 | 0.553 | 0.412 | 0.264 | 0.136 | 0.05 | 0.011 | 0.001 | 0 | 0 | 0 | 0 |
| 0.674499999999981 | 0.674 | 0.554 | 0.412 | 0.265 | 0.136 | 0.05 | 0.011 | 0.001 | 0 | 0 | 0 | 0 |
| 0.674999999999981 | 0.675 | 0.555 | 0.413 | 0.265 | 0.137 | 0.051 | 0.011 | 0.001 | 0 | 0 | 0 | 0 |
| 0.675499999999981 | 0.675 | 0.555 | 0.414 | 0.266 | 0.137 | 0.051 | 0.011 | 0.001 | 0 | 0 | 0 | 0 |
| 0.675999999999981 | 0.676 | 0.556 | 0.414 | 0.267 | 0.138 | 0.051 | 0.012 | 0.001 | 0 | 0 | 0 | 0 |
| 0.676499999999981 | 0.676 | 0.556 | 0.415 | 0.267 | 0.138 | 0.051 | 0.012 | 0.001 | 0 | 0 | 0 | 0 |
| 0.676999999999981 | 0.677 | 0.557 | 0.416 | 0.268 | 0.139 | 0.052 | 0.012 | 0.001 | 0 | 0 | 0 | 0 |
| 0.677499999999981 | 0.677 | 0.558 | 0.416 | 0.269 | 0.139 | 0.052 | 0.012 | 0.001 | 0 | 0 | 0 | 0 |
| 0.677999999999981 | 0.678 | 0.558 | 0.417 | 0.269 | 0.14 | 0.052 | 0.012 | 0.001 | 0 | 0 | 0 | 0 |
| 0.678499999999981 | 0.678 | 0.559 | 0.418 | 0.27 | 0.14 | 0.053 | 0.012 | 0.001 | 0 | 0 | 0 | 0 |
| 0.678999999999981 | 0.679 | 0.56 | 0.419 | 0.271 | 0.141 | 0.053 | 0.012 | 0.001 | 0 | 0 | 0 | 0 |
| 0.67949999999998 | 0.679 | 0.56 | 0.419 | 0.271 | 0.141 | 0.053 | 0.012 | 0.001 | 0 | 0 | 0 | 0 |
| 0.67999999999998 | 0.68 | 0.561 | 0.42 | 0.272 | 0.142 | 0.053 | 0.012 | 0.001 | 0 | 0 | 0 | 0 |
| 0.68049999999998 | 0.68 | 0.561 | 0.421 | 0.273 | 0.142 | 0.054 | 0.012 | 0.001 | 0 | 0 | 0 | 0 |
| 0.68099999999998 | 0.681 | 0.562 | 0.421 | 0.273 | 0.143 | 0.054 | 0.013 | 0.001 | 0 | 0 | 0 | 0 |
| 0.68149999999998 | 0.681 | 0.563 | 0.422 | 0.274 | 0.144 | 0.054 | 0.013 | 0.001 | 0 | 0 | 0 | 0 |
| 0.68199999999998 | 0.682 | 0.563 | 0.423 | 0.275 | 0.144 | 0.055 | 0.013 | 0.001 | 0 | 0 | 0 | 0 |
| 0.68249999999998 | 0.682 | 0.564 | 0.423 | 0.275 | 0.145 | 0.055 | 0.013 | 0.001 | 0 | 0 | 0 | 0 |
| 0.68299999999998 | 0.683 | 0.564 | 0.424 | 0.276 | 0.145 | 0.055 | 0.013 | 0.001 | 0 | 0 | 0 | 0 |
| 0.68349999999998 | 0.683 | 0.565 | 0.425 | 0.277 | 0.146 | 0.056 | 0.013 | 0.002 | 0 | 0 | 0 | 0 |
| 0.68399999999998 | 0.684 | 0.566 | 0.425 | 0.278 | 0.146 | 0.056 | 0.013 | 0.002 | 0 | 0 | 0 | 0 |
| 0.68449999999998 | 0.684 | 0.566 | 0.426 | 0.278 | 0.147 | 0.056 | 0.013 | 0.002 | 0 | 0 | 0 | 0 |
| 0.68499999999998 | 0.685 | 0.567 | 0.427 | 0.279 | 0.147 | 0.057 | 0.013 | 0.002 | 0 | 0 | 0 | 0 |
| 0.68549999999998 | 0.685 | 0.568 | 0.428 | 0.28 | 0.148 | 0.057 | 0.014 | 0.002 | 0 | 0 | 0 | 0 |
| 0.68599999999998 | 0.686 | 0.568 | 0.428 | 0.28 | 0.148 | 0.057 | 0.014 | 0.002 | 0 | 0 | 0 | 0 |
| 0.68649999999998 | 0.686 | 0.569 | 0.429 | 0.281 | 0.149 | 0.057 | 0.014 | 0.002 | 0 | 0 | 0 | 0 |
| 0.68699999999998 | 0.687 | 0.569 | 0.43 | 0.282 | 0.149 | 0.058 | 0.014 | 0.002 | 0 | 0 | 0 | 0 |
| 0.68749999999998 | 0.687 | 0.57 | 0.43 | 0.282 | 0.15 | 0.058 | 0.014 | 0.002 | 0 | 0 | 0 | 0 |
| 0.68799999999998 | 0.688 | 0.571 | 0.431 | 0.283 | 0.151 | 0.058 | 0.014 | 0.002 | 0 | 0 | 0 | 0 |
| 0.688499999999979 | 0.688 | 0.571 | 0.432 | 0.284 | 0.151 | 0.059 | 0.014 | 0.002 | 0 | 0 | 0 | 0 |
| 0.688999999999979 | 0.689 | 0.572 | 0.433 | 0.284 | 0.152 | 0.059 | 0.014 | 0.002 | 0 | 0 | 0 | 0 |
| 0.689499999999979 | 0.689 | 0.573 | 0.433 | 0.285 | 0.152 | 0.059 | 0.014 | 0.002 | 0 | 0 | 0 | 0 |
| 0.689999999999979 | 0.69 | 0.573 | 0.434 | 0.286 | 0.153 | 0.06 | 0.015 | 0.002 | 0 | 0 | 0 | 0 |
| 0.690499999999979 | 0.69 | 0.574 | 0.435 | 0.287 | 0.153 | 0.06 | 0.015 | 0.002 | 0 | 0 | 0 | 0 |
| 0.690999999999979 | 0.691 | 0.574 | 0.435 | 0.287 | 0.154 | 0.06 | 0.015 | 0.002 | 0 | 0 | 0 | 0 |
| 0.691499999999979 | 0.691 | 0.575 | 0.436 | 0.288 | 0.155 | 0.061 | 0.015 | 0.002 | 0 | 0 | 0 | 0 |
| 0.691999999999979 | 0.692 | 0.576 | 0.437 | 0.289 | 0.155 | 0.061 | 0.015 | 0.002 | 0 | 0 | 0 | 0 |
| 0.692499999999979 | 0.692 | 0.576 | 0.437 | 0.289 | 0.156 | 0.061 | 0.015 | 0.002 | 0 | 0 | 0 | 0 |
| 0.692999999999979 | 0.693 | 0.577 | 0.438 | 0.29 | 0.156 | 0.062 | 0.015 | 0.002 | 0 | 0 | 0 | 0 |
| 0.693499999999979 | 0.693 | 0.578 | 0.439 | 0.291 | 0.157 | 0.062 | 0.015 | 0.002 | 0 | 0 | 0 | 0 |
| 0.693999999999979 | 0.694 | 0.578 | 0.44 | 0.291 | 0.157 | 0.062 | 0.016 | 0.002 | 0 | 0 | 0 | 0 |
| 0.694499999999979 | 0.694 | 0.579 | 0.44 | 0.292 | 0.158 | 0.063 | 0.016 | 0.002 | 0 | 0 | 0 | 0 |
| 0.694999999999979 | 0.695 | 0.579 | 0.441 | 0.293 | 0.159 | 0.063 | 0.016 | 0.002 | 0 | 0 | 0 | 0 |
| 0.695499999999979 | 0.695 | 0.58 | 0.442 | 0.294 | 0.159 | 0.063 | 0.016 | 0.002 | 0 | 0 | 0 | 0 |
| 0.695999999999979 | 0.696 | 0.581 | 0.442 | 0.294 | 0.16 | 0.064 | 0.016 | 0.002 | 0 | 0 | 0 | 0 |
| 0.696499999999979 | 0.696 | 0.581 | 0.443 | 0.295 | 0.16 | 0.064 | 0.016 | 0.002 | 0 | 0 | 0 | 0 |
| 0.696999999999979 | 0.697 | 0.582 | 0.444 | 0.296 | 0.161 | 0.064 | 0.016 | 0.002 | 0 | 0 | 0 | 0 |
| 0.697499999999978 | 0.697 | 0.583 | 0.445 | 0.296 | 0.161 | 0.065 | 0.017 | 0.002 | 0 | 0 | 0 | 0 |
| 0.697999999999978 | 0.698 | 0.583 | 0.445 | 0.297 | 0.162 | 0.065 | 0.017 | 0.002 | 0 | 0 | 0 | 0 |
| 0.698499999999978 | 0.698 | 0.584 | 0.446 | 0.298 | 0.163 | 0.066 | 0.017 | 0.002 | 0 | 0 | 0 | 0 |
| 0.698999999999978 | 0.699 | 0.584 | 0.447 | 0.299 | 0.163 | 0.066 | 0.017 | 0.002 | 0 | 0 | 0 | 0 |
| 0.699499999999978 | 0.699 | 0.585 | 0.447 | 0.299 | 0.164 | 0.066 | 0.017 | 0.002 | 0 | 0 | 0 | 0 |
| 0.699999999999978 | 0.7 | 0.586 | 0.448 | 0.3 | 0.164 | 0.067 | 0.017 | 0.002 | 0 | 0 | 0 | 0 |
| 0.700499999999978 | 0.7 | 0.586 | 0.449 | 0.301 | 0.165 | 0.067 | 0.017 | 0.002 | 0 | 0 | 0 | 0 |
| 0.700999999999978 | 0.701 | 0.587 | 0.45 | 0.302 | 0.166 | 0.067 | 0.017 | 0.002 | 0 | 0 | 0 | 0 |
| 0.701499999999978 | 0.701 | 0.588 | 0.45 | 0.302 | 0.166 | 0.068 | 0.018 | 0.002 | 0 | 0 | 0 | 0 |
| 0.701999999999978 | 0.702 | 0.588 | 0.451 | 0.303 | 0.167 | 0.068 | 0.018 | 0.002 | 0 | 0 | 0 | 0 |
| 0.702499999999978 | 0.702 | 0.589 | 0.452 | 0.304 | 0.167 | 0.068 | 0.018 | 0.002 | 0 | 0 | 0 | 0 |
| 0.702999999999978 | 0.703 | 0.589 | 0.453 | 0.304 | 0.168 | 0.069 | 0.018 | 0.002 | 0 | 0 | 0 | 0 |
| 0.703499999999978 | 0.703 | 0.59 | 0.453 | 0.305 | 0.169 | 0.069 | 0.018 | 0.002 | 0 | 0 | 0 | 0 |
| 0.703999999999978 | 0.704 | 0.591 | 0.454 | 0.306 | 0.169 | 0.07 | 0.018 | 0.002 | 0 | 0 | 0 | 0 |
| 0.704499999999978 | 0.704 | 0.591 | 0.455 | 0.307 | 0.17 | 0.07 | 0.019 | 0.003 | 0 | 0 | 0 | 0 |
| 0.704999999999978 | 0.705 | 0.592 | 0.455 | 0.307 | 0.17 | 0.07 | 0.019 | 0.003 | 0 | 0 | 0 | 0 |
| 0.705499999999978 | 0.705 | 0.593 | 0.456 | 0.308 | 0.171 | 0.071 | 0.019 | 0.003 | 0 | 0 | 0 | 0 |
| 0.705999999999978 | 0.706 | 0.593 | 0.457 | 0.309 | 0.172 | 0.071 | 0.019 | 0.003 | 0 | 0 | 0 | 0 |
| 0.706499999999978 | 0.706 | 0.594 | 0.458 | 0.31 | 0.172 | 0.071 | 0.019 | 0.003 | 0 | 0 | 0 | 0 |
| 0.706999999999977 | 0.707 | 0.594 | 0.458 | 0.31 | 0.173 | 0.072 | 0.019 | 0.003 | 0 | 0 | 0 | 0 |
| 0.707499999999977 | 0.707 | 0.595 | 0.459 | 0.311 | 0.173 | 0.072 | 0.019 | 0.003 | 0 | 0 | 0 | 0 |
| 0.707999999999977 | 0.708 | 0.596 | 0.46 | 0.312 | 0.174 | 0.073 | 0.02 | 0.003 | 0 | 0 | 0 | 0 |
| 0.708499999999977 | 0.708 | 0.596 | 0.461 | 0.313 | 0.175 | 0.073 | 0.02 | 0.003 | 0 | 0 | 0 | 0 |
| 0.708999999999977 | 0.709 | 0.597 | 0.461 | 0.313 | 0.175 | 0.073 | 0.02 | 0.003 | 0 | 0 | 0 | 0 |
| 0.709499999999977 | 0.709 | 0.598 | 0.462 | 0.314 | 0.176 | 0.074 | 0.02 | 0.003 | 0 | 0 | 0 | 0 |
| 0.709999999999977 | 0.71 | 0.598 | 0.463 | 0.315 | 0.177 | 0.074 | 0.02 | 0.003 | 0 | 0 | 0 | 0 |
| 0.710499999999977 | 0.71 | 0.599 | 0.463 | 0.316 | 0.177 | 0.075 | 0.02 | 0.003 | 0 | 0 | 0 | 0 |
| 0.710999999999977 | 0.711 | 0.6 | 0.464 | 0.316 | 0.178 | 0.075 | 0.021 | 0.003 | 0 | 0 | 0 | 0 |
| 0.711499999999977 | 0.711 | 0.6 | 0.465 | 0.317 | 0.178 | 0.075 | 0.021 | 0.003 | 0 | 0 | 0 | 0 |
| 0.711999999999977 | 0.712 | 0.601 | 0.466 | 0.318 | 0.179 | 0.076 | 0.021 | 0.003 | 0 | 0 | 0 | 0 |
| 0.712499999999977 | 0.712 | 0.601 | 0.466 | 0.319 | 0.18 | 0.076 | 0.021 | 0.003 | 0 | 0 | 0 | 0 |
| 0.712999999999977 | 0.713 | 0.602 | 0.467 | 0.319 | 0.18 | 0.077 | 0.021 | 0.003 | 0 | 0 | 0 | 0 |
| 0.713499999999977 | 0.713 | 0.603 | 0.468 | 0.32 | 0.181 | 0.077 | 0.021 | 0.003 | 0 | 0 | 0 | 0 |
| 0.713999999999977 | 0.714 | 0.603 | 0.469 | 0.321 | 0.182 | 0.077 | 0.022 | 0.003 | 0 | 0 | 0 | 0 |
| 0.714499999999977 | 0.714 | 0.604 | 0.469 | 0.322 | 0.182 | 0.078 | 0.022 | 0.003 | 0 | 0 | 0 | 0 |
| 0.714999999999977 | 0.715 | 0.605 | 0.47 | 0.322 | 0.183 | 0.078 | 0.022 | 0.003 | 0 | 0 | 0 | 0 |
| 0.715499999999977 | 0.715 | 0.605 | 0.471 | 0.323 | 0.184 | 0.079 | 0.022 | 0.003 | 0 | 0 | 0 | 0 |
| 0.715999999999976 | 0.716 | 0.606 | 0.472 | 0.324 | 0.184 | 0.079 | 0.022 | 0.003 | 0 | 0 | 0 | 0 |
| 0.716499999999976 | 0.716 | 0.606 | 0.472 | 0.325 | 0.185 | 0.08 | 0.022 | 0.003 | 0 | 0 | 0 | 0 |
| 0.716999999999976 | 0.717 | 0.607 | 0.473 | 0.325 | 0.186 | 0.08 | 0.023 | 0.003 | 0 | 0 | 0 | 0 |
| 0.717499999999976 | 0.717 | 0.608 | 0.474 | 0.326 | 0.186 | 0.08 | 0.023 | 0.003 | 0 | 0 | 0 | 0 |
| 0.717999999999976 | 0.718 | 0.608 | 0.475 | 0.327 | 0.187 | 0.081 | 0.023 | 0.003 | 0 | 0 | 0 | 0 |
| 0.718499999999976 | 0.718 | 0.609 | 0.475 | 0.328 | 0.188 | 0.081 | 0.023 | 0.004 | 0 | 0 | 0 | 0 |
| 0.718999999999976 | 0.719 | 0.61 | 0.476 | 0.328 | 0.188 | 0.082 | 0.023 | 0.004 | 0 | 0 | 0 | 0 |
| 0.719499999999976 | 0.719 | 0.61 | 0.477 | 0.329 | 0.189 | 0.082 | 0.024 | 0.004 | 0 | 0 | 0 | 0 |
| 0.719999999999976 | 0.72 | 0.611 | 0.478 | 0.33 | 0.19 | 0.083 | 0.024 | 0.004 | 0 | 0 | 0 | 0 |
| 0.720499999999976 | 0.72 | 0.612 | 0.478 | 0.331 | 0.19 | 0.083 | 0.024 | 0.004 | 0 | 0 | 0 | 0 |
| 0.720999999999976 | 0.721 | 0.612 | 0.479 | 0.332 | 0.191 | 0.083 | 0.024 | 0.004 | 0 | 0 | 0 | 0 |
| 0.721499999999976 | 0.721 | 0.613 | 0.48 | 0.332 | 0.192 | 0.084 | 0.024 | 0.004 | 0 | 0 | 0 | 0 |
| 0.721999999999976 | 0.722 | 0.613 | 0.481 | 0.333 | 0.192 | 0.084 | 0.024 | 0.004 | 0 | 0 | 0 | 0 |
| 0.722499999999976 | 0.722 | 0.614 | 0.481 | 0.334 | 0.193 | 0.085 | 0.025 | 0.004 | 0 | 0 | 0 | 0 |
| 0.722999999999976 | 0.723 | 0.615 | 0.482 | 0.335 | 0.194 | 0.085 | 0.025 | 0.004 | 0 | 0 | 0 | 0 |
| 0.723499999999976 | 0.723 | 0.615 | 0.483 | 0.335 | 0.194 | 0.086 | 0.025 | 0.004 | 0 | 0 | 0 | 0 |
| 0.723999999999976 | 0.724 | 0.616 | 0.484 | 0.336 | 0.195 | 0.086 | 0.025 | 0.004 | 0 | 0 | 0 | 0 |
| 0.724499999999976 | 0.724 | 0.617 | 0.484 | 0.337 | 0.196 | 0.087 | 0.025 | 0.004 | 0 | 0 | 0 | 0 |
| 0.724999999999975 | 0.725 | 0.617 | 0.485 | 0.338 | 0.196 | 0.087 | 0.026 | 0.004 | 0 | 0 | 0 | 0 |
| 0.725499999999975 | 0.725 | 0.618 | 0.486 | 0.339 | 0.197 | 0.087 | 0.026 | 0.004 | 0 | 0 | 0 | 0 |
| 0.725999999999975 | 0.726 | 0.619 | 0.487 | 0.339 | 0.198 | 0.088 | 0.026 | 0.004 | 0 | 0 | 0 | 0 |
| 0.726499999999975 | 0.726 | 0.619 | 0.487 | 0.34 | 0.198 | 0.088 | 0.026 | 0.004 | 0 | 0 | 0 | 0 |
| 0.726999999999975 | 0.727 | 0.62 | 0.488 | 0.341 | 0.199 | 0.089 | 0.026 | 0.004 | 0 | 0 | 0 | 0 |
| 0.727499999999975 | 0.727 | 0.621 | 0.489 | 0.342 | 0.2 | 0.089 | 0.027 | 0.004 | 0 | 0 | 0 | 0 |
| 0.727999999999975 | 0.728 | 0.621 | 0.49 | 0.343 | 0.2 | 0.09 | 0.027 | 0.004 | 0 | 0 | 0 | 0 |
| 0.728499999999975 | 0.728 | 0.622 | 0.49 | 0.343 | 0.201 | 0.09 | 0.027 | 0.004 | 0 | 0 | 0 | 0 |
| 0.728999999999975 | 0.729 | 0.622 | 0.491 | 0.344 | 0.202 | 0.091 | 0.027 | 0.005 | 0 | 0 | 0 | 0 |
| 0.729499999999975 | 0.729 | 0.623 | 0.492 | 0.345 | 0.203 | 0.091 | 0.028 | 0.005 | 0 | 0 | 0 | 0 |
| 0.729999999999975 | 0.73 | 0.624 | 0.493 | 0.346 | 0.203 | 0.092 | 0.028 | 0.005 | 0 | 0 | 0 | 0 |
| 0.730499999999975 | 0.73 | 0.624 | 0.493 | 0.347 | 0.204 | 0.092 | 0.028 | 0.005 | 0 | 0 | 0 | 0 |
| 0.730999999999975 | 0.731 | 0.625 | 0.494 | 0.347 | 0.205 | 0.093 | 0.028 | 0.005 | 0 | 0 | 0 | 0 |
| 0.731499999999975 | 0.731 | 0.626 | 0.495 | 0.348 | 0.205 | 0.093 | 0.028 | 0.005 | 0 | 0 | 0 | 0 |
| 0.731999999999975 | 0.732 | 0.626 | 0.496 | 0.349 | 0.206 | 0.094 | 0.029 | 0.005 | 0 | 0 | 0 | 0 |
| 0.732499999999975 | 0.732 | 0.627 | 0.496 | 0.35 | 0.207 | 0.094 | 0.029 | 0.005 | 0 | 0 | 0 | 0 |
| 0.732999999999975 | 0.733 | 0.628 | 0.497 | 0.351 | 0.208 | 0.095 | 0.029 | 0.005 | 0 | 0 | 0 | 0 |
| 0.733499999999975 | 0.733 | 0.628 | 0.498 | 0.351 | 0.208 | 0.095 | 0.029 | 0.005 | 0 | 0 | 0 | 0 |
| 0.733999999999974 | 0.734 | 0.629 | 0.499 | 0.352 | 0.209 | 0.096 | 0.03 | 0.005 | 0 | 0 | 0 | 0 |
| 0.734499999999974 | 0.734 | 0.629 | 0.499 | 0.353 | 0.21 | 0.096 | 0.03 | 0.005 | 0 | 0 | 0 | 0 |
| 0.734999999999974 | 0.735 | 0.63 | 0.5 | 0.354 | 0.21 | 0.097 | 0.03 | 0.005 | 0 | 0 | 0 | 0 |
| 0.735499999999974 | 0.735 | 0.631 | 0.501 | 0.355 | 0.211 | 0.097 | 0.03 | 0.005 | 0 | 0 | 0 | 0 |
| 0.735999999999974 | 0.736 | 0.631 | 0.502 | 0.355 | 0.212 | 0.098 | 0.03 | 0.005 | 0 | 0 | 0 | 0 |
| 0.736499999999974 | 0.736 | 0.632 | 0.503 | 0.356 | 0.213 | 0.098 | 0.031 | 0.005 | 0 | 0 | 0 | 0 |
| 0.736999999999974 | 0.737 | 0.633 | 0.503 | 0.357 | 0.213 | 0.099 | 0.031 | 0.005 | 0 | 0 | 0 | 0 |
| 0.737499999999974 | 0.737 | 0.633 | 0.504 | 0.358 | 0.214 | 0.099 | 0.031 | 0.006 | 0 | 0 | 0 | 0 |
| 0.737999999999974 | 0.738 | 0.634 | 0.505 | 0.359 | 0.215 | 0.1 | 0.031 | 0.006 | 0 | 0 | 0 | 0 |
| 0.738499999999974 | 0.738 | 0.635 | 0.506 | 0.359 | 0.216 | 0.1 | 0.032 | 0.006 | 0 | 0 | 0 | 0 |
| 0.738999999999974 | 0.739 | 0.635 | 0.506 | 0.36 | 0.216 | 0.101 | 0.032 | 0.006 | 0 | 0 | 0 | 0 |
| 0.739499999999974 | 0.739 | 0.636 | 0.507 | 0.361 | 0.217 | 0.101 | 0.032 | 0.006 | 0 | 0 | 0 | 0 |
| 0.739999999999974 | 0.74 | 0.637 | 0.508 | 0.362 | 0.218 | 0.102 | 0.032 | 0.006 | 0 | 0 | 0 | 0 |
| 0.740499999999974 | 0.74 | 0.637 | 0.509 | 0.363 | 0.219 | 0.102 | 0.033 | 0.006 | 0 | 0 | 0 | 0 |
| 0.740999999999974 | 0.741 | 0.638 | 0.509 | 0.364 | 0.219 | 0.103 | 0.033 | 0.006 | 0 | 0 | 0 | 0 |
| 0.741499999999974 | 0.741 | 0.639 | 0.51 | 0.364 | 0.22 | 0.103 | 0.033 | 0.006 | 0 | 0 | 0 | 0 |
| 0.741999999999974 | 0.742 | 0.639 | 0.511 | 0.365 | 0.221 | 0.104 | 0.033 | 0.006 | 0 | 0 | 0 | 0 |
| 0.742499999999974 | 0.742 | 0.64 | 0.512 | 0.366 | 0.222 | 0.104 | 0.034 | 0.006 | 0 | 0 | 0 | 0 |
| 0.742999999999973 | 0.743 | 0.64 | 0.513 | 0.367 | 0.222 | 0.105 | 0.034 | 0.006 | 0 | 0 | 0 | 0 |
| 0.743499999999973 | 0.743 | 0.641 | 0.513 | 0.368 | 0.223 | 0.105 | 0.034 | 0.006 | 0.001 | 0 | 0 | 0 |
| 0.743999999999973 | 0.744 | 0.642 | 0.514 | 0.369 | 0.224 | 0.106 | 0.034 | 0.006 | 0.001 | 0 | 0 | 0 |
| 0.744499999999973 | 0.744 | 0.642 | 0.515 | 0.369 | 0.225 | 0.106 | 0.035 | 0.006 | 0.001 | 0 | 0 | 0 |
| 0.744999999999973 | 0.745 | 0.643 | 0.516 | 0.37 | 0.225 | 0.107 | 0.035 | 0.007 | 0.001 | 0 | 0 | 0 |
| 0.745499999999973 | 0.745 | 0.644 | 0.516 | 0.371 | 0.226 | 0.107 | 0.035 | 0.007 | 0.001 | 0 | 0 | 0 |
| 0.745999999999973 | 0.746 | 0.644 | 0.517 | 0.372 | 0.227 | 0.108 | 0.036 | 0.007 | 0.001 | 0 | 0 | 0 |
| 0.746499999999973 | 0.746 | 0.645 | 0.518 | 0.373 | 0.228 | 0.109 | 0.036 | 0.007 | 0.001 | 0 | 0 | 0 |
| 0.746999999999973 | 0.747 | 0.646 | 0.519 | 0.374 | 0.228 | 0.109 | 0.036 | 0.007 | 0.001 | 0 | 0 | 0 |
| 0.747499999999973 | 0.747 | 0.646 | 0.52 | 0.374 | 0.229 | 0.11 | 0.036 | 0.007 | 0.001 | 0 | 0 | 0 |
| 0.747999999999973 | 0.748 | 0.647 | 0.52 | 0.375 | 0.23 | 0.11 | 0.037 | 0.007 | 0.001 | 0 | 0 | 0 |
| 0.748499999999973 | 0.748 | 0.648 | 0.521 | 0.376 | 0.231 | 0.111 | 0.037 | 0.007 | 0.001 | 0 | 0 | 0 |
| 0.748999999999973 | 0.749 | 0.648 | 0.522 | 0.377 | 0.232 | 0.111 | 0.037 | 0.007 | 0.001 | 0 | 0 | 0 |
| 0.749499999999973 | 0.749 | 0.649 | 0.523 | 0.378 | 0.232 | 0.112 | 0.037 | 0.007 | 0.001 | 0 | 0 | 0 |
| 0.749999999999973 | 0.75 | 0.65 | 0.523 | 0.379 | 0.233 | 0.113 | 0.038 | 0.007 | 0.001 | 0 | 0 | 0 |
| 0.750499999999973 | 0.75 | 0.65 | 0.524 | 0.38 | 0.234 | 0.113 | 0.038 | 0.007 | 0.001 | 0 | 0 | 0 |
| 0.750999999999973 | 0.751 | 0.651 | 0.525 | 0.38 | 0.235 | 0.114 | 0.038 | 0.008 | 0.001 | 0 | 0 | 0 |
| 0.751499999999973 | 0.751 | 0.651 | 0.526 | 0.381 | 0.235 | 0.114 | 0.039 | 0.008 | 0.001 | 0 | 0 | 0 |
| 0.751999999999973 | 0.752 | 0.652 | 0.527 | 0.382 | 0.236 | 0.115 | 0.039 | 0.008 | 0.001 | 0 | 0 | 0 |
| 0.752499999999972 | 0.752 | 0.653 | 0.527 | 0.383 | 0.237 | 0.115 | 0.039 | 0.008 | 0.001 | 0 | 0 | 0 |
| 0.752999999999972 | 0.753 | 0.653 | 0.528 | 0.384 | 0.238 | 0.116 | 0.04 | 0.008 | 0.001 | 0 | 0 | 0 |
| 0.753499999999972 | 0.753 | 0.654 | 0.529 | 0.385 | 0.239 | 0.117 | 0.04 | 0.008 | 0.001 | 0 | 0 | 0 |
| 0.753999999999972 | 0.754 | 0.655 | 0.53 | 0.386 | 0.239 | 0.117 | 0.04 | 0.008 | 0.001 | 0 | 0 | 0 |
| 0.754499999999972 | 0.754 | 0.655 | 0.531 | 0.386 | 0.24 | 0.118 | 0.04 | 0.008 | 0.001 | 0 | 0 | 0 |
| 0.754999999999972 | 0.755 | 0.656 | 0.531 | 0.387 | 0.241 | 0.118 | 0.041 | 0.008 | 0.001 | 0 | 0 | 0 |
| 0.755499999999972 | 0.755 | 0.657 | 0.532 | 0.388 | 0.242 | 0.119 | 0.041 | 0.008 | 0.001 | 0 | 0 | 0 |
| 0.755999999999972 | 0.756 | 0.657 | 0.533 | 0.389 | 0.243 | 0.12 | 0.041 | 0.008 | 0.001 | 0 | 0 | 0 |
| 0.756499999999972 | 0.756 | 0.658 | 0.534 | 0.39 | 0.243 | 0.12 | 0.042 | 0.008 | 0.001 | 0 | 0 | 0 |
| 0.756999999999972 | 0.757 | 0.659 | 0.535 | 0.391 | 0.244 | 0.121 | 0.042 | 0.009 | 0.001 | 0 | 0 | 0 |
| 0.757499999999972 | 0.757 | 0.659 | 0.535 | 0.392 | 0.245 | 0.121 | 0.042 | 0.009 | 0.001 | 0 | 0 | 0 |
| 0.757999999999972 | 0.758 | 0.66 | 0.536 | 0.393 | 0.246 | 0.122 | 0.043 | 0.009 | 0.001 | 0 | 0 | 0 |
| 0.758499999999972 | 0.758 | 0.661 | 0.537 | 0.393 | 0.247 | 0.123 | 0.043 | 0.009 | 0.001 | 0 | 0 | 0 |
| 0.758999999999972 | 0.759 | 0.661 | 0.538 | 0.394 | 0.248 | 0.123 | 0.043 | 0.009 | 0.001 | 0 | 0 | 0 |
| 0.759499999999972 | 0.759 | 0.662 | 0.539 | 0.395 | 0.248 | 0.124 | 0.044 | 0.009 | 0.001 | 0 | 0 | 0 |
| 0.759999999999972 | 0.76 | 0.663 | 0.539 | 0.396 | 0.249 | 0.124 | 0.044 | 0.009 | 0.001 | 0 | 0 | 0 |
| 0.760499999999972 | 0.76 | 0.663 | 0.54 | 0.397 | 0.25 | 0.125 | 0.044 | 0.009 | 0.001 | 0 | 0 | 0 |
| 0.760999999999972 | 0.761 | 0.664 | 0.541 | 0.398 | 0.251 | 0.126 | 0.045 | 0.009 | 0.001 | 0 | 0 | 0 |
| 0.761499999999971 | 0.761 | 0.665 | 0.542 | 0.399 | 0.252 | 0.126 | 0.045 | 0.01 | 0.001 | 0 | 0 | 0 |
| 0.761999999999971 | 0.762 | 0.665 | 0.542 | 0.4 | 0.253 | 0.127 | 0.045 | 0.01 | 0.001 | 0 | 0 | 0 |
| 0.762499999999971 | 0.762 | 0.666 | 0.543 | 0.4 | 0.253 | 0.128 | 0.046 | 0.01 | 0.001 | 0 | 0 | 0 |
| 0.762999999999971 | 0.763 | 0.666 | 0.544 | 0.401 | 0.254 | 0.128 | 0.046 | 0.01 | 0.001 | 0 | 0 | 0 |
| 0.763499999999971 | 0.763 | 0.667 | 0.545 | 0.402 | 0.255 | 0.129 | 0.046 | 0.01 | 0.001 | 0 | 0 | 0 |
| 0.763999999999971 | 0.764 | 0.668 | 0.546 | 0.403 | 0.256 | 0.129 | 0.047 | 0.01 | 0.001 | 0 | 0 | 0 |
| 0.764499999999971 | 0.764 | 0.668 | 0.547 | 0.404 | 0.257 | 0.13 | 0.047 | 0.01 | 0.001 | 0 | 0 | 0 |
| 0.764999999999971 | 0.765 | 0.669 | 0.547 | 0.405 | 0.258 | 0.131 | 0.047 | 0.01 | 0.001 | 0 | 0 | 0 |
| 0.765499999999971 | 0.765 | 0.67 | 0.548 | 0.406 | 0.259 | 0.131 | 0.048 | 0.01 | 0.001 | 0 | 0 | 0 |
| 0.765999999999971 | 0.766 | 0.67 | 0.549 | 0.407 | 0.259 | 0.132 | 0.048 | 0.011 | 0.001 | 0 | 0 | 0 |
| 0.766499999999971 | 0.766 | 0.671 | 0.55 | 0.408 | 0.26 | 0.133 | 0.048 | 0.011 | 0.001 | 0 | 0 | 0 |
| 0.766999999999971 | 0.767 | 0.672 | 0.551 | 0.408 | 0.261 | 0.133 | 0.049 | 0.011 | 0.001 | 0 | 0 | 0 |
| 0.767499999999971 | 0.767 | 0.672 | 0.551 | 0.409 | 0.262 | 0.134 | 0.049 | 0.011 | 0.001 | 0 | 0 | 0 |
| 0.767999999999971 | 0.768 | 0.673 | 0.552 | 0.41 | 0.263 | 0.135 | 0.049 | 0.011 | 0.001 | 0 | 0 | 0 |
| 0.768499999999971 | 0.768 | 0.674 | 0.553 | 0.411 | 0.264 | 0.135 | 0.05 | 0.011 | 0.001 | 0 | 0 | 0 |
| 0.768999999999971 | 0.769 | 0.674 | 0.554 | 0.412 | 0.265 | 0.136 | 0.05 | 0.011 | 0.001 | 0 | 0 | 0 |
| 0.769499999999971 | 0.769 | 0.675 | 0.555 | 0.413 | 0.265 | 0.137 | 0.051 | 0.011 | 0.001 | 0 | 0 | 0 |
| 0.769999999999971 | 0.77 | 0.676 | 0.555 | 0.414 | 0.266 | 0.137 | 0.051 | 0.011 | 0.001 | 0 | 0 | 0 |
| 0.77049999999997 | 0.77 | 0.676 | 0.556 | 0.415 | 0.267 | 0.138 | 0.051 | 0.012 | 0.001 | 0 | 0 | 0 |
| 0.77099999999997 | 0.771 | 0.677 | 0.557 | 0.416 | 0.268 | 0.139 | 0.052 | 0.012 | 0.001 | 0 | 0 | 0 |
| 0.77149999999997 | 0.771 | 0.678 | 0.558 | 0.417 | 0.269 | 0.139 | 0.052 | 0.012 | 0.001 | 0 | 0 | 0 |
| 0.77199999999997 | 0.772 | 0.678 | 0.559 | 0.418 | 0.27 | 0.14 | 0.052 | 0.012 | 0.001 | 0 | 0 | 0 |
| 0.77249999999997 | 0.772 | 0.679 | 0.559 | 0.418 | 0.271 | 0.141 | 0.053 | 0.012 | 0.001 | 0 | 0 | 0 |
| 0.77299999999997 | 0.773 | 0.68 | 0.56 | 0.419 | 0.272 | 0.142 | 0.053 | 0.012 | 0.001 | 0 | 0 | 0 |
| 0.77349999999997 | 0.773 | 0.68 | 0.561 | 0.42 | 0.272 | 0.142 | 0.054 | 0.012 | 0.001 | 0 | 0 | 0 |
| 0.77399999999997 | 0.774 | 0.681 | 0.562 | 0.421 | 0.273 | 0.143 | 0.054 | 0.013 | 0.001 | 0 | 0 | 0 |
| 0.77449999999997 | 0.774 | 0.682 | 0.563 | 0.422 | 0.274 | 0.144 | 0.054 | 0.013 | 0.001 | 0 | 0 | 0 |
| 0.77499999999997 | 0.775 | 0.682 | 0.564 | 0.423 | 0.275 | 0.144 | 0.055 | 0.013 | 0.001 | 0 | 0 | 0 |
| 0.77549999999997 | 0.775 | 0.683 | 0.564 | 0.424 | 0.276 | 0.145 | 0.055 | 0.013 | 0.001 | 0 | 0 | 0 |
| 0.77599999999997 | 0.776 | 0.684 | 0.565 | 0.425 | 0.277 | 0.146 | 0.056 | 0.013 | 0.002 | 0 | 0 | 0 |
| 0.77649999999997 | 0.776 | 0.684 | 0.566 | 0.426 | 0.278 | 0.146 | 0.056 | 0.013 | 0.002 | 0 | 0 | 0 |
| 0.77699999999997 | 0.777 | 0.685 | 0.567 | 0.427 | 0.279 | 0.147 | 0.056 | 0.013 | 0.002 | 0 | 0 | 0 |
| 0.77749999999997 | 0.777 | 0.686 | 0.568 | 0.428 | 0.28 | 0.148 | 0.057 | 0.014 | 0.002 | 0 | 0 | 0 |
| 0.77799999999997 | 0.778 | 0.686 | 0.568 | 0.429 | 0.281 | 0.149 | 0.057 | 0.014 | 0.002 | 0 | 0 | 0 |
| 0.77849999999997 | 0.778 | 0.687 | 0.569 | 0.43 | 0.282 | 0.149 | 0.058 | 0.014 | 0.002 | 0 | 0 | 0 |
| 0.77899999999997 | 0.779 | 0.688 | 0.57 | 0.43 | 0.282 | 0.15 | 0.058 | 0.014 | 0.002 | 0 | 0 | 0 |
| 0.779499999999969 | 0.779 | 0.688 | 0.571 | 0.431 | 0.283 | 0.151 | 0.059 | 0.014 | 0.002 | 0 | 0 | 0 |
| 0.779999999999969 | 0.78 | 0.689 | 0.572 | 0.432 | 0.284 | 0.152 | 0.059 | 0.014 | 0.002 | 0 | 0 | 0 |
| 0.780499999999969 | 0.78 | 0.69 | 0.573 | 0.433 | 0.285 | 0.152 | 0.059 | 0.014 | 0.002 | 0 | 0 | 0 |
| 0.780999999999969 | 0.781 | 0.69 | 0.573 | 0.434 | 0.286 | 0.153 | 0.06 | 0.015 | 0.002 | 0 | 0 | 0 |
| 0.781499999999969 | 0.781 | 0.691 | 0.574 | 0.435 | 0.287 | 0.154 | 0.06 | 0.015 | 0.002 | 0 | 0 | 0 |
| 0.781999999999969 | 0.782 | 0.692 | 0.575 | 0.436 | 0.288 | 0.155 | 0.061 | 0.015 | 0.002 | 0 | 0 | 0 |
| 0.782499999999969 | 0.782 | 0.692 | 0.576 | 0.437 | 0.289 | 0.155 | 0.061 | 0.015 | 0.002 | 0 | 0 | 0 |
| 0.782999999999969 | 0.783 | 0.693 | 0.577 | 0.438 | 0.29 | 0.156 | 0.062 | 0.015 | 0.002 | 0 | 0 | 0 |
| 0.783499999999969 | 0.783 | 0.694 | 0.578 | 0.439 | 0.291 | 0.157 | 0.062 | 0.015 | 0.002 | 0 | 0 | 0 |
| 0.783999999999969 | 0.784 | 0.694 | 0.578 | 0.44 | 0.292 | 0.158 | 0.063 | 0.016 | 0.002 | 0 | 0 | 0 |
| 0.784499999999969 | 0.784 | 0.695 | 0.579 | 0.441 | 0.293 | 0.158 | 0.063 | 0.016 | 0.002 | 0 | 0 | 0 |
| 0.784999999999969 | 0.785 | 0.696 | 0.58 | 0.442 | 0.294 | 0.159 | 0.063 | 0.016 | 0.002 | 0 | 0 | 0 |
| 0.785499999999969 | 0.785 | 0.696 | 0.581 | 0.443 | 0.295 | 0.16 | 0.064 | 0.016 | 0.002 | 0 | 0 | 0 |
| 0.785999999999969 | 0.786 | 0.697 | 0.582 | 0.444 | 0.296 | 0.161 | 0.064 | 0.016 | 0.002 | 0 | 0 | 0 |
| 0.786499999999969 | 0.786 | 0.698 | 0.583 | 0.445 | 0.296 | 0.161 | 0.065 | 0.017 | 0.002 | 0 | 0 | 0 |
| 0.786999999999969 | 0.787 | 0.698 | 0.583 | 0.446 | 0.297 | 0.162 | 0.065 | 0.017 | 0.002 | 0 | 0 | 0 |
| 0.787499999999969 | 0.787 | 0.699 | 0.584 | 0.447 | 0.298 | 0.163 | 0.066 | 0.017 | 0.002 | 0 | 0 | 0 |
| 0.787999999999969 | 0.788 | 0.7 | 0.585 | 0.447 | 0.299 | 0.164 | 0.066 | 0.017 | 0.002 | 0 | 0 | 0 |
| 0.788499999999968 | 0.788 | 0.7 | 0.586 | 0.448 | 0.3 | 0.165 | 0.067 | 0.017 | 0.002 | 0 | 0 | 0 |
| 0.788999999999968 | 0.789 | 0.701 | 0.587 | 0.449 | 0.301 | 0.165 | 0.067 | 0.017 | 0.002 | 0 | 0 | 0 |
| 0.789499999999968 | 0.789 | 0.702 | 0.588 | 0.45 | 0.302 | 0.166 | 0.068 | 0.018 | 0.002 | 0 | 0 | 0 |
| 0.789999999999968 | 0.79 | 0.702 | 0.588 | 0.451 | 0.303 | 0.167 | 0.068 | 0.018 | 0.002 | 0 | 0 | 0 |
| 0.790499999999968 | 0.79 | 0.703 | 0.589 | 0.452 | 0.304 | 0.168 | 0.069 | 0.018 | 0.002 | 0 | 0 | 0 |
| 0.790999999999968 | 0.791 | 0.704 | 0.59 | 0.453 | 0.305 | 0.169 | 0.069 | 0.018 | 0.002 | 0 | 0 | 0 |
| 0.791499999999968 | 0.791 | 0.704 | 0.591 | 0.454 | 0.306 | 0.169 | 0.07 | 0.018 | 0.002 | 0 | 0 | 0 |
| 0.791999999999968 | 0.792 | 0.705 | 0.592 | 0.455 | 0.307 | 0.17 | 0.07 | 0.019 | 0.003 | 0 | 0 | 0 |
| 0.792499999999968 | 0.792 | 0.706 | 0.593 | 0.456 | 0.308 | 0.171 | 0.071 | 0.019 | 0.003 | 0 | 0 | 0 |
| 0.792999999999968 | 0.793 | 0.706 | 0.593 | 0.457 | 0.309 | 0.172 | 0.071 | 0.019 | 0.003 | 0 | 0 | 0 |
| 0.793499999999968 | 0.793 | 0.707 | 0.594 | 0.458 | 0.31 | 0.173 | 0.072 | 0.019 | 0.003 | 0 | 0 | 0 |
| 0.793999999999968 | 0.794 | 0.708 | 0.595 | 0.459 | 0.311 | 0.173 | 0.072 | 0.019 | 0.003 | 0 | 0 | 0 |
| 0.794499999999968 | 0.794 | 0.708 | 0.596 | 0.46 | 0.312 | 0.174 | 0.073 | 0.02 | 0.003 | 0 | 0 | 0 |
| 0.794999999999968 | 0.795 | 0.709 | 0.597 | 0.461 | 0.313 | 0.175 | 0.073 | 0.02 | 0.003 | 0 | 0 | 0 |
| 0.795499999999968 | 0.795 | 0.71 | 0.598 | 0.462 | 0.314 | 0.176 | 0.074 | 0.02 | 0.003 | 0 | 0 | 0 |
| 0.795999999999968 | 0.796 | 0.71 | 0.598 | 0.463 | 0.315 | 0.177 | 0.074 | 0.02 | 0.003 | 0 | 0 | 0 |
| 0.796499999999968 | 0.796 | 0.711 | 0.599 | 0.464 | 0.316 | 0.178 | 0.075 | 0.02 | 0.003 | 0 | 0 | 0 |
| 0.796999999999968 | 0.797 | 0.712 | 0.6 | 0.465 | 0.317 | 0.179 | 0.075 | 0.021 | 0.003 | 0 | 0 | 0 |
| 0.797499999999967 | 0.797 | 0.712 | 0.601 | 0.466 | 0.318 | 0.179 | 0.076 | 0.021 | 0.003 | 0 | 0 | 0 |
| 0.797999999999967 | 0.798 | 0.713 | 0.602 | 0.467 | 0.319 | 0.18 | 0.077 | 0.021 | 0.003 | 0 | 0 | 0 |
| 0.798499999999967 | 0.798 | 0.714 | 0.603 | 0.468 | 0.32 | 0.181 | 0.077 | 0.021 | 0.003 | 0 | 0 | 0 |
| 0.798999999999967 | 0.799 | 0.714 | 0.604 | 0.469 | 0.321 | 0.182 | 0.078 | 0.022 | 0.003 | 0 | 0 | 0 |
| 0.799499999999967 | 0.799 | 0.715 | 0.604 | 0.47 | 0.322 | 0.183 | 0.078 | 0.022 | 0.003 | 0 | 0 | 0 |
| 0.799999999999967 | 0.8 | 0.716 | 0.605 | 0.471 | 0.323 | 0.184 | 0.079 | 0.022 | 0.003 | 0 | 0 | 0 |
| 0.800499999999967 | 0.8 | 0.716 | 0.606 | 0.472 | 0.324 | 0.185 | 0.079 | 0.022 | 0.003 | 0 | 0 | 0 |
| 0.800999999999967 | 0.801 | 0.717 | 0.607 | 0.473 | 0.325 | 0.185 | 0.08 | 0.023 | 0.003 | 0 | 0 | 0 |
| 0.801499999999967 | 0.801 | 0.718 | 0.608 | 0.474 | 0.326 | 0.186 | 0.08 | 0.023 | 0.003 | 0 | 0 | 0 |
| 0.801999999999967 | 0.802 | 0.718 | 0.609 | 0.475 | 0.327 | 0.187 | 0.081 | 0.023 | 0.004 | 0 | 0 | 0 |
| 0.802499999999967 | 0.802 | 0.719 | 0.61 | 0.476 | 0.328 | 0.188 | 0.082 | 0.023 | 0.004 | 0 | 0 | 0 |
| 0.802999999999967 | 0.803 | 0.72 | 0.61 | 0.477 | 0.329 | 0.189 | 0.082 | 0.024 | 0.004 | 0 | 0 | 0 |
| 0.803499999999967 | 0.803 | 0.72 | 0.611 | 0.478 | 0.33 | 0.19 | 0.083 | 0.024 | 0.004 | 0 | 0 | 0 |
| 0.803999999999967 | 0.804 | 0.721 | 0.612 | 0.479 | 0.331 | 0.191 | 0.083 | 0.024 | 0.004 | 0 | 0 | 0 |
| 0.804499999999967 | 0.804 | 0.722 | 0.613 | 0.48 | 0.332 | 0.192 | 0.084 | 0.024 | 0.004 | 0 | 0 | 0 |
| 0.804999999999967 | 0.805 | 0.722 | 0.614 | 0.481 | 0.333 | 0.193 | 0.085 | 0.025 | 0.004 | 0 | 0 | 0 |
| 0.805499999999967 | 0.805 | 0.723 | 0.615 | 0.482 | 0.335 | 0.194 | 0.085 | 0.025 | 0.004 | 0 | 0 | 0 |
| 0.805999999999967 | 0.806 | 0.724 | 0.616 | 0.483 | 0.336 | 0.194 | 0.086 | 0.025 | 0.004 | 0 | 0 | 0 |
| 0.806499999999967 | 0.806 | 0.724 | 0.616 | 0.484 | 0.337 | 0.195 | 0.086 | 0.025 | 0.004 | 0 | 0 | 0 |
| 0.806999999999966 | 0.807 | 0.725 | 0.617 | 0.485 | 0.338 | 0.196 | 0.087 | 0.026 | 0.004 | 0 | 0 | 0 |
| 0.807499999999966 | 0.807 | 0.726 | 0.618 | 0.486 | 0.339 | 0.197 | 0.088 | 0.026 | 0.004 | 0 | 0 | 0 |
| 0.807999999999966 | 0.808 | 0.726 | 0.619 | 0.487 | 0.34 | 0.198 | 0.088 | 0.026 | 0.004 | 0 | 0 | 0 |
| 0.808499999999966 | 0.808 | 0.727 | 0.62 | 0.488 | 0.341 | 0.199 | 0.089 | 0.026 | 0.004 | 0 | 0 | 0 |
| 0.808999999999966 | 0.809 | 0.728 | 0.621 | 0.489 | 0.342 | 0.2 | 0.089 | 0.027 | 0.004 | 0 | 0 | 0 |
| 0.809499999999966 | 0.809 | 0.728 | 0.622 | 0.49 | 0.343 | 0.201 | 0.09 | 0.027 | 0.004 | 0 | 0 | 0 |
| 0.809999999999966 | 0.81 | 0.729 | 0.622 | 0.491 | 0.344 | 0.202 | 0.091 | 0.027 | 0.005 | 0 | 0 | 0 |
| 0.810499999999966 | 0.81 | 0.73 | 0.623 | 0.492 | 0.345 | 0.203 | 0.091 | 0.028 | 0.005 | 0 | 0 | 0 |
| 0.810999999999966 | 0.811 | 0.73 | 0.624 | 0.493 | 0.346 | 0.204 | 0.092 | 0.028 | 0.005 | 0 | 0 | 0 |
| 0.811499999999966 | 0.811 | 0.731 | 0.625 | 0.494 | 0.347 | 0.205 | 0.093 | 0.028 | 0.005 | 0 | 0 | 0 |
| 0.811999999999966 | 0.812 | 0.732 | 0.626 | 0.495 | 0.348 | 0.206 | 0.093 | 0.028 | 0.005 | 0 | 0 | 0 |
| 0.812499999999966 | 0.812 | 0.732 | 0.627 | 0.496 | 0.35 | 0.207 | 0.094 | 0.029 | 0.005 | 0 | 0 | 0 |
| 0.812999999999966 | 0.813 | 0.733 | 0.628 | 0.497 | 0.351 | 0.208 | 0.095 | 0.029 | 0.005 | 0 | 0 | 0 |
| 0.813499999999966 | 0.813 | 0.734 | 0.628 | 0.498 | 0.352 | 0.209 | 0.095 | 0.029 | 0.005 | 0 | 0 | 0 |
| 0.813999999999966 | 0.814 | 0.734 | 0.629 | 0.499 | 0.353 | 0.21 | 0.096 | 0.03 | 0.005 | 0 | 0 | 0 |
| 0.814499999999966 | 0.814 | 0.735 | 0.63 | 0.5 | 0.354 | 0.211 | 0.097 | 0.03 | 0.005 | 0 | 0 | 0 |
| 0.814999999999966 | 0.815 | 0.736 | 0.631 | 0.501 | 0.355 | 0.212 | 0.097 | 0.03 | 0.005 | 0 | 0 | 0 |
| 0.815499999999966 | 0.815 | 0.736 | 0.632 | 0.502 | 0.356 | 0.213 | 0.098 | 0.031 | 0.005 | 0 | 0 | 0 |
| 0.815999999999965 | 0.816 | 0.737 | 0.633 | 0.503 | 0.357 | 0.213 | 0.099 | 0.031 | 0.005 | 0 | 0 | 0 |
| 0.816499999999965 | 0.816 | 0.738 | 0.634 | 0.504 | 0.358 | 0.214 | 0.099 | 0.031 | 0.006 | 0 | 0 | 0 |
| 0.816999999999965 | 0.817 | 0.738 | 0.635 | 0.506 | 0.359 | 0.215 | 0.1 | 0.032 | 0.006 | 0 | 0 | 0 |
| 0.817499999999965 | 0.817 | 0.739 | 0.635 | 0.507 | 0.361 | 0.216 | 0.101 | 0.032 | 0.006 | 0 | 0 | 0 |
| 0.817999999999965 | 0.818 | 0.74 | 0.636 | 0.508 | 0.362 | 0.218 | 0.101 | 0.032 | 0.006 | 0 | 0 | 0 |
| 0.818499999999965 | 0.818 | 0.741 | 0.637 | 0.509 | 0.363 | 0.219 | 0.102 | 0.033 | 0.006 | 0 | 0 | 0 |
| 0.818999999999965 | 0.819 | 0.741 | 0.638 | 0.51 | 0.364 | 0.22 | 0.103 | 0.033 | 0.006 | 0 | 0 | 0 |
| 0.819499999999965 | 0.819 | 0.742 | 0.639 | 0.511 | 0.365 | 0.221 | 0.104 | 0.033 | 0.006 | 0 | 0 | 0 |
| 0.819999999999965 | 0.82 | 0.743 | 0.64 | 0.512 | 0.366 | 0.222 | 0.104 | 0.034 | 0.006 | 0 | 0 | 0 |
| 0.820499999999965 | 0.82 | 0.743 | 0.641 | 0.513 | 0.367 | 0.223 | 0.105 | 0.034 | 0.006 | 0 | 0 | 0 |
| 0.820999999999965 | 0.821 | 0.744 | 0.642 | 0.514 | 0.368 | 0.224 | 0.106 | 0.034 | 0.006 | 0.001 | 0 | 0 |
| 0.821499999999965 | 0.821 | 0.745 | 0.642 | 0.515 | 0.37 | 0.225 | 0.106 | 0.035 | 0.006 | 0.001 | 0 | 0 |
| 0.821999999999965 | 0.822 | 0.745 | 0.643 | 0.516 | 0.371 | 0.226 | 0.107 | 0.035 | 0.007 | 0.001 | 0 | 0 |
| 0.822499999999965 | 0.822 | 0.746 | 0.644 | 0.517 | 0.372 | 0.227 | 0.108 | 0.035 | 0.007 | 0.001 | 0 | 0 |
| 0.822999999999965 | 0.823 | 0.747 | 0.645 | 0.518 | 0.373 | 0.228 | 0.109 | 0.036 | 0.007 | 0.001 | 0 | 0 |
| 0.823499999999965 | 0.823 | 0.747 | 0.646 | 0.519 | 0.374 | 0.229 | 0.109 | 0.036 | 0.007 | 0.001 | 0 | 0 |
| 0.823999999999965 | 0.824 | 0.748 | 0.647 | 0.52 | 0.375 | 0.23 | 0.11 | 0.037 | 0.007 | 0.001 | 0 | 0 |
| 0.824499999999965 | 0.824 | 0.749 | 0.648 | 0.521 | 0.376 | 0.231 | 0.111 | 0.037 | 0.007 | 0.001 | 0 | 0 |
| 0.824999999999964 | 0.825 | 0.749 | 0.649 | 0.522 | 0.378 | 0.232 | 0.112 | 0.037 | 0.007 | 0.001 | 0 | 0 |
| 0.825499999999964 | 0.825 | 0.75 | 0.65 | 0.524 | 0.379 | 0.233 | 0.113 | 0.038 | 0.007 | 0.001 | 0 | 0 |
| 0.825999999999964 | 0.826 | 0.751 | 0.65 | 0.525 | 0.38 | 0.234 | 0.113 | 0.038 | 0.007 | 0.001 | 0 | 0 |
| 0.826499999999964 | 0.826 | 0.751 | 0.651 | 0.526 | 0.381 | 0.235 | 0.114 | 0.039 | 0.008 | 0.001 | 0 | 0 |
| 0.826999999999964 | 0.827 | 0.752 | 0.652 | 0.527 | 0.382 | 0.236 | 0.115 | 0.039 | 0.008 | 0.001 | 0 | 0 |
| 0.827499999999964 | 0.827 | 0.753 | 0.653 | 0.528 | 0.383 | 0.237 | 0.116 | 0.039 | 0.008 | 0.001 | 0 | 0 |
| 0.827999999999964 | 0.828 | 0.753 | 0.654 | 0.529 | 0.385 | 0.239 | 0.116 | 0.04 | 0.008 | 0.001 | 0 | 0 |
| 0.828499999999964 | 0.828 | 0.754 | 0.655 | 0.53 | 0.386 | 0.24 | 0.117 | 0.04 | 0.008 | 0.001 | 0 | 0 |
| 0.828999999999964 | 0.829 | 0.755 | 0.656 | 0.531 | 0.387 | 0.241 | 0.118 | 0.041 | 0.008 | 0.001 | 0 | 0 |
| 0.829499999999964 | 0.829 | 0.755 | 0.657 | 0.532 | 0.388 | 0.242 | 0.119 | 0.041 | 0.008 | 0.001 | 0 | 0 |
| 0.829999999999964 | 0.83 | 0.756 | 0.658 | 0.533 | 0.389 | 0.243 | 0.12 | 0.041 | 0.008 | 0.001 | 0 | 0 |
| 0.830499999999964 | 0.83 | 0.757 | 0.658 | 0.534 | 0.391 | 0.244 | 0.121 | 0.042 | 0.009 | 0.001 | 0 | 0 |
| 0.830999999999964 | 0.831 | 0.758 | 0.659 | 0.535 | 0.392 | 0.245 | 0.121 | 0.042 | 0.009 | 0.001 | 0 | 0 |
| 0.831499999999964 | 0.831 | 0.758 | 0.66 | 0.536 | 0.393 | 0.246 | 0.122 | 0.043 | 0.009 | 0.001 | 0 | 0 |
| 0.831999999999964 | 0.832 | 0.759 | 0.661 | 0.538 | 0.394 | 0.247 | 0.123 | 0.043 | 0.009 | 0.001 | 0 | 0 |
| 0.832499999999964 | 0.832 | 0.76 | 0.662 | 0.539 | 0.395 | 0.249 | 0.124 | 0.044 | 0.009 | 0.001 | 0 | 0 |
| 0.832999999999964 | 0.833 | 0.76 | 0.663 | 0.54 | 0.397 | 0.25 | 0.125 | 0.044 | 0.009 | 0.001 | 0 | 0 |
| 0.833499999999964 | 0.833 | 0.761 | 0.664 | 0.541 | 0.398 | 0.251 | 0.126 | 0.045 | 0.009 | 0.001 | 0 | 0 |
| 0.833999999999963 | 0.834 | 0.762 | 0.665 | 0.542 | 0.399 | 0.252 | 0.126 | 0.045 | 0.01 | 0.001 | 0 | 0 |
| 0.834499999999963 | 0.834 | 0.762 | 0.666 | 0.543 | 0.4 | 0.253 | 0.127 | 0.045 | 0.01 | 0.001 | 0 | 0 |
| 0.834999999999963 | 0.835 | 0.763 | 0.666 | 0.544 | 0.401 | 0.254 | 0.128 | 0.046 | 0.01 | 0.001 | 0 | 0 |
| 0.835499999999963 | 0.835 | 0.764 | 0.667 | 0.545 | 0.403 | 0.255 | 0.129 | 0.046 | 0.01 | 0.001 | 0 | 0 |
| 0.835999999999963 | 0.836 | 0.764 | 0.668 | 0.546 | 0.404 | 0.257 | 0.13 | 0.047 | 0.01 | 0.001 | 0 | 0 |
| 0.836499999999963 | 0.836 | 0.765 | 0.669 | 0.547 | 0.405 | 0.258 | 0.131 | 0.047 | 0.01 | 0.001 | 0 | 0 |
| 0.836999999999963 | 0.837 | 0.766 | 0.67 | 0.549 | 0.406 | 0.259 | 0.132 | 0.048 | 0.01 | 0.001 | 0 | 0 |
| 0.837499999999963 | 0.837 | 0.766 | 0.671 | 0.55 | 0.407 | 0.26 | 0.133 | 0.048 | 0.011 | 0.001 | 0 | 0 |
| 0.837999999999963 | 0.838 | 0.767 | 0.672 | 0.551 | 0.409 | 0.261 | 0.134 | 0.049 | 0.011 | 0.001 | 0 | 0 |
| 0.838499999999963 | 0.838 | 0.768 | 0.673 | 0.552 | 0.41 | 0.262 | 0.134 | 0.049 | 0.011 | 0.001 | 0 | 0 |
| 0.838999999999963 | 0.839 | 0.768 | 0.674 | 0.553 | 0.411 | 0.264 | 0.135 | 0.05 | 0.011 | 0.001 | 0 | 0 |
| 0.839499999999963 | 0.839 | 0.769 | 0.675 | 0.554 | 0.412 | 0.265 | 0.136 | 0.05 | 0.011 | 0.001 | 0 | 0 |
| 0.839999999999963 | 0.84 | 0.77 | 0.676 | 0.555 | 0.414 | 0.266 | 0.137 | 0.051 | 0.011 | 0.001 | 0 | 0 |
| 0.840499999999963 | 0.84 | 0.771 | 0.676 | 0.556 | 0.415 | 0.267 | 0.138 | 0.051 | 0.012 | 0.001 | 0 | 0 |
| 0.840999999999963 | 0.841 | 0.771 | 0.677 | 0.557 | 0.416 | 0.268 | 0.139 | 0.052 | 0.012 | 0.001 | 0 | 0 |
| 0.841499999999963 | 0.841 | 0.772 | 0.678 | 0.559 | 0.417 | 0.27 | 0.14 | 0.052 | 0.012 | 0.001 | 0 | 0 |
| 0.841999999999963 | 0.842 | 0.773 | 0.679 | 0.56 | 0.419 | 0.271 | 0.141 | 0.053 | 0.012 | 0.001 | 0 | 0 |
| 0.842499999999963 | 0.842 | 0.773 | 0.68 | 0.561 | 0.42 | 0.272 | 0.142 | 0.053 | 0.012 | 0.001 | 0 | 0 |
| 0.842999999999963 | 0.843 | 0.774 | 0.681 | 0.562 | 0.421 | 0.273 | 0.143 | 0.054 | 0.013 | 0.001 | 0 | 0 |
| 0.843499999999962 | 0.843 | 0.775 | 0.682 | 0.563 | 0.422 | 0.275 | 0.144 | 0.055 | 0.013 | 0.001 | 0 | 0 |
| 0.843999999999962 | 0.844 | 0.775 | 0.683 | 0.564 | 0.424 | 0.276 | 0.145 | 0.055 | 0.013 | 0.001 | 0 | 0 |
| 0.844499999999962 | 0.844 | 0.776 | 0.684 | 0.565 | 0.425 | 0.277 | 0.146 | 0.056 | 0.013 | 0.002 | 0 | 0 |
| 0.844999999999962 | 0.845 | 0.777 | 0.685 | 0.566 | 0.426 | 0.278 | 0.147 | 0.056 | 0.013 | 0.002 | 0 | 0 |
| 0.845499999999962 | 0.845 | 0.777 | 0.685 | 0.568 | 0.428 | 0.28 | 0.148 | 0.057 | 0.014 | 0.002 | 0 | 0 |
| 0.845999999999962 | 0.846 | 0.778 | 0.686 | 0.569 | 0.429 | 0.281 | 0.149 | 0.057 | 0.014 | 0.002 | 0 | 0 |
| 0.846499999999962 | 0.846 | 0.779 | 0.687 | 0.57 | 0.43 | 0.282 | 0.15 | 0.058 | 0.014 | 0.002 | 0 | 0 |
| 0.846999999999962 | 0.847 | 0.78 | 0.688 | 0.571 | 0.431 | 0.283 | 0.151 | 0.059 | 0.014 | 0.002 | 0 | 0 |
| 0.847499999999962 | 0.847 | 0.78 | 0.689 | 0.572 | 0.433 | 0.285 | 0.152 | 0.059 | 0.014 | 0.002 | 0 | 0 |
| 0.847999999999962 | 0.848 | 0.781 | 0.69 | 0.573 | 0.434 | 0.286 | 0.153 | 0.06 | 0.015 | 0.002 | 0 | 0 |
| 0.848499999999962 | 0.848 | 0.782 | 0.691 | 0.574 | 0.435 | 0.287 | 0.154 | 0.06 | 0.015 | 0.002 | 0 | 0 |
| 0.848999999999962 | 0.849 | 0.782 | 0.692 | 0.576 | 0.437 | 0.288 | 0.155 | 0.061 | 0.015 | 0.002 | 0 | 0 |
| 0.849499999999962 | 0.849 | 0.783 | 0.693 | 0.577 | 0.438 | 0.29 | 0.156 | 0.062 | 0.015 | 0.002 | 0 | 0 |
| 0.849999999999962 | 0.85 | 0.784 | 0.694 | 0.578 | 0.439 | 0.291 | 0.157 | 0.062 | 0.016 | 0.002 | 0 | 0 |
| 0.850499999999962 | 0.85 | 0.784 | 0.695 | 0.579 | 0.441 | 0.292 | 0.158 | 0.063 | 0.016 | 0.002 | 0 | 0 |
| 0.850999999999962 | 0.851 | 0.785 | 0.696 | 0.58 | 0.442 | 0.294 | 0.159 | 0.064 | 0.016 | 0.002 | 0 | 0 |
| 0.851499999999962 | 0.851 | 0.786 | 0.696 | 0.581 | 0.443 | 0.295 | 0.16 | 0.064 | 0.016 | 0.002 | 0 | 0 |
| 0.851999999999962 | 0.852 | 0.786 | 0.697 | 0.582 | 0.444 | 0.296 | 0.161 | 0.065 | 0.016 | 0.002 | 0 | 0 |
| 0.852499999999961 | 0.852 | 0.787 | 0.698 | 0.584 | 0.446 | 0.298 | 0.162 | 0.065 | 0.017 | 0.002 | 0 | 0 |
| 0.852999999999961 | 0.853 | 0.788 | 0.699 | 0.585 | 0.447 | 0.299 | 0.163 | 0.066 | 0.017 | 0.002 | 0 | 0 |
| 0.853499999999961 | 0.853 | 0.789 | 0.7 | 0.586 | 0.448 | 0.3 | 0.165 | 0.067 | 0.017 | 0.002 | 0 | 0 |
| 0.853999999999961 | 0.854 | 0.789 | 0.701 | 0.587 | 0.45 | 0.302 | 0.166 | 0.067 | 0.018 | 0.002 | 0 | 0 |
| 0.854499999999961 | 0.854 | 0.79 | 0.702 | 0.588 | 0.451 | 0.303 | 0.167 | 0.068 | 0.018 | 0.002 | 0 | 0 |
| 0.854999999999961 | 0.855 | 0.791 | 0.703 | 0.589 | 0.452 | 0.304 | 0.168 | 0.069 | 0.018 | 0.002 | 0 | 0 |
| 0.855499999999961 | 0.855 | 0.791 | 0.704 | 0.591 | 0.454 | 0.306 | 0.169 | 0.069 | 0.018 | 0.002 | 0 | 0 |
| 0.855999999999961 | 0.856 | 0.792 | 0.705 | 0.592 | 0.455 | 0.307 | 0.17 | 0.07 | 0.019 | 0.003 | 0 | 0 |
| 0.856499999999961 | 0.856 | 0.793 | 0.706 | 0.593 | 0.456 | 0.308 | 0.171 | 0.071 | 0.019 | 0.003 | 0 | 0 |
| 0.856999999999961 | 0.857 | 0.793 | 0.707 | 0.594 | 0.458 | 0.31 | 0.172 | 0.072 | 0.019 | 0.003 | 0 | 0 |
| 0.857499999999961 | 0.857 | 0.794 | 0.708 | 0.595 | 0.459 | 0.311 | 0.174 | 0.072 | 0.019 | 0.003 | 0 | 0 |
| 0.857999999999961 | 0.858 | 0.795 | 0.709 | 0.596 | 0.461 | 0.313 | 0.175 | 0.073 | 0.02 | 0.003 | 0 | 0 |
| 0.858499999999961 | 0.858 | 0.795 | 0.709 | 0.598 | 0.462 | 0.314 | 0.176 | 0.074 | 0.02 | 0.003 | 0 | 0 |
| 0.858999999999961 | 0.859 | 0.796 | 0.71 | 0.599 | 0.463 | 0.315 | 0.177 | 0.075 | 0.02 | 0.003 | 0 | 0 |
| 0.859499999999961 | 0.859 | 0.797 | 0.711 | 0.6 | 0.465 | 0.317 | 0.178 | 0.075 | 0.021 | 0.003 | 0 | 0 |
| 0.859999999999961 | 0.86 | 0.798 | 0.712 | 0.601 | 0.466 | 0.318 | 0.179 | 0.076 | 0.021 | 0.003 | 0 | 0 |
| 0.860499999999961 | 0.86 | 0.798 | 0.713 | 0.602 | 0.467 | 0.32 | 0.181 | 0.077 | 0.021 | 0.003 | 0 | 0 |
| 0.860999999999961 | 0.861 | 0.799 | 0.714 | 0.603 | 0.469 | 0.321 | 0.182 | 0.078 | 0.022 | 0.003 | 0 | 0 |
| 0.86149999999996 | 0.861 | 0.8 | 0.715 | 0.605 | 0.47 | 0.322 | 0.183 | 0.078 | 0.022 | 0.003 | 0 | 0 |
| 0.86199999999996 | 0.862 | 0.8 | 0.716 | 0.606 | 0.472 | 0.324 | 0.184 | 0.079 | 0.022 | 0.003 | 0 | 0 |
| 0.86249999999996 | 0.862 | 0.801 | 0.717 | 0.607 | 0.473 | 0.325 | 0.185 | 0.08 | 0.023 | 0.003 | 0 | 0 |
| 0.86299999999996 | 0.863 | 0.802 | 0.718 | 0.608 | 0.474 | 0.327 | 0.187 | 0.081 | 0.023 | 0.003 | 0 | 0 |
| 0.86349999999996 | 0.863 | 0.802 | 0.719 | 0.609 | 0.476 | 0.328 | 0.188 | 0.081 | 0.023 | 0.004 | 0 | 0 |
| 0.86399999999996 | 0.864 | 0.803 | 0.72 | 0.611 | 0.477 | 0.33 | 0.189 | 0.082 | 0.024 | 0.004 | 0 | 0 |
| 0.86449999999996 | 0.864 | 0.804 | 0.721 | 0.612 | 0.478 | 0.331 | 0.19 | 0.083 | 0.024 | 0.004 | 0 | 0 |
| 0.86499999999996 | 0.865 | 0.804 | 0.722 | 0.613 | 0.48 | 0.332 | 0.192 | 0.084 | 0.024 | 0.004 | 0 | 0 |
| 0.86549999999996 | 0.865 | 0.805 | 0.723 | 0.614 | 0.481 | 0.334 | 0.193 | 0.085 | 0.025 | 0.004 | 0 | 0 |
| 0.86599999999996 | 0.866 | 0.806 | 0.723 | 0.615 | 0.483 | 0.335 | 0.194 | 0.086 | 0.025 | 0.004 | 0 | 0 |
| 0.86649999999996 | 0.866 | 0.807 | 0.724 | 0.617 | 0.484 | 0.337 | 0.195 | 0.086 | 0.025 | 0.004 | 0 | 0 |
| 0.86699999999996 | 0.867 | 0.807 | 0.725 | 0.618 | 0.486 | 0.338 | 0.197 | 0.087 | 0.026 | 0.004 | 0 | 0 |
| 0.86749999999996 | 0.867 | 0.808 | 0.726 | 0.619 | 0.487 | 0.34 | 0.198 | 0.088 | 0.026 | 0.004 | 0 | 0 |
| 0.86799999999996 | 0.868 | 0.809 | 0.727 | 0.62 | 0.488 | 0.341 | 0.199 | 0.089 | 0.027 | 0.004 | 0 | 0 |
| 0.86849999999996 | 0.868 | 0.809 | 0.728 | 0.621 | 0.49 | 0.343 | 0.201 | 0.09 | 0.027 | 0.004 | 0 | 0 |
| 0.86899999999996 | 0.869 | 0.81 | 0.729 | 0.623 | 0.491 | 0.344 | 0.202 | 0.091 | 0.027 | 0.005 | 0 | 0 |
| 0.86949999999996 | 0.869 | 0.811 | 0.73 | 0.624 | 0.493 | 0.346 | 0.203 | 0.092 | 0.028 | 0.005 | 0 | 0 |
| 0.86999999999996 | 0.87 | 0.811 | 0.731 | 0.625 | 0.494 | 0.347 | 0.205 | 0.093 | 0.028 | 0.005 | 0 | 0 |
| 0.870499999999959 | 0.87 | 0.812 | 0.732 | 0.626 | 0.496 | 0.349 | 0.206 | 0.094 | 0.029 | 0.005 | 0 | 0 |
| 0.870999999999959 | 0.871 | 0.813 | 0.733 | 0.627 | 0.497 | 0.35 | 0.207 | 0.094 | 0.029 | 0.005 | 0 | 0 |
| 0.871499999999959 | 0.871 | 0.814 | 0.734 | 0.629 | 0.498 | 0.352 | 0.209 | 0.095 | 0.029 | 0.005 | 0 | 0 |
| 0.871999999999959 | 0.872 | 0.814 | 0.735 | 0.63 | 0.5 | 0.353 | 0.21 | 0.096 | 0.03 | 0.005 | 0 | 0 |
| 0.872499999999959 | 0.872 | 0.815 | 0.736 | 0.631 | 0.501 | 0.355 | 0.211 | 0.097 | 0.03 | 0.005 | 0 | 0 |
| 0.872999999999959 | 0.873 | 0.816 | 0.737 | 0.632 | 0.503 | 0.357 | 0.213 | 0.098 | 0.031 | 0.005 | 0 | 0 |
| 0.873499999999959 | 0.873 | 0.816 | 0.738 | 0.634 | 0.504 | 0.358 | 0.214 | 0.099 | 0.031 | 0.006 | 0 | 0 |
| 0.873999999999959 | 0.874 | 0.817 | 0.739 | 0.635 | 0.506 | 0.36 | 0.216 | 0.1 | 0.032 | 0.006 | 0 | 0 |
| 0.874499999999959 | 0.874 | 0.818 | 0.74 | 0.636 | 0.507 | 0.361 | 0.217 | 0.101 | 0.032 | 0.006 | 0 | 0 |
| 0.874999999999959 | 0.875 | 0.818 | 0.74 | 0.637 | 0.509 | 0.363 | 0.218 | 0.102 | 0.033 | 0.006 | 0 | 0 |
| 0.875499999999959 | 0.875 | 0.819 | 0.741 | 0.638 | 0.51 | 0.364 | 0.22 | 0.103 | 0.033 | 0.006 | 0 | 0 |
| 0.875999999999959 | 0.876 | 0.82 | 0.742 | 0.64 | 0.512 | 0.366 | 0.221 | 0.104 | 0.034 | 0.006 | 0 | 0 |
| 0.876499999999959 | 0.876 | 0.821 | 0.743 | 0.641 | 0.513 | 0.368 | 0.223 | 0.105 | 0.034 | 0.006 | 0 | 0 |
| 0.876999999999959 | 0.877 | 0.821 | 0.744 | 0.642 | 0.515 | 0.369 | 0.224 | 0.106 | 0.035 | 0.006 | 0.001 | 0 |
| 0.877499999999959 | 0.877 | 0.822 | 0.745 | 0.643 | 0.516 | 0.371 | 0.226 | 0.107 | 0.035 | 0.007 | 0.001 | 0 |
| 0.877999999999959 | 0.878 | 0.823 | 0.746 | 0.645 | 0.518 | 0.372 | 0.227 | 0.108 | 0.036 | 0.007 | 0.001 | 0 |
| 0.878499999999959 | 0.878 | 0.823 | 0.747 | 0.646 | 0.519 | 0.374 | 0.229 | 0.109 | 0.036 | 0.007 | 0.001 | 0 |
| 0.878999999999959 | 0.879 | 0.824 | 0.748 | 0.647 | 0.521 | 0.376 | 0.23 | 0.11 | 0.037 | 0.007 | 0.001 | 0 |
| 0.879499999999958 | 0.879 | 0.825 | 0.749 | 0.648 | 0.522 | 0.377 | 0.232 | 0.111 | 0.037 | 0.007 | 0.001 | 0 |
| 0.879999999999958 | 0.88 | 0.826 | 0.75 | 0.65 | 0.524 | 0.379 | 0.233 | 0.113 | 0.038 | 0.007 | 0.001 | 0 |
| 0.880499999999958 | 0.88 | 0.826 | 0.751 | 0.651 | 0.525 | 0.38 | 0.235 | 0.114 | 0.038 | 0.008 | 0.001 | 0 |
| 0.880999999999958 | 0.881 | 0.827 | 0.752 | 0.652 | 0.527 | 0.382 | 0.236 | 0.115 | 0.039 | 0.008 | 0.001 | 0 |
| 0.881499999999958 | 0.881 | 0.828 | 0.753 | 0.653 | 0.528 | 0.384 | 0.238 | 0.116 | 0.039 | 0.008 | 0.001 | 0 |
| 0.881999999999958 | 0.882 | 0.828 | 0.754 | 0.655 | 0.53 | 0.385 | 0.239 | 0.117 | 0.04 | 0.008 | 0.001 | 0 |
| 0.882499999999958 | 0.882 | 0.829 | 0.755 | 0.656 | 0.531 | 0.387 | 0.241 | 0.118 | 0.041 | 0.008 | 0.001 | 0 |
| 0.882999999999958 | 0.883 | 0.83 | 0.756 | 0.657 | 0.533 | 0.389 | 0.242 | 0.119 | 0.041 | 0.008 | 0.001 | 0 |
| 0.883499999999958 | 0.883 | 0.83 | 0.757 | 0.658 | 0.534 | 0.39 | 0.244 | 0.12 | 0.042 | 0.009 | 0.001 | 0 |
| 0.883999999999958 | 0.884 | 0.831 | 0.758 | 0.66 | 0.536 | 0.392 | 0.246 | 0.122 | 0.042 | 0.009 | 0.001 | 0 |
| 0.884499999999958 | 0.884 | 0.832 | 0.759 | 0.661 | 0.537 | 0.394 | 0.247 | 0.123 | 0.043 | 0.009 | 0.001 | 0 |
| 0.884999999999958 | 0.885 | 0.833 | 0.76 | 0.662 | 0.539 | 0.395 | 0.249 | 0.124 | 0.044 | 0.009 | 0.001 | 0 |
| 0.885499999999958 | 0.885 | 0.833 | 0.761 | 0.663 | 0.54 | 0.397 | 0.25 | 0.125 | 0.044 | 0.009 | 0.001 | 0 |
| 0.885999999999958 | 0.886 | 0.834 | 0.762 | 0.665 | 0.542 | 0.399 | 0.252 | 0.126 | 0.045 | 0.01 | 0.001 | 0 |
| 0.886499999999958 | 0.886 | 0.835 | 0.763 | 0.666 | 0.543 | 0.401 | 0.254 | 0.128 | 0.046 | 0.01 | 0.001 | 0 |
| 0.886999999999958 | 0.887 | 0.835 | 0.764 | 0.667 | 0.545 | 0.402 | 0.255 | 0.129 | 0.046 | 0.01 | 0.001 | 0 |
| 0.887499999999958 | 0.887 | 0.836 | 0.765 | 0.668 | 0.547 | 0.404 | 0.257 | 0.13 | 0.047 | 0.01 | 0.001 | 0 |
| 0.887999999999958 | 0.888 | 0.837 | 0.765 | 0.67 | 0.548 | 0.406 | 0.258 | 0.131 | 0.048 | 0.01 | 0.001 | 0 |
| 0.888499999999957 | 0.888 | 0.838 | 0.766 | 0.671 | 0.55 | 0.407 | 0.26 | 0.133 | 0.048 | 0.011 | 0.001 | 0 |
| 0.888999999999957 | 0.889 | 0.838 | 0.767 | 0.672 | 0.551 | 0.409 | 0.262 | 0.134 | 0.049 | 0.011 | 0.001 | 0 |
| 0.889499999999957 | 0.889 | 0.839 | 0.768 | 0.674 | 0.553 | 0.411 | 0.263 | 0.135 | 0.05 | 0.011 | 0.001 | 0 |
| 0.889999999999957 | 0.89 | 0.84 | 0.769 | 0.675 | 0.554 | 0.413 | 0.265 | 0.137 | 0.05 | 0.011 | 0.001 | 0 |
| 0.890499999999957 | 0.89 | 0.84 | 0.77 | 0.676 | 0.556 | 0.415 | 0.267 | 0.138 | 0.051 | 0.012 | 0.001 | 0 |
| 0.890999999999957 | 0.891 | 0.841 | 0.771 | 0.677 | 0.558 | 0.416 | 0.269 | 0.139 | 0.052 | 0.012 | 0.001 | 0 |
| 0.891499999999957 | 0.891 | 0.842 | 0.772 | 0.679 | 0.559 | 0.418 | 0.27 | 0.141 | 0.053 | 0.012 | 0.001 | 0 |
| 0.891999999999957 | 0.892 | 0.842 | 0.773 | 0.68 | 0.561 | 0.42 | 0.272 | 0.142 | 0.053 | 0.012 | 0.001 | 0 |
| 0.892499999999957 | 0.892 | 0.843 | 0.774 | 0.681 | 0.562 | 0.422 | 0.274 | 0.143 | 0.054 | 0.013 | 0.001 | 0 |
| 0.892999999999957 | 0.893 | 0.844 | 0.775 | 0.683 | 0.564 | 0.423 | 0.276 | 0.145 | 0.055 | 0.013 | 0.001 | 0 |
| 0.893499999999957 | 0.893 | 0.845 | 0.776 | 0.684 | 0.565 | 0.425 | 0.277 | 0.146 | 0.056 | 0.013 | 0.002 | 0 |
| 0.893999999999957 | 0.894 | 0.845 | 0.777 | 0.685 | 0.567 | 0.427 | 0.279 | 0.147 | 0.057 | 0.013 | 0.002 | 0 |
| 0.894499999999957 | 0.894 | 0.846 | 0.778 | 0.686 | 0.569 | 0.429 | 0.281 | 0.149 | 0.057 | 0.014 | 0.002 | 0 |
| 0.894999999999957 | 0.895 | 0.847 | 0.779 | 0.688 | 0.57 | 0.431 | 0.283 | 0.15 | 0.058 | 0.014 | 0.002 | 0 |
| 0.895499999999957 | 0.895 | 0.847 | 0.78 | 0.689 | 0.572 | 0.433 | 0.284 | 0.152 | 0.059 | 0.014 | 0.002 | 0 |
| 0.895999999999957 | 0.896 | 0.848 | 0.781 | 0.69 | 0.574 | 0.434 | 0.286 | 0.153 | 0.06 | 0.015 | 0.002 | 0 |
| 0.896499999999957 | 0.896 | 0.849 | 0.782 | 0.692 | 0.575 | 0.436 | 0.288 | 0.155 | 0.061 | 0.015 | 0.002 | 0 |
| 0.896999999999957 | 0.897 | 0.85 | 0.783 | 0.693 | 0.577 | 0.438 | 0.29 | 0.156 | 0.062 | 0.015 | 0.002 | 0 |
| 0.897499999999956 | 0.897 | 0.85 | 0.784 | 0.694 | 0.578 | 0.44 | 0.292 | 0.158 | 0.063 | 0.016 | 0.002 | 0 |
| 0.897999999999956 | 0.898 | 0.851 | 0.785 | 0.696 | 0.58 | 0.442 | 0.294 | 0.159 | 0.063 | 0.016 | 0.002 | 0 |
| 0.898499999999956 | 0.898 | 0.852 | 0.786 | 0.697 | 0.582 | 0.444 | 0.295 | 0.161 | 0.064 | 0.016 | 0.002 | 0 |
| 0.898999999999956 | 0.899 | 0.852 | 0.787 | 0.698 | 0.583 | 0.446 | 0.297 | 0.162 | 0.065 | 0.017 | 0.002 | 0 |
| 0.899499999999956 | 0.899 | 0.853 | 0.788 | 0.699 | 0.585 | 0.447 | 0.299 | 0.164 | 0.066 | 0.017 | 0.002 | 0 |
| 0.899999999999956 | 0.9 | 0.854 | 0.789 | 0.701 | 0.587 | 0.449 | 0.301 | 0.165 | 0.067 | 0.017 | 0.002 | 0 |
| 0.900499999999956 | 0.9 | 0.855 | 0.79 | 0.702 | 0.588 | 0.451 | 0.303 | 0.167 | 0.068 | 0.018 | 0.002 | 0 |
| 0.900999999999956 | 0.901 | 0.855 | 0.791 | 0.703 | 0.59 | 0.453 | 0.305 | 0.168 | 0.069 | 0.018 | 0.002 | 0 |
| 0.901499999999956 | 0.901 | 0.856 | 0.792 | 0.705 | 0.592 | 0.455 | 0.307 | 0.17 | 0.07 | 0.019 | 0.003 | 0 |
| 0.901999999999956 | 0.902 | 0.857 | 0.793 | 0.706 | 0.593 | 0.457 | 0.309 | 0.172 | 0.071 | 0.019 | 0.003 | 0 |
| 0.902499999999956 | 0.902 | 0.857 | 0.794 | 0.707 | 0.595 | 0.459 | 0.311 | 0.173 | 0.072 | 0.019 | 0.003 | 0 |
| 0.902999999999956 | 0.903 | 0.858 | 0.795 | 0.709 | 0.597 | 0.461 | 0.313 | 0.175 | 0.073 | 0.02 | 0.003 | 0 |
| 0.903499999999956 | 0.903 | 0.859 | 0.796 | 0.71 | 0.598 | 0.463 | 0.315 | 0.177 | 0.074 | 0.02 | 0.003 | 0 |
| 0.903999999999956 | 0.904 | 0.86 | 0.797 | 0.711 | 0.6 | 0.465 | 0.317 | 0.178 | 0.075 | 0.021 | 0.003 | 0 |
| 0.904499999999956 | 0.904 | 0.86 | 0.798 | 0.713 | 0.602 | 0.467 | 0.319 | 0.18 | 0.076 | 0.021 | 0.003 | 0 |
| 0.904999999999956 | 0.905 | 0.861 | 0.799 | 0.714 | 0.603 | 0.469 | 0.321 | 0.182 | 0.077 | 0.022 | 0.003 | 0 |
| 0.905499999999956 | 0.905 | 0.862 | 0.8 | 0.715 | 0.605 | 0.471 | 0.323 | 0.183 | 0.079 | 0.022 | 0.003 | 0 |
| 0.905999999999956 | 0.906 | 0.862 | 0.801 | 0.717 | 0.607 | 0.473 | 0.325 | 0.185 | 0.08 | 0.022 | 0.003 | 0 |
| 0.906499999999956 | 0.906 | 0.863 | 0.802 | 0.718 | 0.608 | 0.475 | 0.327 | 0.187 | 0.081 | 0.023 | 0.003 | 0 |
| 0.906999999999955 | 0.907 | 0.864 | 0.803 | 0.719 | 0.61 | 0.477 | 0.329 | 0.189 | 0.082 | 0.023 | 0.004 | 0 |
| 0.907499999999955 | 0.907 | 0.865 | 0.804 | 0.721 | 0.612 | 0.479 | 0.331 | 0.19 | 0.083 | 0.024 | 0.004 | 0 |
| 0.907999999999955 | 0.908 | 0.865 | 0.805 | 0.722 | 0.613 | 0.481 | 0.333 | 0.192 | 0.084 | 0.024 | 0.004 | 0 |
| 0.908499999999955 | 0.908 | 0.866 | 0.806 | 0.723 | 0.615 | 0.483 | 0.335 | 0.194 | 0.085 | 0.025 | 0.004 | 0 |
| 0.908999999999955 | 0.909 | 0.867 | 0.807 | 0.725 | 0.617 | 0.485 | 0.337 | 0.196 | 0.087 | 0.026 | 0.004 | 0 |
| 0.909499999999955 | 0.909 | 0.867 | 0.808 | 0.726 | 0.619 | 0.487 | 0.339 | 0.198 | 0.088 | 0.026 | 0.004 | 0 |
| 0.909999999999955 | 0.91 | 0.868 | 0.809 | 0.727 | 0.62 | 0.489 | 0.342 | 0.2 | 0.089 | 0.027 | 0.004 | 0 |
| 0.910499999999955 | 0.91 | 0.869 | 0.81 | 0.729 | 0.622 | 0.491 | 0.344 | 0.201 | 0.09 | 0.027 | 0.004 | 0 |
| 0.910999999999955 | 0.911 | 0.87 | 0.811 | 0.73 | 0.624 | 0.493 | 0.346 | 0.203 | 0.092 | 0.028 | 0.005 | 0 |
| 0.911499999999955 | 0.911 | 0.87 | 0.812 | 0.731 | 0.626 | 0.495 | 0.348 | 0.205 | 0.093 | 0.028 | 0.005 | 0 |
| 0.911999999999955 | 0.912 | 0.871 | 0.813 | 0.733 | 0.627 | 0.497 | 0.35 | 0.207 | 0.094 | 0.029 | 0.005 | 0 |
| 0.912499999999955 | 0.912 | 0.872 | 0.814 | 0.734 | 0.629 | 0.499 | 0.352 | 0.209 | 0.096 | 0.03 | 0.005 | 0 |
| 0.912999999999955 | 0.913 | 0.872 | 0.815 | 0.736 | 0.631 | 0.501 | 0.355 | 0.211 | 0.097 | 0.03 | 0.005 | 0 |
| 0.913499999999955 | 0.913 | 0.873 | 0.816 | 0.737 | 0.633 | 0.503 | 0.357 | 0.213 | 0.098 | 0.031 | 0.005 | 0 |
| 0.913999999999955 | 0.914 | 0.874 | 0.817 | 0.738 | 0.634 | 0.505 | 0.359 | 0.215 | 0.1 | 0.032 | 0.006 | 0 |
| 0.914499999999955 | 0.914 | 0.875 | 0.818 | 0.74 | 0.636 | 0.507 | 0.361 | 0.217 | 0.101 | 0.032 | 0.006 | 0 |
| 0.914999999999955 | 0.915 | 0.875 | 0.819 | 0.741 | 0.638 | 0.509 | 0.364 | 0.219 | 0.103 | 0.033 | 0.006 | 0 |
| 0.915499999999955 | 0.915 | 0.876 | 0.82 | 0.742 | 0.64 | 0.511 | 0.366 | 0.221 | 0.104 | 0.034 | 0.006 | 0 |
| 0.915999999999954 | 0.916 | 0.877 | 0.821 | 0.744 | 0.641 | 0.514 | 0.368 | 0.223 | 0.106 | 0.034 | 0.006 | 0.001 |
| 0.916499999999954 | 0.916 | 0.877 | 0.822 | 0.745 | 0.643 | 0.516 | 0.37 | 0.225 | 0.107 | 0.035 | 0.007 | 0.001 |
| 0.916999999999954 | 0.917 | 0.878 | 0.823 | 0.746 | 0.645 | 0.518 | 0.373 | 0.228 | 0.109 | 0.036 | 0.007 | 0.001 |
| 0.917499999999954 | 0.917 | 0.879 | 0.824 | 0.748 | 0.647 | 0.52 | 0.375 | 0.23 | 0.11 | 0.037 | 0.007 | 0.001 |
| 0.917999999999954 | 0.918 | 0.88 | 0.825 | 0.749 | 0.648 | 0.522 | 0.377 | 0.232 | 0.112 | 0.037 | 0.007 | 0.001 |
| 0.918499999999954 | 0.918 | 0.88 | 0.826 | 0.751 | 0.65 | 0.524 | 0.38 | 0.234 | 0.113 | 0.038 | 0.007 | 0.001 |
| 0.918999999999954 | 0.919 | 0.881 | 0.827 | 0.752 | 0.652 | 0.527 | 0.382 | 0.236 | 0.115 | 0.039 | 0.008 | 0.001 |
| 0.919499999999954 | 0.919 | 0.882 | 0.828 | 0.753 | 0.654 | 0.529 | 0.384 | 0.238 | 0.116 | 0.04 | 0.008 | 0.001 |
| 0.919999999999954 | 0.92 | 0.882 | 0.829 | 0.755 | 0.656 | 0.531 | 0.387 | 0.241 | 0.118 | 0.041 | 0.008 | 0.001 |
| 0.920499999999954 | 0.92 | 0.883 | 0.83 | 0.756 | 0.657 | 0.533 | 0.389 | 0.243 | 0.12 | 0.041 | 0.008 | 0.001 |
| 0.920999999999954 | 0.921 | 0.884 | 0.831 | 0.757 | 0.659 | 0.535 | 0.392 | 0.245 | 0.121 | 0.042 | 0.009 | 0.001 |
| 0.921499999999954 | 0.921 | 0.885 | 0.832 | 0.759 | 0.661 | 0.538 | 0.394 | 0.247 | 0.123 | 0.043 | 0.009 | 0.001 |
| 0.921999999999954 | 0.922 | 0.885 | 0.833 | 0.76 | 0.663 | 0.54 | 0.397 | 0.25 | 0.125 | 0.044 | 0.009 | 0.001 |
| 0.922499999999954 | 0.922 | 0.886 | 0.834 | 0.762 | 0.665 | 0.542 | 0.399 | 0.252 | 0.127 | 0.045 | 0.01 | 0.001 |
| 0.922999999999954 | 0.923 | 0.887 | 0.835 | 0.763 | 0.667 | 0.544 | 0.401 | 0.254 | 0.128 | 0.046 | 0.01 | 0.001 |
| 0.923499999999954 | 0.923 | 0.887 | 0.836 | 0.764 | 0.668 | 0.546 | 0.404 | 0.257 | 0.13 | 0.047 | 0.01 | 0.001 |
| 0.923999999999954 | 0.924 | 0.888 | 0.837 | 0.766 | 0.67 | 0.549 | 0.406 | 0.259 | 0.132 | 0.048 | 0.01 | 0.001 |
| 0.924499999999954 | 0.924 | 0.889 | 0.838 | 0.767 | 0.672 | 0.551 | 0.409 | 0.262 | 0.134 | 0.049 | 0.011 | 0.001 |
| 0.924999999999953 | 0.925 | 0.89 | 0.839 | 0.769 | 0.674 | 0.553 | 0.411 | 0.264 | 0.136 | 0.05 | 0.011 | 0.001 |
| 0.925499999999953 | 0.925 | 0.89 | 0.84 | 0.77 | 0.676 | 0.555 | 0.414 | 0.266 | 0.137 | 0.051 | 0.012 | 0.001 |
| 0.925999999999953 | 0.926 | 0.891 | 0.841 | 0.771 | 0.678 | 0.558 | 0.417 | 0.269 | 0.139 | 0.052 | 0.012 | 0.001 |
| 0.926499999999953 | 0.926 | 0.892 | 0.842 | 0.773 | 0.679 | 0.56 | 0.419 | 0.271 | 0.141 | 0.053 | 0.012 | 0.001 |
| 0.926999999999953 | 0.927 | 0.893 | 0.843 | 0.774 | 0.681 | 0.562 | 0.422 | 0.274 | 0.143 | 0.054 | 0.013 | 0.001 |
| 0.927499999999953 | 0.927 | 0.893 | 0.844 | 0.776 | 0.683 | 0.565 | 0.424 | 0.276 | 0.145 | 0.055 | 0.013 | 0.001 |
| 0.927999999999953 | 0.928 | 0.894 | 0.845 | 0.777 | 0.685 | 0.567 | 0.427 | 0.279 | 0.147 | 0.057 | 0.013 | 0.002 |
| 0.928499999999953 | 0.928 | 0.895 | 0.846 | 0.779 | 0.687 | 0.569 | 0.43 | 0.282 | 0.149 | 0.058 | 0.014 | 0.002 |
| 0.928999999999953 | 0.929 | 0.895 | 0.847 | 0.78 | 0.689 | 0.572 | 0.432 | 0.284 | 0.151 | 0.059 | 0.014 | 0.002 |
| 0.929499999999953 | 0.929 | 0.896 | 0.848 | 0.781 | 0.691 | 0.574 | 0.435 | 0.287 | 0.154 | 0.06 | 0.015 | 0.002 |
| 0.929999999999953 | 0.93 | 0.897 | 0.849 | 0.783 | 0.693 | 0.576 | 0.438 | 0.289 | 0.156 | 0.061 | 0.015 | 0.002 |
| 0.930499999999953 | 0.93 | 0.898 | 0.85 | 0.784 | 0.694 | 0.579 | 0.44 | 0.292 | 0.158 | 0.063 | 0.016 | 0.002 |
| 0.930999999999953 | 0.931 | 0.898 | 0.851 | 0.786 | 0.696 | 0.581 | 0.443 | 0.295 | 0.16 | 0.064 | 0.016 | 0.002 |
| 0.931499999999953 | 0.931 | 0.899 | 0.852 | 0.787 | 0.698 | 0.583 | 0.446 | 0.297 | 0.162 | 0.065 | 0.017 | 0.002 |
| 0.931999999999953 | 0.932 | 0.9 | 0.853 | 0.788 | 0.7 | 0.586 | 0.448 | 0.3 | 0.164 | 0.067 | 0.017 | 0.002 |
| 0.932499999999953 | 0.932 | 0.9 | 0.854 | 0.79 | 0.702 | 0.588 | 0.451 | 0.303 | 0.167 | 0.068 | 0.018 | 0.002 |
| 0.932999999999953 | 0.933 | 0.901 | 0.856 | 0.791 | 0.704 | 0.591 | 0.454 | 0.306 | 0.169 | 0.07 | 0.018 | 0.002 |
| 0.933499999999953 | 0.933 | 0.902 | 0.857 | 0.793 | 0.706 | 0.593 | 0.457 | 0.309 | 0.171 | 0.071 | 0.019 | 0.003 |
| 0.933999999999953 | 0.934 | 0.903 | 0.858 | 0.794 | 0.708 | 0.595 | 0.459 | 0.311 | 0.174 | 0.072 | 0.02 | 0.003 |
| 0.934499999999952 | 0.934 | 0.903 | 0.859 | 0.796 | 0.71 | 0.598 | 0.462 | 0.314 | 0.176 | 0.074 | 0.02 | 0.003 |
| 0.934999999999952 | 0.935 | 0.904 | 0.86 | 0.797 | 0.712 | 0.6 | 0.465 | 0.317 | 0.179 | 0.075 | 0.021 | 0.003 |
| 0.935499999999952 | 0.935 | 0.905 | 0.861 | 0.798 | 0.714 | 0.603 | 0.468 | 0.32 | 0.181 | 0.077 | 0.021 | 0.003 |
| 0.935999999999952 | 0.936 | 0.906 | 0.862 | 0.8 | 0.715 | 0.605 | 0.471 | 0.323 | 0.184 | 0.079 | 0.022 | 0.003 |
| 0.936499999999952 | 0.936 | 0.906 | 0.863 | 0.801 | 0.717 | 0.608 | 0.474 | 0.326 | 0.186 | 0.08 | 0.023 | 0.003 |
| 0.936999999999952 | 0.937 | 0.907 | 0.864 | 0.803 | 0.719 | 0.61 | 0.477 | 0.329 | 0.189 | 0.082 | 0.023 | 0.004 |
| 0.937499999999952 | 0.937 | 0.908 | 0.865 | 0.804 | 0.721 | 0.613 | 0.479 | 0.332 | 0.191 | 0.084 | 0.024 | 0.004 |
| 0.937999999999952 | 0.938 | 0.908 | 0.866 | 0.806 | 0.723 | 0.615 | 0.482 | 0.335 | 0.194 | 0.085 | 0.025 | 0.004 |
| 0.938499999999952 | 0.938 | 0.909 | 0.867 | 0.807 | 0.725 | 0.618 | 0.485 | 0.338 | 0.197 | 0.087 | 0.026 | 0.004 |
| 0.938999999999952 | 0.939 | 0.91 | 0.868 | 0.809 | 0.727 | 0.62 | 0.488 | 0.341 | 0.199 | 0.089 | 0.027 | 0.004 |
| 0.939499999999952 | 0.939 | 0.911 | 0.869 | 0.81 | 0.729 | 0.623 | 0.491 | 0.344 | 0.202 | 0.091 | 0.027 | 0.005 |
| 0.939999999999952 | 0.94 | 0.911 | 0.87 | 0.812 | 0.731 | 0.625 | 0.494 | 0.347 | 0.205 | 0.093 | 0.028 | 0.005 |
| 0.940499999999952 | 0.94 | 0.912 | 0.871 | 0.813 | 0.733 | 0.628 | 0.497 | 0.351 | 0.208 | 0.095 | 0.029 | 0.005 |
| 0.940999999999952 | 0.941 | 0.913 | 0.872 | 0.814 | 0.735 | 0.63 | 0.5 | 0.354 | 0.21 | 0.097 | 0.03 | 0.005 |
| 0.941499999999952 | 0.941 | 0.914 | 0.873 | 0.816 | 0.737 | 0.633 | 0.503 | 0.357 | 0.213 | 0.099 | 0.031 | 0.005 |
| 0.941999999999952 | 0.942 | 0.914 | 0.874 | 0.817 | 0.739 | 0.635 | 0.506 | 0.36 | 0.216 | 0.101 | 0.032 | 0.006 |
| 0.942499999999952 | 0.942 | 0.915 | 0.875 | 0.819 | 0.741 | 0.638 | 0.509 | 0.364 | 0.219 | 0.103 | 0.033 | 0.006 |
| 0.942999999999952 | 0.943 | 0.916 | 0.876 | 0.82 | 0.743 | 0.64 | 0.512 | 0.367 | 0.222 | 0.105 | 0.034 | 0.006 |
| 0.943499999999951 | 0.943 | 0.916 | 0.877 | 0.822 | 0.745 | 0.643 | 0.516 | 0.37 | 0.225 | 0.107 | 0.035 | 0.007 |
| 0.943999999999951 | 0.944 | 0.917 | 0.878 | 0.823 | 0.747 | 0.646 | 0.519 | 0.374 | 0.228 | 0.109 | 0.036 | 0.007 |
| 0.944499999999951 | 0.944 | 0.918 | 0.879 | 0.825 | 0.749 | 0.648 | 0.522 | 0.377 | 0.231 | 0.111 | 0.037 | 0.007 |
| 0.944999999999951 | 0.945 | 0.919 | 0.88 | 0.826 | 0.751 | 0.651 | 0.525 | 0.38 | 0.235 | 0.114 | 0.038 | 0.007 |
| 0.945499999999951 | 0.945 | 0.919 | 0.882 | 0.828 | 0.753 | 0.653 | 0.528 | 0.384 | 0.238 | 0.116 | 0.039 | 0.008 |
| 0.945999999999951 | 0.946 | 0.92 | 0.883 | 0.829 | 0.755 | 0.656 | 0.531 | 0.387 | 0.241 | 0.118 | 0.041 | 0.008 |
| 0.946499999999951 | 0.946 | 0.921 | 0.884 | 0.831 | 0.757 | 0.659 | 0.535 | 0.391 | 0.244 | 0.121 | 0.042 | 0.009 |
| 0.946999999999951 | 0.947 | 0.922 | 0.885 | 0.832 | 0.759 | 0.661 | 0.538 | 0.394 | 0.248 | 0.123 | 0.043 | 0.009 |
| 0.947499999999951 | 0.947 | 0.922 | 0.886 | 0.834 | 0.761 | 0.664 | 0.541 | 0.398 | 0.251 | 0.126 | 0.045 | 0.009 |
| 0.947999999999951 | 0.948 | 0.923 | 0.887 | 0.835 | 0.763 | 0.667 | 0.544 | 0.402 | 0.254 | 0.128 | 0.046 | 0.01 |
| 0.948499999999951 | 0.948 | 0.924 | 0.888 | 0.837 | 0.765 | 0.669 | 0.548 | 0.405 | 0.258 | 0.131 | 0.047 | 0.01 |
| 0.948999999999951 | 0.949 | 0.924 | 0.889 | 0.838 | 0.767 | 0.672 | 0.551 | 0.409 | 0.261 | 0.134 | 0.049 | 0.011 |
| 0.949499999999951 | 0.949 | 0.925 | 0.89 | 0.84 | 0.769 | 0.675 | 0.554 | 0.413 | 0.265 | 0.136 | 0.05 | 0.011 |
| 0.949999999999951 | 0.95 | 0.926 | 0.891 | 0.841 | 0.771 | 0.677 | 0.558 | 0.416 | 0.269 | 0.139 | 0.052 | 0.012 |
| 0.950499999999951 | 0.95 | 0.927 | 0.892 | 0.843 | 0.773 | 0.68 | 0.561 | 0.42 | 0.272 | 0.142 | 0.054 | 0.012 |
| 0.950999999999951 | 0.951 | 0.927 | 0.893 | 0.844 | 0.775 | 0.683 | 0.564 | 0.424 | 0.276 | 0.145 | 0.055 | 0.013 |
| 0.951499999999951 | 0.951 | 0.928 | 0.894 | 0.846 | 0.777 | 0.686 | 0.568 | 0.428 | 0.28 | 0.148 | 0.057 | 0.014 |
| 0.951999999999951 | 0.952 | 0.929 | 0.895 | 0.847 | 0.78 | 0.688 | 0.571 | 0.432 | 0.283 | 0.151 | 0.059 | 0.014 |
| 0.95249999999995 | 0.952 | 0.93 | 0.896 | 0.849 | 0.782 | 0.691 | 0.574 | 0.435 | 0.287 | 0.154 | 0.06 | 0.015 |
| 0.95299999999995 | 0.953 | 0.93 | 0.897 | 0.85 | 0.784 | 0.694 | 0.578 | 0.439 | 0.291 | 0.157 | 0.062 | 0.016 |
| 0.95349999999995 | 0.953 | 0.931 | 0.898 | 0.852 | 0.786 | 0.697 | 0.581 | 0.443 | 0.295 | 0.16 | 0.064 | 0.016 |
| 0.95399999999995 | 0.954 | 0.932 | 0.899 | 0.853 | 0.788 | 0.699 | 0.585 | 0.447 | 0.299 | 0.164 | 0.066 | 0.017 |
| 0.95449999999995 | 0.954 | 0.933 | 0.901 | 0.855 | 0.79 | 0.702 | 0.588 | 0.451 | 0.303 | 0.167 | 0.068 | 0.018 |
| 0.95499999999995 | 0.955 | 0.933 | 0.902 | 0.856 | 0.792 | 0.705 | 0.592 | 0.455 | 0.307 | 0.17 | 0.07 | 0.019 |
| 0.95549999999995 | 0.955 | 0.934 | 0.903 | 0.858 | 0.794 | 0.708 | 0.595 | 0.459 | 0.311 | 0.174 | 0.072 | 0.019 |
| 0.95599999999995 | 0.956 | 0.935 | 0.904 | 0.859 | 0.796 | 0.711 | 0.599 | 0.464 | 0.316 | 0.177 | 0.075 | 0.02 |
| 0.95649999999995 | 0.956 | 0.935 | 0.905 | 0.861 | 0.798 | 0.713 | 0.603 | 0.468 | 0.32 | 0.181 | 0.077 | 0.021 |
| 0.95699999999995 | 0.957 | 0.936 | 0.906 | 0.862 | 0.801 | 0.716 | 0.606 | 0.472 | 0.324 | 0.185 | 0.079 | 0.022 |
| 0.95749999999995 | 0.957 | 0.937 | 0.907 | 0.864 | 0.803 | 0.719 | 0.61 | 0.476 | 0.329 | 0.188 | 0.082 | 0.023 |
| 0.95799999999995 | 0.958 | 0.938 | 0.908 | 0.865 | 0.805 | 0.722 | 0.613 | 0.48 | 0.333 | 0.192 | 0.084 | 0.024 |
| 0.95849999999995 | 0.958 | 0.938 | 0.909 | 0.867 | 0.807 | 0.725 | 0.617 | 0.485 | 0.337 | 0.196 | 0.087 | 0.026 |
| 0.95899999999995 | 0.959 | 0.939 | 0.91 | 0.868 | 0.809 | 0.728 | 0.621 | 0.489 | 0.342 | 0.2 | 0.089 | 0.027 |
| 0.95949999999995 | 0.959 | 0.94 | 0.911 | 0.87 | 0.811 | 0.731 | 0.624 | 0.493 | 0.347 | 0.204 | 0.092 | 0.028 |
| 0.95999999999995 | 0.96 | 0.941 | 0.912 | 0.871 | 0.813 | 0.733 | 0.628 | 0.498 | 0.351 | 0.208 | 0.095 | 0.029 |
| 0.96049999999995 | 0.96 | 0.941 | 0.913 | 0.873 | 0.815 | 0.736 | 0.632 | 0.502 | 0.356 | 0.212 | 0.098 | 0.031 |
| 0.96099999999995 | 0.961 | 0.942 | 0.914 | 0.874 | 0.818 | 0.739 | 0.636 | 0.507 | 0.361 | 0.217 | 0.101 | 0.032 |
| 0.961499999999949 | 0.961 | 0.943 | 0.915 | 0.876 | 0.82 | 0.742 | 0.639 | 0.511 | 0.366 | 0.221 | 0.104 | 0.034 |
| 0.961999999999949 | 0.962 | 0.944 | 0.917 | 0.877 | 0.822 | 0.745 | 0.643 | 0.516 | 0.371 | 0.226 | 0.107 | 0.035 |
| 0.962499999999949 | 0.962 | 0.944 | 0.918 | 0.879 | 0.824 | 0.748 | 0.647 | 0.52 | 0.375 | 0.23 | 0.11 | 0.037 |
| 0.962999999999949 | 0.963 | 0.945 | 0.919 | 0.881 | 0.826 | 0.751 | 0.651 | 0.525 | 0.381 | 0.235 | 0.114 | 0.038 |
| 0.963499999999949 | 0.963 | 0.946 | 0.92 | 0.882 | 0.828 | 0.754 | 0.655 | 0.53 | 0.386 | 0.239 | 0.117 | 0.04 |
| 0.963999999999949 | 0.964 | 0.946 | 0.921 | 0.884 | 0.831 | 0.757 | 0.659 | 0.534 | 0.391 | 0.244 | 0.121 | 0.042 |
| 0.964499999999949 | 0.964 | 0.947 | 0.922 | 0.885 | 0.833 | 0.76 | 0.663 | 0.539 | 0.396 | 0.249 | 0.124 | 0.044 |
| 0.964999999999949 | 0.965 | 0.948 | 0.923 | 0.887 | 0.835 | 0.763 | 0.666 | 0.544 | 0.401 | 0.254 | 0.128 | 0.046 |
| 0.965499999999949 | 0.965 | 0.949 | 0.924 | 0.888 | 0.837 | 0.766 | 0.67 | 0.549 | 0.407 | 0.259 | 0.132 | 0.048 |
| 0.965999999999949 | 0.966 | 0.949 | 0.925 | 0.89 | 0.839 | 0.769 | 0.674 | 0.554 | 0.412 | 0.265 | 0.136 | 0.05 |
| 0.966499999999949 | 0.966 | 0.95 | 0.926 | 0.891 | 0.842 | 0.772 | 0.678 | 0.559 | 0.418 | 0.27 | 0.14 | 0.052 |
| 0.966999999999949 | 0.967 | 0.951 | 0.927 | 0.893 | 0.844 | 0.775 | 0.682 | 0.564 | 0.423 | 0.275 | 0.144 | 0.055 |
| 0.967499999999949 | 0.967 | 0.952 | 0.928 | 0.894 | 0.846 | 0.778 | 0.686 | 0.569 | 0.429 | 0.281 | 0.149 | 0.057 |
| 0.967999999999949 | 0.968 | 0.952 | 0.929 | 0.896 | 0.848 | 0.781 | 0.69 | 0.574 | 0.435 | 0.286 | 0.153 | 0.06 |
| 0.968499999999949 | 0.968 | 0.953 | 0.931 | 0.898 | 0.85 | 0.784 | 0.694 | 0.579 | 0.44 | 0.292 | 0.158 | 0.063 |
| 0.968999999999949 | 0.969 | 0.954 | 0.932 | 0.899 | 0.853 | 0.787 | 0.699 | 0.584 | 0.446 | 0.298 | 0.163 | 0.066 |
| 0.969499999999949 | 0.969 | 0.955 | 0.933 | 0.901 | 0.855 | 0.79 | 0.703 | 0.589 | 0.452 | 0.304 | 0.168 | 0.069 |
| 0.969999999999949 | 0.97 | 0.955 | 0.934 | 0.902 | 0.857 | 0.794 | 0.707 | 0.594 | 0.458 | 0.31 | 0.173 | 0.072 |
| 0.970499999999948 | 0.97 | 0.956 | 0.935 | 0.904 | 0.859 | 0.797 | 0.711 | 0.6 | 0.464 | 0.316 | 0.178 | 0.075 |
| 0.970999999999948 | 0.971 | 0.957 | 0.936 | 0.905 | 0.862 | 0.8 | 0.715 | 0.605 | 0.47 | 0.323 | 0.183 | 0.078 |
| 0.971499999999948 | 0.971 | 0.958 | 0.937 | 0.907 | 0.864 | 0.803 | 0.719 | 0.61 | 0.477 | 0.329 | 0.189 | 0.082 |
| 0.971999999999948 | 0.972 | 0.958 | 0.938 | 0.909 | 0.866 | 0.806 | 0.724 | 0.616 | 0.483 | 0.336 | 0.194 | 0.086 |
| 0.972499999999948 | 0.972 | 0.959 | 0.939 | 0.91 | 0.868 | 0.809 | 0.728 | 0.621 | 0.489 | 0.342 | 0.2 | 0.09 |
| 0.972999999999948 | 0.973 | 0.96 | 0.94 | 0.912 | 0.871 | 0.812 | 0.732 | 0.626 | 0.496 | 0.349 | 0.206 | 0.094 |
| 0.973499999999948 | 0.973 | 0.961 | 0.941 | 0.913 | 0.873 | 0.816 | 0.736 | 0.632 | 0.502 | 0.356 | 0.213 | 0.098 |
| 0.973999999999948 | 0.974 | 0.961 | 0.942 | 0.915 | 0.875 | 0.819 | 0.741 | 0.638 | 0.509 | 0.363 | 0.219 | 0.102 |
| 0.974499999999948 | 0.974 | 0.962 | 0.944 | 0.917 | 0.877 | 0.822 | 0.745 | 0.643 | 0.516 | 0.37 | 0.225 | 0.107 |
| 0.974999999999948 | 0.975 | 0.963 | 0.945 | 0.918 | 0.88 | 0.825 | 0.749 | 0.649 | 0.523 | 0.378 | 0.232 | 0.112 |
| 0.975499999999948 | 0.975 | 0.963 | 0.946 | 0.92 | 0.882 | 0.828 | 0.754 | 0.655 | 0.53 | 0.385 | 0.239 | 0.117 |
| 0.975999999999948 | 0.976 | 0.964 | 0.947 | 0.921 | 0.884 | 0.832 | 0.758 | 0.66 | 0.537 | 0.393 | 0.246 | 0.122 |
| 0.976499999999948 | 0.976 | 0.965 | 0.948 | 0.923 | 0.887 | 0.835 | 0.763 | 0.666 | 0.544 | 0.401 | 0.254 | 0.128 |
| 0.976999999999948 | 0.977 | 0.966 | 0.949 | 0.924 | 0.889 | 0.838 | 0.767 | 0.672 | 0.551 | 0.409 | 0.261 | 0.134 |
| 0.977499999999948 | 0.977 | 0.966 | 0.95 | 0.926 | 0.891 | 0.841 | 0.772 | 0.678 | 0.558 | 0.417 | 0.269 | 0.14 |
| 0.977999999999948 | 0.978 | 0.967 | 0.951 | 0.928 | 0.893 | 0.845 | 0.776 | 0.684 | 0.565 | 0.425 | 0.277 | 0.146 |
| 0.978499999999948 | 0.978 | 0.968 | 0.952 | 0.929 | 0.896 | 0.848 | 0.781 | 0.69 | 0.573 | 0.434 | 0.286 | 0.153 |
| 0.978999999999948 | 0.979 | 0.969 | 0.953 | 0.931 | 0.898 | 0.851 | 0.785 | 0.696 | 0.58 | 0.442 | 0.294 | 0.159 |
| 0.979499999999947 | 0.979 | 0.969 | 0.954 | 0.932 | 0.9 | 0.854 | 0.79 | 0.702 | 0.588 | 0.451 | 0.303 | 0.167 |
| 0.979999999999947 | 0.98 | 0.97 | 0.956 | 0.934 | 0.903 | 0.858 | 0.794 | 0.708 | 0.596 | 0.46 | 0.312 | 0.174 |
| 0.980499999999947 | 0.98 | 0.971 | 0.957 | 0.936 | 0.905 | 0.861 | 0.799 | 0.714 | 0.604 | 0.469 | 0.321 | 0.182 |
| 0.980999999999947 | 0.981 | 0.972 | 0.958 | 0.937 | 0.907 | 0.864 | 0.804 | 0.721 | 0.612 | 0.478 | 0.331 | 0.19 |
| 0.981499999999947 | 0.981 | 0.972 | 0.959 | 0.939 | 0.91 | 0.868 | 0.808 | 0.727 | 0.62 | 0.488 | 0.341 | 0.199 |
| 0.981999999999947 | 0.982 | 0.973 | 0.96 | 0.941 | 0.912 | 0.871 | 0.813 | 0.733 | 0.628 | 0.497 | 0.351 | 0.208 |
| 0.982499999999947 | 0.982 | 0.974 | 0.961 | 0.942 | 0.914 | 0.875 | 0.818 | 0.74 | 0.636 | 0.507 | 0.361 | 0.217 |
| 0.982999999999947 | 0.983 | 0.975 | 0.962 | 0.944 | 0.917 | 0.878 | 0.823 | 0.746 | 0.644 | 0.517 | 0.372 | 0.227 |
| 0.983499999999947 | 0.983 | 0.975 | 0.963 | 0.945 | 0.919 | 0.881 | 0.827 | 0.753 | 0.653 | 0.527 | 0.383 | 0.237 |
| 0.983999999999947 | 0.984 | 0.976 | 0.964 | 0.947 | 0.922 | 0.885 | 0.832 | 0.759 | 0.661 | 0.538 | 0.395 | 0.248 |
| 0.984499999999947 | 0.984 | 0.977 | 0.965 | 0.949 | 0.924 | 0.888 | 0.837 | 0.766 | 0.67 | 0.549 | 0.406 | 0.259 |
| 0.984999999999947 | 0.985 | 0.978 | 0.967 | 0.95 | 0.926 | 0.892 | 0.842 | 0.772 | 0.679 | 0.559 | 0.418 | 0.271 |
| 0.985499999999947 | 0.985 | 0.978 | 0.968 | 0.952 | 0.929 | 0.895 | 0.847 | 0.779 | 0.688 | 0.57 | 0.431 | 0.283 |
| 0.985999999999947 | 0.986 | 0.979 | 0.969 | 0.954 | 0.931 | 0.898 | 0.852 | 0.786 | 0.697 | 0.582 | 0.444 | 0.295 |
| 0.986499999999947 | 0.986 | 0.98 | 0.97 | 0.955 | 0.934 | 0.902 | 0.857 | 0.793 | 0.706 | 0.593 | 0.457 | 0.309 |
| 0.986999999999947 | 0.987 | 0.981 | 0.971 | 0.957 | 0.936 | 0.905 | 0.862 | 0.8 | 0.715 | 0.605 | 0.47 | 0.322 |
| 0.987499999999947 | 0.987 | 0.981 | 0.972 | 0.958 | 0.938 | 0.909 | 0.867 | 0.807 | 0.724 | 0.617 | 0.484 | 0.337 |
| 0.987999999999947 | 0.988 | 0.982 | 0.973 | 0.96 | 0.941 | 0.912 | 0.872 | 0.814 | 0.734 | 0.629 | 0.498 | 0.352 |
| 0.988499999999946 | 0.988 | 0.983 | 0.974 | 0.962 | 0.943 | 0.916 | 0.877 | 0.821 | 0.743 | 0.641 | 0.513 | 0.368 |
| 0.988999999999946 | 0.989 | 0.984 | 0.975 | 0.963 | 0.946 | 0.919 | 0.882 | 0.828 | 0.753 | 0.654 | 0.528 | 0.384 |
| 0.989499999999946 | 0.989 | 0.984 | 0.977 | 0.965 | 0.948 | 0.923 | 0.887 | 0.835 | 0.763 | 0.666 | 0.544 | 0.401 |
| 0.989999999999946 | 0.99 | 0.985 | 0.978 | 0.967 | 0.95 | 0.927 | 0.892 | 0.842 | 0.773 | 0.68 | 0.56 | 0.419 |
| 0.990499999999946 | 0.99 | 0.986 | 0.979 | 0.968 | 0.953 | 0.93 | 0.897 | 0.85 | 0.783 | 0.693 | 0.577 | 0.438 |
| 0.990999999999946 | 0.991 | 0.987 | 0.98 | 0.97 | 0.955 | 0.934 | 0.902 | 0.857 | 0.793 | 0.706 | 0.594 | 0.457 |
| 0.991499999999946 | 0.991 | 0.987 | 0.981 | 0.972 | 0.958 | 0.937 | 0.907 | 0.864 | 0.804 | 0.72 | 0.611 | 0.478 |
| 0.991999999999946 | 0.992 | 0.988 | 0.982 | 0.973 | 0.96 | 0.941 | 0.913 | 0.872 | 0.814 | 0.734 | 0.629 | 0.499 |
| 0.992499999999946 | 0.992 | 0.989 | 0.983 | 0.975 | 0.963 | 0.944 | 0.918 | 0.879 | 0.825 | 0.749 | 0.648 | 0.521 |
| 0.992999999999946 | 0.993 | 0.99 | 0.984 | 0.977 | 0.965 | 0.948 | 0.923 | 0.887 | 0.835 | 0.763 | 0.667 | 0.545 |
| 0.993499999999946 | 0.993 | 0.99 | 0.985 | 0.978 | 0.968 | 0.952 | 0.928 | 0.895 | 0.846 | 0.778 | 0.687 | 0.569 |
| 0.993999999999946 | 0.994 | 0.991 | 0.987 | 0.98 | 0.97 | 0.955 | 0.934 | 0.902 | 0.857 | 0.793 | 0.707 | 0.594 |
| 0.994499999999946 | 0.994 | 0.992 | 0.988 | 0.982 | 0.972 | 0.959 | 0.939 | 0.91 | 0.868 | 0.809 | 0.728 | 0.621 |
| 0.994999999999946 | 0.995 | 0.993 | 0.989 | 0.983 | 0.975 | 0.963 | 0.945 | 0.918 | 0.879 | 0.825 | 0.749 | 0.648 |
| 0.995499999999946 | 0.995 | 0.993 | 0.99 | 0.985 | 0.977 | 0.966 | 0.95 | 0.926 | 0.891 | 0.841 | 0.771 | 0.677 |
| 0.995999999999946 | 0.996 | 0.994 | 0.991 | 0.987 | 0.98 | 0.97 | 0.955 | 0.934 | 0.902 | 0.857 | 0.794 | 0.707 |
| 0.996499999999946 | 0.996 | 0.995 | 0.992 | 0.988 | 0.982 | 0.974 | 0.961 | 0.942 | 0.914 | 0.874 | 0.817 | 0.738 |
| 0.996999999999946 | 0.997 | 0.996 | 0.993 | 0.99 | 0.985 | 0.977 | 0.966 | 0.95 | 0.926 | 0.891 | 0.841 | 0.771 |
| 0.997499999999945 | 0.997 | 0.996 | 0.994 | 0.992 | 0.987 | 0.981 | 0.972 | 0.958 | 0.938 | 0.908 | 0.866 | 0.805 |
| 0.997999999999945 | 0.998 | 0.997 | 0.996 | 0.993 | 0.99 | 0.985 | 0.977 | 0.966 | 0.95 | 0.926 | 0.891 | 0.841 |
| 0.998499999999945 | 0.998 | 0.998 | 0.997 | 0.995 | 0.992 | 0.989 | 0.983 | 0.975 | 0.962 | 0.944 | 0.917 | 0.878 |
| 0.998999999999945 | 0.999 | 0.999 | 0.998 | 0.997 | 0.995 | 0.992 | 0.989 | 0.983 | 0.975 | 0.962 | 0.944 | 0.917 |
| 0.999499999999945 | 0.999 | 0.999 | 0.999 | 0.998 | 0.997 | 0.996 | 0.994 | 0.991 | 0.987 | 0.981 | 0.972 | 0.958 |
| 0.999999999999945 | 1 | 1 | 1 | 1 | 1 | 1 | 1 | 1 | 1 | 1 | 1 | 1 |